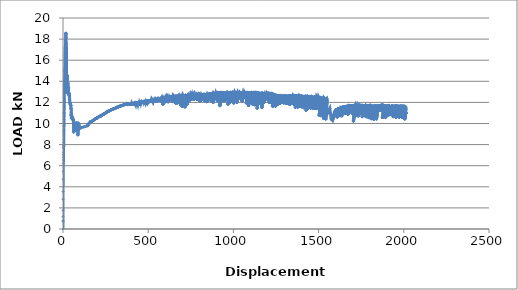
| Category | Series 0 |
|---|---|
| 0.0 | 0 |
| 0.1 | 0.731 |
| 0.1 | 0.772 |
| 0.2 | 1.182 |
| 0.4 | 1.762 |
| 0.2 | 2.816 |
| 0.4 | 3.547 |
| 1.2 | 4.716 |
| 1.7 | 5.472 |
| 2.1 | 6.233 |
| 2.5 | 6.541 |
| 2.5 | 6.817 |
| 2.7 | 7.037 |
| 3.1 | 7.277 |
| 3.4 | 7.614 |
| 3.6 | 7.684 |
| 3.7 | 7.78 |
| 3.8 | 7.901 |
| 3.7 | 8.169 |
| 3.9 | 8.473 |
| 4.6 | 8.924 |
| 4.6 | 9.165 |
| 4.9 | 9.346 |
| 4.9 | 9.458 |
| 5.2 | 9.715 |
| 5.2 | 9.853 |
| 5.5 | 10.133 |
| 5.6 | 10.359 |
| 6.2 | 10.676 |
| 6.3 | 10.802 |
| 6.5 | 10.89 |
| 6.5 | 10.94 |
| 6.5 | 11.046 |
| 6.6 | 11.286 |
| 6.9 | 11.54 |
| 7.2 | 11.979 |
| 7.5 | 12.206 |
| 7.7 | 12.394 |
| 7.7 | 12.532 |
| 7.8 | 12.82 |
| 8.1 | 13.071 |
| 8.5 | 13.345 |
| 8.9 | 13.573 |
| 8.9 | 13.619 |
| 8.9 | 13.671 |
| 9.0 | 13.78 |
| 9.4 | 14.047 |
| 9.6 | 14.248 |
| 9.7 | 14.481 |
| 10.0 | 14.672 |
| 10.3 | 14.908 |
| 10.6 | 15.036 |
| 10.8 | 15.135 |
| 10.7 | 15.183 |
| 11.0 | 15.326 |
| 11.2 | 15.461 |
| 11.4 | 15.629 |
| 11.5 | 15.807 |
| 11.5 | 15.944 |
| 11.8 | 16.232 |
| 12.0 | 16.475 |
| 12.5 | 16.856 |
| 12.8 | 17.008 |
| 13.1 | 17.062 |
| 13.1 | 17.056 |
| 13.2 | 17.079 |
| 13.4 | 17.124 |
| 13.5 | 17.217 |
| 14.0 | 17.317 |
| 14.4 | 17.356 |
| 14.5 | 17.342 |
| 14.2 | 17.288 |
| 14.5 | 17.336 |
| 14.6 | 17.454 |
| 15.0 | 17.661 |
| 15.1 | 17.725 |
| 15.2 | 17.783 |
| 15.3 | 17.84 |
| 15.5 | 18.006 |
| 15.8 | 18.157 |
| 16.0 | 18.31 |
| 16.3 | 18.41 |
| 16.5 | 18.492 |
| 16.7 | 18.592 |
| 17.0 | 18.587 |
| 17.6 | 18.541 |
| 17.8 | 18.467 |
| 17.9 | 18.152 |
| 17.8 | 17.904 |
| 17.9 | 17.732 |
| 18.2 | 17.679 |
| 18.4 | 17.642 |
| 18.4 | 17.598 |
| 18.8 | 17.542 |
| 19.0 | 17.501 |
| 19.3 | 17.44 |
| 20.2 | 17.125 |
| 21.0 | 16.65 |
| 21.1 | 15.382 |
| 20.3 | 14.227 |
| 19.0 | 12.898 |
| 18.8 | 12.885 |
| 19.6 | 13.461 |
| 19.9 | 13.871 |
| 20.3 | 14.078 |
| 20.2 | 14.096 |
| 20.3 | 14.102 |
| 20.4 | 14.192 |
| 20.8 | 14.307 |
| 21.0 | 14.466 |
| 21.2 | 14.553 |
| 21.7 | 14.587 |
| 21.7 | 14.578 |
| 22.0 | 14.49 |
| 22.0 | 14.438 |
| 22.2 | 14.433 |
| 22.3 | 14.44 |
| 22.4 | 14.446 |
| 22.4 | 14.444 |
| 22.7 | 14.49 |
| 23.1 | 14.575 |
| 23.4 | 14.611 |
| 23.7 | 14.53 |
| 23.9 | 14.426 |
| 24.2 | 14.408 |
| 24.3 | 14.463 |
| 24.8 | 14.505 |
| 25.3 | 14.48 |
| 25.8 | 14.393 |
| 25.9 | 14.266 |
| 25.6 | 13.951 |
| 25.4 | 13.834 |
| 25.4 | 13.817 |
| 25.9 | 13.904 |
| 26.1 | 13.967 |
| 26.1 | 13.994 |
| 26.4 | 13.991 |
| 26.8 | 13.997 |
| 27.1 | 13.996 |
| 27.2 | 13.931 |
| 27.1 | 13.888 |
| 27.3 | 13.86 |
| 27.5 | 13.854 |
| 27.8 | 13.847 |
| 27.9 | 13.831 |
| 28.1 | 13.816 |
| 28.4 | 13.791 |
| 28.6 | 13.776 |
| 29.0 | 13.753 |
| 29.2 | 13.696 |
| 29.1 | 13.582 |
| 29.2 | 13.506 |
| 29.3 | 13.467 |
| 29.3 | 13.465 |
| 29.6 | 13.466 |
| 29.9 | 13.47 |
| 30.0 | 13.47 |
| 30.1 | 13.456 |
| 30.3 | 13.447 |
| 30.6 | 13.446 |
| 31.0 | 13.448 |
| 31.2 | 13.433 |
| 31.3 | 13.415 |
| 31.6 | 13.389 |
| 31.7 | 13.372 |
| 32.0 | 13.34 |
| 32.3 | 13.305 |
| 32.5 | 13.248 |
| 32.8 | 13.084 |
| 32.8 | 12.944 |
| 32.6 | 12.783 |
| 32.6 | 12.743 |
| 32.8 | 12.744 |
| 33.0 | 12.812 |
| 33.4 | 12.908 |
| 33.5 | 12.914 |
| 33.7 | 12.897 |
| 33.9 | 12.887 |
| 34.2 | 12.877 |
| 34.3 | 12.858 |
| 34.5 | 12.845 |
| 34.9 | 12.825 |
| 35.0 | 12.802 |
| 34.9 | 12.732 |
| 34.9 | 12.693 |
| 35.1 | 12.704 |
| 35.4 | 12.735 |
| 35.7 | 12.784 |
| 36.1 | 12.783 |
| 36.3 | 12.757 |
| 36.4 | 12.722 |
| 36.6 | 12.691 |
| 36.8 | 12.657 |
| 36.9 | 12.643 |
| 37.0 | 12.622 |
| 37.3 | 12.612 |
| 37.6 | 12.594 |
| 37.7 | 12.567 |
| 38.0 | 12.492 |
| 38.0 | 12.426 |
| 38.1 | 12.36 |
| 38.2 | 12.339 |
| 38.6 | 12.327 |
| 38.8 | 12.317 |
| 39.2 | 12.3 |
| 39.4 | 12.219 |
| 39.4 | 12.136 |
| 39.4 | 12.019 |
| 39.4 | 11.982 |
| 39.6 | 11.968 |
| 39.8 | 11.968 |
| 39.9 | 11.965 |
| 40.1 | 11.965 |
| 40.2 | 11.977 |
| 40.5 | 11.996 |
| 40.8 | 12.006 |
| 41.0 | 12 |
| 41.1 | 11.985 |
| 41.4 | 11.966 |
| 41.5 | 11.954 |
| 41.8 | 11.937 |
| 41.9 | 11.925 |
| 42.3 | 11.907 |
| 42.4 | 11.893 |
| 42.5 | 11.872 |
| 42.7 | 11.855 |
| 42.8 | 11.836 |
| 43.0 | 11.83 |
| 43.1 | 11.817 |
| 43.4 | 11.81 |
| 43.6 | 11.801 |
| 43.7 | 11.789 |
| 43.8 | 11.781 |
| 44.0 | 11.771 |
| 44.2 | 11.765 |
| 44.4 | 11.756 |
| 44.5 | 11.75 |
| 44.5 | 11.742 |
| 45.0 | 11.741 |
| 45.2 | 11.737 |
| 45.5 | 11.73 |
| 45.6 | 11.714 |
| 46.1 | 11.693 |
| 46.2 | 11.667 |
| 46.4 | 11.563 |
| 46.4 | 11.485 |
| 46.4 | 11.418 |
| 46.5 | 11.395 |
| 46.5 | 11.383 |
| 46.9 | 11.399 |
| 47.5 | 11.411 |
| 47.7 | 11.405 |
| 48.1 | 11.315 |
| 48.3 | 11.203 |
| 48.3 | 11.035 |
| 48.3 | 10.821 |
| 48.2 | 10.728 |
| 48.3 | 10.7 |
| 48.3 | 10.7 |
| 48.4 | 10.736 |
| 48.5 | 10.802 |
| 49.0 | 10.906 |
| 49.5 | 10.932 |
| 50.2 | 10.923 |
| 50.2 | 10.813 |
| 50.0 | 10.552 |
| 49.6 | 10.451 |
| 49.7 | 10.49 |
| 50.1 | 10.6 |
| 50.7 | 10.705 |
| 51.2 | 10.745 |
| 51.2 | 10.685 |
| 51.2 | 10.591 |
| 51.2 | 10.544 |
| 51.3 | 10.544 |
| 51.4 | 10.55 |
| 51.6 | 10.557 |
| 51.8 | 10.57 |
| 52.0 | 10.603 |
| 52.2 | 10.634 |
| 52.5 | 10.655 |
| 52.7 | 10.653 |
| 52.9 | 10.64 |
| 53.2 | 10.621 |
| 53.4 | 10.61 |
| 53.7 | 10.58 |
| 53.7 | 10.567 |
| 53.8 | 10.547 |
| 54.0 | 10.542 |
| 54.1 | 10.535 |
| 54.2 | 10.531 |
| 54.4 | 10.523 |
| 54.5 | 10.512 |
| 54.6 | 10.514 |
| 55.1 | 10.534 |
| 55.3 | 10.544 |
| 55.7 | 10.531 |
| 55.7 | 10.518 |
| 56.0 | 10.499 |
| 56.1 | 10.483 |
| 56.4 | 10.47 |
| 56.5 | 10.462 |
| 56.7 | 10.45 |
| 56.9 | 10.439 |
| 57.0 | 10.431 |
| 57.1 | 10.419 |
| 57.3 | 10.411 |
| 57.6 | 10.399 |
| 57.7 | 10.391 |
| 57.7 | 10.38 |
| 58.0 | 10.374 |
| 58.2 | 10.369 |
| 58.3 | 10.365 |
| 58.5 | 10.356 |
| 58.8 | 10.35 |
| 58.9 | 10.344 |
| 58.9 | 10.331 |
| 59.0 | 10.325 |
| 59.2 | 10.324 |
| 59.5 | 10.33 |
| 59.7 | 10.338 |
| 59.9 | 10.347 |
| 60.4 | 10.348 |
| 60.7 | 10.339 |
| 60.7 | 10.298 |
| 60.8 | 10.27 |
| 61.0 | 10.247 |
| 61.1 | 10.242 |
| 61.2 | 10.233 |
| 61.4 | 10.227 |
| 61.4 | 10.227 |
| 61.6 | 10.232 |
| 61.5 | 10.232 |
| 62.2 | 10.276 |
| 63.1 | 10.333 |
| 64.2 | 10.181 |
| 63.5 | 9.764 |
| 62.2 | 9.191 |
| 62.0 | 9.121 |
| 62.7 | 9.378 |
| 63.6 | 9.831 |
| 64.1 | 9.915 |
| 63.9 | 9.801 |
| 63.7 | 9.707 |
| 63.6 | 9.683 |
| 64.0 | 9.804 |
| 64.7 | 9.967 |
| 65.2 | 10.015 |
| 65.0 | 9.904 |
| 65.0 | 9.81 |
| 64.7 | 9.745 |
| 65.2 | 9.837 |
| 65.8 | 10.016 |
| 66.2 | 10.061 |
| 66.2 | 10.014 |
| 66.1 | 9.898 |
| 66.0 | 9.833 |
| 66.1 | 9.87 |
| 66.4 | 9.952 |
| 66.9 | 10.053 |
| 67.3 | 10.073 |
| 67.8 | 10.036 |
| 67.8 | 9.953 |
| 67.4 | 9.796 |
| 67.3 | 9.72 |
| 67.5 | 9.838 |
| 68.0 | 9.964 |
| 68.5 | 10.05 |
| 69.0 | 10.053 |
| 68.8 | 9.979 |
| 68.7 | 9.831 |
| 68.7 | 9.798 |
| 68.8 | 9.832 |
| 69.1 | 9.907 |
| 69.6 | 10.015 |
| 69.8 | 10.037 |
| 70.1 | 10.029 |
| 70.3 | 10.015 |
| 70.3 | 10.004 |
| 70.6 | 9.995 |
| 70.9 | 9.986 |
| 71.0 | 9.969 |
| 71.0 | 9.953 |
| 71.2 | 9.944 |
| 71.6 | 9.945 |
| 71.8 | 9.932 |
| 71.7 | 9.918 |
| 71.8 | 9.903 |
| 71.9 | 9.903 |
| 72.2 | 9.904 |
| 72.3 | 9.907 |
| 72.4 | 9.916 |
| 72.5 | 9.944 |
| 72.9 | 9.976 |
| 73.4 | 10.012 |
| 73.6 | 10.019 |
| 73.9 | 9.984 |
| 73.9 | 9.944 |
| 73.8 | 9.892 |
| 73.7 | 9.873 |
| 74.1 | 9.927 |
| 74.4 | 9.981 |
| 75.0 | 10.025 |
| 75.3 | 9.976 |
| 75.3 | 9.88 |
| 75.0 | 9.738 |
| 75.0 | 9.734 |
| 75.4 | 9.794 |
| 75.7 | 9.848 |
| 75.8 | 9.892 |
| 76.0 | 9.887 |
| 76.1 | 9.882 |
| 76.2 | 9.89 |
| 76.3 | 9.945 |
| 76.7 | 10.021 |
| 77.7 | 10.092 |
| 78.0 | 10.043 |
| 77.6 | 9.864 |
| 77.0 | 9.585 |
| 76.9 | 9.611 |
| 77.9 | 9.886 |
| 78.8 | 10.09 |
| 79.5 | 10.008 |
| 79.2 | 9.691 |
| 78.0 | 9.276 |
| 77.9 | 9.254 |
| 78.7 | 9.67 |
| 79.5 | 9.939 |
| 80.1 | 9.999 |
| 80.0 | 9.781 |
| 79.8 | 9.575 |
| 79.3 | 9.441 |
| 79.5 | 9.549 |
| 80.1 | 9.797 |
| 80.6 | 9.929 |
| 81.1 | 9.962 |
| 81.2 | 9.917 |
| 80.8 | 9.827 |
| 81.0 | 9.784 |
| 81.1 | 9.813 |
| 81.5 | 9.906 |
| 81.7 | 9.936 |
| 82.1 | 9.946 |
| 82.3 | 9.938 |
| 82.4 | 9.92 |
| 82.4 | 9.915 |
| 82.4 | 9.913 |
| 82.6 | 9.922 |
| 83.2 | 9.992 |
| 83.8 | 10.023 |
| 83.6 | 9.889 |
| 83.3 | 9.761 |
| 83.1 | 9.715 |
| 83.8 | 9.854 |
| 84.5 | 10.01 |
| 85.3 | 9.998 |
| 84.9 | 9.738 |
| 84.0 | 9.36 |
| 84.0 | 9.402 |
| 85.0 | 9.718 |
| 85.6 | 9.913 |
| 85.7 | 9.926 |
| 85.7 | 9.865 |
| 85.5 | 9.807 |
| 85.6 | 9.819 |
| 85.8 | 9.867 |
| 86.4 | 9.973 |
| 86.8 | 9.995 |
| 87.0 | 9.961 |
| 87.0 | 9.904 |
| 86.6 | 9.833 |
| 86.6 | 9.871 |
| 87.5 | 10.003 |
| 88.3 | 10.107 |
| 89.0 | 9.983 |
| 88.2 | 9.681 |
| 87.1 | 9.355 |
| 87.5 | 9.483 |
| 89.0 | 9.813 |
| 90.6 | 9.966 |
| 89.7 | 9.525 |
| 87.0 | 8.871 |
| 87.8 | 9.045 |
| 93.5 | 9.94 |
| 94.6 | 9.482 |
| 106.0 | 9.606 |
| 144.1 | 9.781 |
| 144.6 | 9.803 |
| 144.7 | 9.817 |
| 144.9 | 9.824 |
| 145.2 | 9.825 |
| 145.4 | 9.829 |
| 145.4 | 9.832 |
| 145.6 | 9.836 |
| 145.9 | 9.846 |
| 146.2 | 9.85 |
| 146.4 | 9.857 |
| 146.5 | 9.855 |
| 146.5 | 9.852 |
| 146.6 | 9.852 |
| 146.7 | 9.853 |
| 146.8 | 9.858 |
| 146.9 | 9.878 |
| 147.2 | 9.896 |
| 147.7 | 9.922 |
| 148.0 | 9.938 |
| 148.3 | 9.945 |
| 148.6 | 9.949 |
| 148.7 | 9.941 |
| 148.7 | 9.935 |
| 148.8 | 9.93 |
| 149.1 | 9.927 |
| 149.1 | 9.928 |
| 149.1 | 9.926 |
| 149.3 | 9.932 |
| 149.6 | 9.944 |
| 149.8 | 9.953 |
| 149.9 | 9.96 |
| 150.3 | 9.966 |
| 150.5 | 9.97 |
| 150.7 | 9.974 |
| 150.9 | 9.973 |
| 151.2 | 9.97 |
| 151.1 | 9.966 |
| 151.3 | 9.96 |
| 151.3 | 9.956 |
| 151.6 | 9.964 |
| 151.7 | 9.976 |
| 152.1 | 9.992 |
| 152.2 | 10.001 |
| 152.4 | 10.007 |
| 152.4 | 10.008 |
| 152.6 | 10.007 |
| 153.1 | 10.012 |
| 153.2 | 10.015 |
| 153.4 | 10.012 |
| 153.5 | 10.012 |
| 153.5 | 10.012 |
| 153.6 | 10.012 |
| 153.8 | 10.018 |
| 154.1 | 10.03 |
| 154.5 | 10.044 |
| 154.8 | 10.047 |
| 155.0 | 10.044 |
| 155.3 | 10.043 |
| 155.3 | 10.039 |
| 155.3 | 10.033 |
| 155.4 | 10.032 |
| 155.5 | 10.03 |
| 155.6 | 10.031 |
| 155.8 | 10.039 |
| 156.0 | 10.048 |
| 156.4 | 10.059 |
| 156.6 | 10.066 |
| 156.7 | 10.066 |
| 156.9 | 10.06 |
| 156.9 | 10.061 |
| 157.2 | 10.066 |
| 157.5 | 10.069 |
| 157.6 | 10.076 |
| 157.9 | 10.077 |
| 158.1 | 10.07 |
| 158.1 | 10.065 |
| 158.1 | 10.06 |
| 158.2 | 10.058 |
| 158.3 | 10.064 |
| 158.5 | 10.079 |
| 158.7 | 10.11 |
| 158.9 | 10.133 |
| 159.5 | 10.15 |
| 160.2 | 10.168 |
| 160.6 | 10.165 |
| 161.0 | 10.157 |
| 161.1 | 10.155 |
| 161.2 | 10.149 |
| 161.3 | 10.14 |
| 161.4 | 10.134 |
| 161.7 | 10.134 |
| 161.8 | 10.132 |
| 161.8 | 10.124 |
| 161.8 | 10.119 |
| 162.1 | 10.116 |
| 162.0 | 10.113 |
| 162.0 | 10.11 |
| 162.3 | 10.107 |
| 162.4 | 10.105 |
| 162.5 | 10.102 |
| 162.6 | 10.101 |
| 162.6 | 10.101 |
| 162.7 | 10.113 |
| 162.9 | 10.121 |
| 163.1 | 10.141 |
| 163.4 | 10.159 |
| 163.8 | 10.175 |
| 164.2 | 10.182 |
| 164.4 | 10.181 |
| 164.6 | 10.178 |
| 164.9 | 10.174 |
| 165.2 | 10.17 |
| 165.2 | 10.168 |
| 165.1 | 10.162 |
| 165.2 | 10.157 |
| 165.6 | 10.151 |
| 165.6 | 10.153 |
| 165.6 | 10.149 |
| 165.6 | 10.149 |
| 165.6 | 10.157 |
| 166.1 | 10.192 |
| 166.5 | 10.214 |
| 167.4 | 10.23 |
| 167.8 | 10.227 |
| 168.0 | 10.22 |
| 168.1 | 10.218 |
| 168.2 | 10.214 |
| 168.3 | 10.209 |
| 168.2 | 10.205 |
| 168.2 | 10.202 |
| 168.4 | 10.196 |
| 168.5 | 10.195 |
| 168.8 | 10.189 |
| 168.9 | 10.186 |
| 168.9 | 10.185 |
| 169.0 | 10.185 |
| 169.3 | 10.186 |
| 169.5 | 10.185 |
| 169.5 | 10.18 |
| 169.5 | 10.178 |
| 169.6 | 10.175 |
| 169.9 | 10.198 |
| 170.2 | 10.22 |
| 170.7 | 10.237 |
| 170.9 | 10.242 |
| 171.0 | 10.241 |
| 171.3 | 10.236 |
| 171.4 | 10.233 |
| 171.5 | 10.23 |
| 171.5 | 10.225 |
| 171.6 | 10.226 |
| 171.9 | 10.231 |
| 172.2 | 10.239 |
| 172.3 | 10.245 |
| 172.5 | 10.245 |
| 172.7 | 10.242 |
| 172.7 | 10.238 |
| 172.9 | 10.238 |
| 173.3 | 10.247 |
| 173.7 | 10.26 |
| 173.7 | 10.262 |
| 174.0 | 10.258 |
| 174.1 | 10.255 |
| 174.1 | 10.25 |
| 174.2 | 10.249 |
| 174.6 | 10.256 |
| 174.7 | 10.262 |
| 174.7 | 10.268 |
| 174.8 | 10.27 |
| 175.0 | 10.277 |
| 175.4 | 10.29 |
| 175.7 | 10.296 |
| 176.0 | 10.3 |
| 176.1 | 10.301 |
| 176.4 | 10.296 |
| 176.6 | 10.295 |
| 176.9 | 10.29 |
| 177.0 | 10.288 |
| 177.1 | 10.283 |
| 177.1 | 10.279 |
| 177.2 | 10.278 |
| 177.3 | 10.277 |
| 177.5 | 10.277 |
| 177.5 | 10.277 |
| 177.7 | 10.284 |
| 177.9 | 10.304 |
| 178.2 | 10.317 |
| 178.8 | 10.328 |
| 179.0 | 10.333 |
| 179.2 | 10.33 |
| 179.3 | 10.327 |
| 179.6 | 10.325 |
| 179.6 | 10.321 |
| 179.7 | 10.317 |
| 179.8 | 10.311 |
| 179.8 | 10.313 |
| 179.9 | 10.311 |
| 180.1 | 10.315 |
| 180.3 | 10.331 |
| 180.3 | 10.341 |
| 180.8 | 10.358 |
| 181.2 | 10.365 |
| 181.5 | 10.373 |
| 181.6 | 10.37 |
| 182.0 | 10.367 |
| 182.2 | 10.364 |
| 182.3 | 10.361 |
| 182.4 | 10.353 |
| 182.6 | 10.348 |
| 182.6 | 10.344 |
| 182.6 | 10.345 |
| 182.7 | 10.346 |
| 182.7 | 10.348 |
| 183.1 | 10.359 |
| 183.5 | 10.371 |
| 183.7 | 10.38 |
| 184.1 | 10.376 |
| 184.3 | 10.374 |
| 184.5 | 10.37 |
| 184.6 | 10.367 |
| 184.6 | 10.361 |
| 184.6 | 10.358 |
| 184.7 | 10.358 |
| 184.9 | 10.358 |
| 185.0 | 10.365 |
| 185.3 | 10.375 |
| 185.5 | 10.387 |
| 185.5 | 10.399 |
| 186.1 | 10.414 |
| 186.5 | 10.42 |
| 186.6 | 10.42 |
| 187.1 | 10.413 |
| 187.3 | 10.407 |
| 187.3 | 10.401 |
| 187.3 | 10.399 |
| 187.3 | 10.397 |
| 187.5 | 10.394 |
| 187.8 | 10.393 |
| 187.9 | 10.392 |
| 187.9 | 10.391 |
| 188.0 | 10.387 |
| 188.0 | 10.384 |
| 188.1 | 10.39 |
| 188.5 | 10.408 |
| 188.7 | 10.422 |
| 189.0 | 10.43 |
| 189.2 | 10.437 |
| 189.3 | 10.439 |
| 189.4 | 10.438 |
| 189.6 | 10.442 |
| 189.9 | 10.449 |
| 190.3 | 10.455 |
| 191.0 | 10.456 |
| 191.1 | 10.454 |
| 191.2 | 10.449 |
| 191.5 | 10.442 |
| 191.6 | 10.438 |
| 191.8 | 10.434 |
| 191.7 | 10.432 |
| 191.8 | 10.432 |
| 191.8 | 10.43 |
| 191.9 | 10.428 |
| 192.2 | 10.426 |
| 192.2 | 10.425 |
| 192.3 | 10.422 |
| 192.5 | 10.422 |
| 192.6 | 10.426 |
| 192.9 | 10.436 |
| 193.0 | 10.439 |
| 193.4 | 10.447 |
| 193.5 | 10.451 |
| 193.6 | 10.451 |
| 193.7 | 10.449 |
| 194.0 | 10.459 |
| 194.3 | 10.474 |
| 194.5 | 10.481 |
| 194.8 | 10.482 |
| 194.9 | 10.483 |
| 195.0 | 10.477 |
| 195.0 | 10.473 |
| 195.3 | 10.471 |
| 195.5 | 10.477 |
| 195.7 | 10.482 |
| 196.0 | 10.489 |
| 196.0 | 10.49 |
| 196.2 | 10.49 |
| 196.3 | 10.489 |
| 196.4 | 10.495 |
| 196.6 | 10.501 |
| 197.2 | 10.521 |
| 197.6 | 10.529 |
| 198.2 | 10.525 |
| 198.3 | 10.521 |
| 198.3 | 10.518 |
| 198.5 | 10.516 |
| 198.7 | 10.513 |
| 198.7 | 10.51 |
| 198.7 | 10.505 |
| 198.7 | 10.502 |
| 198.9 | 10.501 |
| 199.1 | 10.5 |
| 199.1 | 10.5 |
| 199.1 | 10.5 |
| 199.3 | 10.512 |
| 199.6 | 10.535 |
| 200.0 | 10.55 |
| 200.4 | 10.557 |
| 200.7 | 10.556 |
| 201.0 | 10.552 |
| 201.2 | 10.547 |
| 201.4 | 10.544 |
| 201.4 | 10.539 |
| 201.5 | 10.535 |
| 201.7 | 10.529 |
| 201.8 | 10.529 |
| 201.9 | 10.528 |
| 202.0 | 10.527 |
| 202.1 | 10.524 |
| 202.1 | 10.523 |
| 202.3 | 10.523 |
| 202.4 | 10.523 |
| 202.5 | 10.528 |
| 202.9 | 10.537 |
| 203.1 | 10.545 |
| 203.2 | 10.55 |
| 203.3 | 10.551 |
| 203.6 | 10.556 |
| 203.7 | 10.564 |
| 204.2 | 10.58 |
| 204.5 | 10.588 |
| 205.0 | 10.594 |
| 205.1 | 10.592 |
| 205.3 | 10.587 |
| 205.6 | 10.577 |
| 205.6 | 10.571 |
| 205.6 | 10.568 |
| 205.7 | 10.568 |
| 205.7 | 10.569 |
| 205.8 | 10.567 |
| 205.9 | 10.562 |
| 206.1 | 10.557 |
| 206.2 | 10.556 |
| 206.3 | 10.559 |
| 206.4 | 10.565 |
| 206.4 | 10.577 |
| 206.8 | 10.592 |
| 207.2 | 10.621 |
| 207.7 | 10.626 |
| 208.2 | 10.628 |
| 208.4 | 10.624 |
| 208.5 | 10.617 |
| 208.7 | 10.615 |
| 208.9 | 10.609 |
| 209.0 | 10.609 |
| 209.0 | 10.608 |
| 209.1 | 10.61 |
| 209.1 | 10.608 |
| 209.3 | 10.607 |
| 209.3 | 10.603 |
| 209.3 | 10.608 |
| 209.4 | 10.617 |
| 210.1 | 10.639 |
| 210.6 | 10.65 |
| 210.8 | 10.654 |
| 211.0 | 10.648 |
| 211.5 | 10.64 |
| 211.5 | 10.637 |
| 211.6 | 10.633 |
| 211.8 | 10.631 |
| 211.8 | 10.63 |
| 211.9 | 10.627 |
| 211.9 | 10.627 |
| 212.1 | 10.627 |
| 212.2 | 10.626 |
| 212.2 | 10.619 |
| 212.3 | 10.617 |
| 212.5 | 10.626 |
| 212.6 | 10.636 |
| 212.8 | 10.65 |
| 213.1 | 10.661 |
| 213.4 | 10.672 |
| 213.9 | 10.684 |
| 214.1 | 10.688 |
| 214.5 | 10.684 |
| 214.6 | 10.68 |
| 214.7 | 10.677 |
| 214.7 | 10.674 |
| 215.0 | 10.673 |
| 215.2 | 10.671 |
| 215.2 | 10.666 |
| 215.1 | 10.663 |
| 215.2 | 10.663 |
| 215.3 | 10.668 |
| 215.6 | 10.683 |
| 215.9 | 10.699 |
| 216.3 | 10.711 |
| 216.9 | 10.717 |
| 217.0 | 10.716 |
| 217.2 | 10.706 |
| 217.3 | 10.702 |
| 217.5 | 10.699 |
| 217.6 | 10.696 |
| 217.8 | 10.695 |
| 217.8 | 10.694 |
| 217.9 | 10.691 |
| 218.0 | 10.689 |
| 218.2 | 10.687 |
| 218.2 | 10.683 |
| 218.3 | 10.682 |
| 218.3 | 10.684 |
| 218.4 | 10.694 |
| 218.8 | 10.724 |
| 219.4 | 10.741 |
| 220.2 | 10.752 |
| 220.5 | 10.753 |
| 221.0 | 10.745 |
| 221.2 | 10.739 |
| 221.5 | 10.733 |
| 221.5 | 10.73 |
| 221.6 | 10.726 |
| 221.6 | 10.722 |
| 221.6 | 10.72 |
| 221.8 | 10.719 |
| 222.0 | 10.718 |
| 222.3 | 10.712 |
| 222.4 | 10.708 |
| 222.4 | 10.706 |
| 222.4 | 10.705 |
| 222.4 | 10.702 |
| 222.4 | 10.701 |
| 222.6 | 10.7 |
| 222.8 | 10.7 |
| 222.8 | 10.699 |
| 222.9 | 10.697 |
| 223.0 | 10.697 |
| 223.1 | 10.699 |
| 223.1 | 10.702 |
| 223.4 | 10.716 |
| 223.9 | 10.733 |
| 224.6 | 10.746 |
| 224.7 | 10.746 |
| 224.8 | 10.735 |
| 225.0 | 10.736 |
| 225.2 | 10.736 |
| 225.2 | 10.735 |
| 225.2 | 10.733 |
| 225.3 | 10.735 |
| 225.3 | 10.739 |
| 225.6 | 10.745 |
| 225.8 | 10.753 |
| 226.1 | 10.766 |
| 226.5 | 10.773 |
| 226.8 | 10.771 |
| 227.1 | 10.768 |
| 227.1 | 10.765 |
| 227.1 | 10.765 |
| 227.2 | 10.764 |
| 227.3 | 10.759 |
| 227.4 | 10.76 |
| 227.5 | 10.763 |
| 227.8 | 10.768 |
| 228.0 | 10.775 |
| 228.1 | 10.777 |
| 228.3 | 10.785 |
| 228.6 | 10.793 |
| 228.8 | 10.799 |
| 229.1 | 10.8 |
| 229.3 | 10.803 |
| 229.7 | 10.808 |
| 229.8 | 10.808 |
| 229.9 | 10.803 |
| 230.0 | 10.798 |
| 230.3 | 10.793 |
| 230.2 | 10.791 |
| 230.4 | 10.792 |
| 230.5 | 10.793 |
| 230.6 | 10.799 |
| 230.6 | 10.803 |
| 231.0 | 10.813 |
| 231.3 | 10.825 |
| 231.7 | 10.832 |
| 232.2 | 10.833 |
| 232.2 | 10.829 |
| 232.3 | 10.822 |
| 232.4 | 10.82 |
| 232.5 | 10.816 |
| 232.5 | 10.815 |
| 232.8 | 10.814 |
| 232.9 | 10.815 |
| 232.9 | 10.817 |
| 232.8 | 10.819 |
| 232.9 | 10.834 |
| 233.6 | 10.861 |
| 234.2 | 10.888 |
| 234.8 | 10.897 |
| 235.0 | 10.888 |
| 235.1 | 10.878 |
| 235.3 | 10.871 |
| 235.5 | 10.862 |
| 235.6 | 10.86 |
| 235.7 | 10.86 |
| 235.7 | 10.861 |
| 235.7 | 10.861 |
| 236.0 | 10.859 |
| 236.2 | 10.857 |
| 236.3 | 10.851 |
| 236.4 | 10.849 |
| 236.4 | 10.849 |
| 236.6 | 10.849 |
| 236.7 | 10.845 |
| 236.7 | 10.843 |
| 236.7 | 10.843 |
| 236.7 | 10.855 |
| 237.4 | 10.889 |
| 237.9 | 10.911 |
| 238.6 | 10.924 |
| 238.9 | 10.918 |
| 239.2 | 10.912 |
| 239.4 | 10.905 |
| 239.4 | 10.903 |
| 239.5 | 10.901 |
| 239.6 | 10.897 |
| 239.9 | 10.892 |
| 240.0 | 10.889 |
| 240.4 | 10.883 |
| 240.5 | 10.877 |
| 240.6 | 10.872 |
| 240.6 | 10.871 |
| 240.7 | 10.874 |
| 240.8 | 10.873 |
| 241.0 | 10.871 |
| 240.8 | 10.869 |
| 240.8 | 10.871 |
| 240.8 | 10.871 |
| 241.0 | 10.886 |
| 241.3 | 10.909 |
| 241.5 | 10.924 |
| 242.3 | 10.935 |
| 242.6 | 10.94 |
| 242.9 | 10.937 |
| 243.0 | 10.93 |
| 243.0 | 10.928 |
| 243.1 | 10.926 |
| 243.2 | 10.929 |
| 243.3 | 10.926 |
| 243.4 | 10.923 |
| 243.4 | 10.923 |
| 243.6 | 10.922 |
| 243.6 | 10.926 |
| 243.8 | 10.937 |
| 244.3 | 10.964 |
| 244.6 | 10.971 |
| 245.0 | 10.969 |
| 245.2 | 10.965 |
| 245.2 | 10.954 |
| 245.5 | 10.951 |
| 245.6 | 10.951 |
| 245.9 | 10.948 |
| 246.1 | 10.945 |
| 245.9 | 10.94 |
| 246.1 | 10.937 |
| 246.1 | 10.941 |
| 246.2 | 10.94 |
| 246.3 | 10.94 |
| 246.4 | 10.951 |
| 246.8 | 10.968 |
| 247.0 | 10.98 |
| 247.2 | 10.989 |
| 247.7 | 10.995 |
| 248.0 | 10.993 |
| 248.3 | 10.983 |
| 248.5 | 10.98 |
| 248.5 | 10.979 |
| 248.5 | 10.976 |
| 248.7 | 10.974 |
| 248.7 | 10.972 |
| 248.8 | 10.972 |
| 248.9 | 10.974 |
| 248.9 | 10.976 |
| 249.1 | 10.985 |
| 249.5 | 10.998 |
| 250.1 | 11.012 |
| 250.3 | 11.016 |
| 250.4 | 11.014 |
| 250.7 | 11.011 |
| 250.8 | 11.009 |
| 250.7 | 11.009 |
| 250.9 | 11.01 |
| 251.0 | 11.008 |
| 251.3 | 11.006 |
| 251.4 | 11.008 |
| 251.6 | 11.01 |
| 251.6 | 11.008 |
| 251.6 | 11.008 |
| 252.0 | 11.019 |
| 252.2 | 11.029 |
| 252.5 | 11.037 |
| 252.7 | 11.037 |
| 252.9 | 11.035 |
| 252.9 | 11.034 |
| 253.2 | 11.032 |
| 253.4 | 11.033 |
| 253.7 | 11.037 |
| 253.8 | 11.037 |
| 253.8 | 11.034 |
| 254.0 | 11.033 |
| 254.1 | 11.033 |
| 254.1 | 11.04 |
| 254.1 | 11.054 |
| 254.6 | 11.078 |
| 255.3 | 11.097 |
| 256.1 | 11.112 |
| 256.5 | 11.112 |
| 256.9 | 11.098 |
| 256.9 | 11.09 |
| 257.1 | 11.086 |
| 257.0 | 11.085 |
| 257.1 | 11.085 |
| 257.2 | 11.088 |
| 257.2 | 11.085 |
| 257.3 | 11.082 |
| 257.5 | 11.08 |
| 257.8 | 11.077 |
| 257.9 | 11.074 |
| 257.9 | 11.074 |
| 258.0 | 11.073 |
| 258.0 | 11.072 |
| 258.0 | 11.068 |
| 258.3 | 11.067 |
| 258.2 | 11.066 |
| 258.2 | 11.068 |
| 258.3 | 11.082 |
| 258.5 | 11.102 |
| 259.2 | 11.141 |
| 259.7 | 11.155 |
| 260.7 | 11.159 |
| 260.9 | 11.153 |
| 261.0 | 11.143 |
| 261.0 | 11.136 |
| 261.0 | 11.134 |
| 261.1 | 11.134 |
| 261.3 | 11.135 |
| 261.4 | 11.134 |
| 261.5 | 11.13 |
| 261.7 | 11.123 |
| 262.0 | 11.117 |
| 262.1 | 11.112 |
| 262.0 | 11.112 |
| 262.1 | 11.108 |
| 262.1 | 11.108 |
| 262.3 | 11.111 |
| 262.4 | 11.111 |
| 262.4 | 11.106 |
| 262.4 | 11.105 |
| 262.6 | 11.113 |
| 262.9 | 11.145 |
| 263.4 | 11.166 |
| 264.2 | 11.182 |
| 264.7 | 11.182 |
| 265.0 | 11.171 |
| 265.2 | 11.165 |
| 265.2 | 11.161 |
| 265.3 | 11.16 |
| 265.5 | 11.158 |
| 265.5 | 11.157 |
| 265.5 | 11.155 |
| 265.6 | 11.154 |
| 265.6 | 11.155 |
| 265.8 | 11.158 |
| 265.8 | 11.157 |
| 266.1 | 11.152 |
| 266.2 | 11.151 |
| 266.2 | 11.147 |
| 266.4 | 11.146 |
| 266.6 | 11.143 |
| 266.7 | 11.142 |
| 266.5 | 11.138 |
| 266.6 | 11.147 |
| 266.9 | 11.172 |
| 267.5 | 11.198 |
| 268.1 | 11.212 |
| 268.8 | 11.218 |
| 269.1 | 11.21 |
| 269.4 | 11.201 |
| 269.4 | 11.197 |
| 269.7 | 11.195 |
| 269.7 | 11.194 |
| 269.8 | 11.186 |
| 269.8 | 11.181 |
| 269.9 | 11.181 |
| 269.9 | 11.182 |
| 270.2 | 11.182 |
| 270.2 | 11.181 |
| 270.3 | 11.176 |
| 270.6 | 11.175 |
| 270.9 | 11.171 |
| 270.9 | 11.168 |
| 270.9 | 11.165 |
| 271.0 | 11.166 |
| 270.9 | 11.168 |
| 271.0 | 11.174 |
| 271.2 | 11.189 |
| 271.6 | 11.223 |
| 272.1 | 11.235 |
| 272.8 | 11.237 |
| 273.1 | 11.233 |
| 273.2 | 11.233 |
| 273.5 | 11.228 |
| 273.6 | 11.224 |
| 273.6 | 11.221 |
| 273.7 | 11.22 |
| 273.8 | 11.216 |
| 274.0 | 11.217 |
| 274.0 | 11.215 |
| 273.8 | 11.214 |
| 274.1 | 11.21 |
| 274.1 | 11.21 |
| 274.3 | 11.215 |
| 274.3 | 11.227 |
| 274.7 | 11.243 |
| 275.0 | 11.254 |
| 275.4 | 11.26 |
| 276.0 | 11.263 |
| 276.1 | 11.258 |
| 276.2 | 11.254 |
| 276.3 | 11.249 |
| 276.4 | 11.245 |
| 276.4 | 11.245 |
| 276.6 | 11.243 |
| 276.7 | 11.243 |
| 276.8 | 11.241 |
| 276.8 | 11.245 |
| 276.8 | 11.249 |
| 277.3 | 11.262 |
| 277.7 | 11.273 |
| 278.3 | 11.277 |
| 278.3 | 11.278 |
| 278.5 | 11.274 |
| 278.6 | 11.271 |
| 278.7 | 11.264 |
| 278.8 | 11.262 |
| 278.9 | 11.262 |
| 278.9 | 11.262 |
| 279.1 | 11.258 |
| 279.1 | 11.258 |
| 279.3 | 11.26 |
| 279.5 | 11.268 |
| 279.4 | 11.277 |
| 279.9 | 11.289 |
| 280.2 | 11.3 |
| 280.8 | 11.311 |
| 281.1 | 11.306 |
| 281.5 | 11.298 |
| 281.7 | 11.294 |
| 281.8 | 11.284 |
| 281.8 | 11.28 |
| 282.0 | 11.275 |
| 282.0 | 11.277 |
| 282.1 | 11.275 |
| 282.4 | 11.275 |
| 282.3 | 11.274 |
| 282.3 | 11.272 |
| 282.3 | 11.274 |
| 282.4 | 11.285 |
| 282.5 | 11.3 |
| 283.1 | 11.326 |
| 283.6 | 11.338 |
| 284.3 | 11.342 |
| 284.8 | 11.335 |
| 285.0 | 11.327 |
| 285.2 | 11.324 |
| 285.2 | 11.321 |
| 285.1 | 11.315 |
| 285.3 | 11.311 |
| 285.2 | 11.309 |
| 285.5 | 11.308 |
| 285.7 | 11.304 |
| 285.8 | 11.3 |
| 285.9 | 11.295 |
| 286.1 | 11.295 |
| 286.1 | 11.295 |
| 286.1 | 11.294 |
| 286.1 | 11.296 |
| 286.2 | 11.297 |
| 286.3 | 11.302 |
| 286.4 | 11.325 |
| 286.5 | 11.338 |
| 287.1 | 11.358 |
| 287.7 | 11.364 |
| 288.3 | 11.364 |
| 288.8 | 11.358 |
| 289.0 | 11.349 |
| 289.0 | 11.344 |
| 289.1 | 11.341 |
| 289.3 | 11.336 |
| 289.3 | 11.337 |
| 289.4 | 11.338 |
| 289.3 | 11.341 |
| 289.4 | 11.338 |
| 289.4 | 11.336 |
| 289.5 | 11.332 |
| 289.5 | 11.335 |
| 289.7 | 11.335 |
| 290.0 | 11.335 |
| 290.2 | 11.34 |
| 290.4 | 11.343 |
| 290.7 | 11.349 |
| 290.8 | 11.354 |
| 291.2 | 11.354 |
| 291.3 | 11.352 |
| 291.4 | 11.347 |
| 291.5 | 11.343 |
| 291.6 | 11.342 |
| 291.6 | 11.341 |
| 291.8 | 11.342 |
| 292.0 | 11.352 |
| 292.1 | 11.364 |
| 292.5 | 11.38 |
| 292.8 | 11.388 |
| 293.5 | 11.394 |
| 294.0 | 11.387 |
| 294.2 | 11.38 |
| 294.5 | 11.369 |
| 294.6 | 11.365 |
| 294.7 | 11.359 |
| 294.6 | 11.359 |
| 294.8 | 11.358 |
| 295.0 | 11.355 |
| 295.0 | 11.352 |
| 295.0 | 11.351 |
| 295.2 | 11.349 |
| 295.3 | 11.351 |
| 295.6 | 11.352 |
| 295.4 | 11.349 |
| 295.4 | 11.349 |
| 295.7 | 11.354 |
| 295.8 | 11.369 |
| 295.9 | 11.39 |
| 296.3 | 11.406 |
| 297.0 | 11.418 |
| 297.5 | 11.42 |
| 297.9 | 11.411 |
| 298.3 | 11.406 |
| 298.4 | 11.398 |
| 298.3 | 11.393 |
| 298.3 | 11.389 |
| 298.3 | 11.39 |
| 298.5 | 11.39 |
| 298.6 | 11.388 |
| 298.6 | 11.386 |
| 298.6 | 11.384 |
| 298.8 | 11.388 |
| 299.0 | 11.388 |
| 299.1 | 11.388 |
| 299.1 | 11.386 |
| 299.0 | 11.384 |
| 298.9 | 11.387 |
| 299.5 | 11.411 |
| 300.1 | 11.437 |
| 301.3 | 11.455 |
| 301.6 | 11.45 |
| 302.0 | 11.435 |
| 302.2 | 11.429 |
| 302.3 | 11.422 |
| 302.3 | 11.42 |
| 302.4 | 11.421 |
| 302.6 | 11.418 |
| 302.6 | 11.415 |
| 302.6 | 11.415 |
| 302.4 | 11.416 |
| 302.6 | 11.416 |
| 302.7 | 11.417 |
| 302.8 | 11.417 |
| 302.9 | 11.417 |
| 303.0 | 11.414 |
| 303.0 | 11.41 |
| 303.2 | 11.407 |
| 303.3 | 11.407 |
| 303.5 | 11.411 |
| 303.5 | 11.416 |
| 303.6 | 11.43 |
| 304.1 | 11.441 |
| 304.6 | 11.46 |
| 305.3 | 11.467 |
| 305.4 | 11.462 |
| 305.5 | 11.455 |
| 305.9 | 11.451 |
| 306.0 | 11.446 |
| 306.1 | 11.441 |
| 306.1 | 11.438 |
| 306.1 | 11.438 |
| 306.2 | 11.44 |
| 306.2 | 11.44 |
| 306.4 | 11.437 |
| 306.4 | 11.435 |
| 306.6 | 11.437 |
| 306.7 | 11.443 |
| 306.8 | 11.45 |
| 307.2 | 11.464 |
| 307.5 | 11.472 |
| 308.0 | 11.475 |
| 308.4 | 11.473 |
| 308.6 | 11.467 |
| 308.7 | 11.466 |
| 309.0 | 11.46 |
| 309.0 | 11.456 |
| 309.0 | 11.452 |
| 309.0 | 11.452 |
| 309.1 | 11.451 |
| 309.0 | 11.451 |
| 309.0 | 11.452 |
| 309.2 | 11.467 |
| 309.4 | 11.489 |
| 310.4 | 11.513 |
| 311.0 | 11.519 |
| 311.6 | 11.51 |
| 311.9 | 11.502 |
| 312.1 | 11.496 |
| 312.1 | 11.493 |
| 312.1 | 11.49 |
| 312.1 | 11.487 |
| 312.3 | 11.486 |
| 312.4 | 11.484 |
| 312.5 | 11.483 |
| 312.6 | 11.479 |
| 312.9 | 11.475 |
| 312.9 | 11.472 |
| 312.8 | 11.472 |
| 312.9 | 11.472 |
| 313.0 | 11.47 |
| 313.0 | 11.473 |
| 313.1 | 11.473 |
| 313.1 | 11.474 |
| 313.2 | 11.485 |
| 313.4 | 11.497 |
| 313.7 | 11.523 |
| 314.3 | 11.541 |
| 315.3 | 11.556 |
| 315.7 | 11.552 |
| 316.2 | 11.537 |
| 316.3 | 11.531 |
| 316.6 | 11.525 |
| 316.6 | 11.521 |
| 316.7 | 11.519 |
| 316.7 | 11.518 |
| 316.7 | 11.517 |
| 316.9 | 11.52 |
| 316.9 | 11.519 |
| 316.9 | 11.519 |
| 316.9 | 11.519 |
| 317.3 | 11.518 |
| 317.5 | 11.518 |
| 317.5 | 11.515 |
| 317.4 | 11.515 |
| 317.5 | 11.517 |
| 317.6 | 11.515 |
| 317.8 | 11.514 |
| 317.8 | 11.514 |
| 317.8 | 11.515 |
| 318.0 | 11.523 |
| 318.0 | 11.533 |
| 318.8 | 11.558 |
| 319.4 | 11.567 |
| 320.0 | 11.576 |
| 320.4 | 11.567 |
| 320.5 | 11.555 |
| 320.7 | 11.55 |
| 321.0 | 11.544 |
| 321.1 | 11.542 |
| 321.1 | 11.537 |
| 321.1 | 11.537 |
| 321.2 | 11.533 |
| 321.3 | 11.535 |
| 321.3 | 11.535 |
| 321.4 | 11.533 |
| 321.5 | 11.532 |
| 321.5 | 11.533 |
| 321.4 | 11.533 |
| 321.5 | 11.535 |
| 321.5 | 11.543 |
| 321.8 | 11.569 |
| 322.1 | 11.589 |
| 322.6 | 11.605 |
| 323.4 | 11.612 |
| 323.9 | 11.607 |
| 324.4 | 11.595 |
| 324.5 | 11.588 |
| 324.6 | 11.581 |
| 324.5 | 11.578 |
| 324.5 | 11.58 |
| 324.6 | 11.575 |
| 324.8 | 11.571 |
| 325.0 | 11.575 |
| 325.0 | 11.575 |
| 324.9 | 11.576 |
| 324.9 | 11.576 |
| 324.9 | 11.576 |
| 325.0 | 11.575 |
| 325.1 | 11.581 |
| 325.3 | 11.594 |
| 326.1 | 11.61 |
| 326.4 | 11.62 |
| 327.0 | 11.617 |
| 327.1 | 11.613 |
| 327.4 | 11.604 |
| 327.5 | 11.603 |
| 327.5 | 11.6 |
| 327.6 | 11.598 |
| 327.7 | 11.594 |
| 327.7 | 11.593 |
| 327.8 | 11.593 |
| 327.8 | 11.593 |
| 327.8 | 11.593 |
| 328.1 | 11.587 |
| 328.1 | 11.588 |
| 328.2 | 11.593 |
| 328.2 | 11.604 |
| 328.3 | 11.618 |
| 329.1 | 11.64 |
| 329.7 | 11.649 |
| 330.1 | 11.643 |
| 330.3 | 11.638 |
| 330.8 | 11.633 |
| 330.9 | 11.627 |
| 330.9 | 11.622 |
| 331.2 | 11.622 |
| 331.2 | 11.62 |
| 331.3 | 11.62 |
| 331.4 | 11.617 |
| 331.3 | 11.615 |
| 331.4 | 11.611 |
| 331.4 | 11.613 |
| 331.5 | 11.615 |
| 331.5 | 11.615 |
| 331.5 | 11.612 |
| 331.8 | 11.615 |
| 331.9 | 11.624 |
| 332.5 | 11.652 |
| 333.2 | 11.666 |
| 334.0 | 11.669 |
| 334.2 | 11.662 |
| 334.5 | 11.649 |
| 334.6 | 11.645 |
| 334.7 | 11.643 |
| 334.7 | 11.643 |
| 335.0 | 11.643 |
| 335.0 | 11.641 |
| 335.1 | 11.639 |
| 335.0 | 11.636 |
| 335.0 | 11.635 |
| 335.4 | 11.632 |
| 335.7 | 11.63 |
| 335.8 | 11.626 |
| 335.8 | 11.623 |
| 335.9 | 11.62 |
| 335.9 | 11.618 |
| 336.0 | 11.617 |
| 336.1 | 11.616 |
| 336.1 | 11.617 |
| 336.1 | 11.618 |
| 336.3 | 11.626 |
| 336.6 | 11.646 |
| 336.7 | 11.662 |
| 337.1 | 11.678 |
| 337.5 | 11.684 |
| 337.9 | 11.684 |
| 338.3 | 11.675 |
| 338.5 | 11.666 |
| 338.6 | 11.659 |
| 338.9 | 11.655 |
| 338.9 | 11.653 |
| 338.9 | 11.651 |
| 339.0 | 11.647 |
| 339.0 | 11.647 |
| 339.1 | 11.647 |
| 339.2 | 11.645 |
| 339.2 | 11.655 |
| 339.4 | 11.664 |
| 339.8 | 11.683 |
| 340.3 | 11.696 |
| 341.1 | 11.701 |
| 341.6 | 11.692 |
| 341.8 | 11.686 |
| 342.1 | 11.679 |
| 342.1 | 11.676 |
| 342.2 | 11.67 |
| 342.2 | 11.669 |
| 342.3 | 11.67 |
| 342.4 | 11.669 |
| 342.6 | 11.667 |
| 342.6 | 11.666 |
| 342.4 | 11.664 |
| 342.4 | 11.664 |
| 342.6 | 11.666 |
| 342.7 | 11.666 |
| 342.8 | 11.668 |
| 342.9 | 11.674 |
| 343.2 | 11.684 |
| 343.6 | 11.704 |
| 344.3 | 11.708 |
| 345.0 | 11.702 |
| 345.3 | 11.696 |
| 345.3 | 11.686 |
| 345.4 | 11.684 |
| 345.4 | 11.684 |
| 345.4 | 11.684 |
| 345.4 | 11.683 |
| 345.4 | 11.683 |
| 345.4 | 11.684 |
| 345.6 | 11.684 |
| 345.8 | 11.68 |
| 345.6 | 11.68 |
| 345.8 | 11.683 |
| 346.0 | 11.691 |
| 346.2 | 11.704 |
| 346.9 | 11.724 |
| 347.4 | 11.727 |
| 347.9 | 11.72 |
| 348.1 | 11.713 |
| 348.3 | 11.707 |
| 348.4 | 11.701 |
| 348.4 | 11.699 |
| 348.5 | 11.698 |
| 348.5 | 11.696 |
| 348.6 | 11.693 |
| 348.7 | 11.695 |
| 348.7 | 11.695 |
| 348.7 | 11.696 |
| 348.8 | 11.701 |
| 348.8 | 11.703 |
| 349.1 | 11.713 |
| 349.3 | 11.727 |
| 350.0 | 11.749 |
| 350.5 | 11.755 |
| 351.1 | 11.755 |
| 351.5 | 11.748 |
| 351.6 | 11.741 |
| 351.7 | 11.736 |
| 351.8 | 11.735 |
| 351.8 | 11.732 |
| 351.9 | 11.73 |
| 352.2 | 11.727 |
| 352.3 | 11.725 |
| 352.4 | 11.719 |
| 352.5 | 11.714 |
| 352.5 | 11.712 |
| 352.5 | 11.71 |
| 352.6 | 11.708 |
| 352.8 | 11.707 |
| 352.9 | 11.706 |
| 352.9 | 11.707 |
| 353.0 | 11.707 |
| 353.2 | 11.707 |
| 353.2 | 11.707 |
| 353.2 | 11.707 |
| 353.4 | 11.721 |
| 353.8 | 11.75 |
| 354.2 | 11.77 |
| 354.8 | 11.778 |
| 355.7 | 11.779 |
| 356.1 | 11.772 |
| 356.6 | 11.764 |
| 356.6 | 11.76 |
| 356.6 | 11.758 |
| 356.6 | 11.755 |
| 356.7 | 11.756 |
| 356.7 | 11.754 |
| 356.9 | 11.75 |
| 356.8 | 11.746 |
| 356.9 | 11.747 |
| 356.9 | 11.748 |
| 357.0 | 11.746 |
| 357.0 | 11.748 |
| 357.0 | 11.75 |
| 357.0 | 11.752 |
| 357.3 | 11.756 |
| 357.5 | 11.778 |
| 358.0 | 11.788 |
| 358.7 | 11.789 |
| 359.1 | 11.784 |
| 359.4 | 11.775 |
| 359.5 | 11.769 |
| 359.6 | 11.766 |
| 359.6 | 11.765 |
| 359.8 | 11.766 |
| 359.8 | 11.762 |
| 359.8 | 11.766 |
| 360.0 | 11.764 |
| 360.0 | 11.76 |
| 360.0 | 11.759 |
| 360.0 | 11.756 |
| 360.0 | 11.756 |
| 360.1 | 11.762 |
| 360.5 | 11.792 |
| 360.8 | 11.813 |
| 361.5 | 11.824 |
| 362.7 | 11.823 |
| 363.2 | 11.81 |
| 363.4 | 11.794 |
| 363.6 | 11.789 |
| 363.6 | 11.784 |
| 363.6 | 11.784 |
| 363.7 | 11.786 |
| 363.6 | 11.787 |
| 363.6 | 11.784 |
| 363.6 | 11.783 |
| 363.8 | 11.784 |
| 363.9 | 11.784 |
| 363.8 | 11.784 |
| 364.0 | 11.782 |
| 363.9 | 11.779 |
| 363.9 | 11.778 |
| 364.2 | 11.782 |
| 364.2 | 11.784 |
| 364.2 | 11.784 |
| 364.3 | 11.801 |
| 364.8 | 11.823 |
| 365.6 | 11.844 |
| 366.3 | 11.845 |
| 367.0 | 11.834 |
| 367.4 | 11.825 |
| 367.6 | 11.819 |
| 367.7 | 11.807 |
| 367.6 | 11.804 |
| 367.5 | 11.804 |
| 367.5 | 11.804 |
| 367.7 | 11.804 |
| 367.7 | 11.804 |
| 368.0 | 11.8 |
| 368.0 | 11.799 |
| 368.0 | 11.799 |
| 368.0 | 11.799 |
| 368.1 | 11.799 |
| 368.1 | 11.798 |
| 368.1 | 11.798 |
| 368.1 | 11.8 |
| 368.2 | 11.805 |
| 368.6 | 11.829 |
| 369.0 | 11.84 |
| 369.7 | 11.845 |
| 369.9 | 11.842 |
| 370.1 | 11.836 |
| 370.2 | 11.833 |
| 370.5 | 11.829 |
| 370.5 | 11.828 |
| 370.5 | 11.825 |
| 370.6 | 11.821 |
| 370.6 | 11.817 |
| 370.7 | 11.813 |
| 370.7 | 11.815 |
| 370.8 | 11.818 |
| 370.8 | 11.825 |
| 371.3 | 11.847 |
| 371.8 | 11.868 |
| 372.5 | 11.882 |
| 372.9 | 11.876 |
| 373.7 | 11.864 |
| 373.9 | 11.853 |
| 374.1 | 11.839 |
| 374.2 | 11.838 |
| 374.2 | 11.834 |
| 374.2 | 11.829 |
| 374.2 | 11.828 |
| 374.1 | 11.828 |
| 374.1 | 11.827 |
| 374.4 | 11.823 |
| 374.4 | 11.824 |
| 374.4 | 11.828 |
| 374.5 | 11.827 |
| 374.4 | 11.827 |
| 374.5 | 11.827 |
| 374.6 | 11.824 |
| 374.5 | 11.83 |
| 374.6 | 11.85 |
| 375.4 | 11.885 |
| 376.1 | 11.905 |
| 377.0 | 11.905 |
| 377.5 | 11.892 |
| 378.0 | 11.881 |
| 378.3 | 11.874 |
| 378.0 | 11.864 |
| 378.0 | 11.862 |
| 378.4 | 11.856 |
| 378.2 | 11.853 |
| 378.2 | 11.851 |
| 378.2 | 11.851 |
| 378.2 | 11.85 |
| 378.2 | 11.849 |
| 378.2 | 11.847 |
| 378.4 | 11.846 |
| 378.4 | 11.846 |
| 378.4 | 11.845 |
| 378.4 | 11.84 |
| 378.5 | 11.842 |
| 378.5 | 11.857 |
| 379.0 | 11.879 |
| 380.3 | 11.903 |
| 381.1 | 11.908 |
| 382.0 | 11.891 |
| 382.2 | 11.874 |
| 382.3 | 11.856 |
| 382.3 | 11.845 |
| 382.4 | 11.832 |
| 382.3 | 11.824 |
| 382.4 | 11.816 |
| 382.3 | 11.809 |
| 382.2 | 11.801 |
| 382.3 | 11.795 |
| 382.3 | 11.792 |
| 382.3 | 11.789 |
| 382.4 | 11.788 |
| 382.4 | 11.783 |
| 382.3 | 11.781 |
| 382.4 | 11.777 |
| 382.4 | 11.777 |
| 382.6 | 11.792 |
| 382.8 | 11.806 |
| 383.9 | 11.827 |
| 384.5 | 11.834 |
| 385.2 | 11.824 |
| 385.4 | 11.811 |
| 385.4 | 11.8 |
| 385.5 | 11.792 |
| 385.6 | 11.787 |
| 385.6 | 11.782 |
| 385.6 | 11.782 |
| 385.6 | 11.779 |
| 385.6 | 11.777 |
| 385.6 | 11.771 |
| 385.6 | 11.771 |
| 385.8 | 11.77 |
| 385.9 | 11.771 |
| 386.0 | 11.771 |
| 386.1 | 11.779 |
| 386.1 | 11.787 |
| 386.6 | 11.804 |
| 387.1 | 11.815 |
| 388.0 | 11.816 |
| 388.5 | 11.807 |
| 388.6 | 11.792 |
| 388.6 | 11.787 |
| 388.8 | 11.779 |
| 388.8 | 11.776 |
| 389.0 | 11.775 |
| 389.0 | 11.772 |
| 389.0 | 11.771 |
| 389.2 | 11.77 |
| 389.3 | 11.771 |
| 389.2 | 11.769 |
| 389.1 | 11.767 |
| 389.2 | 11.772 |
| 389.3 | 11.781 |
| 389.7 | 11.799 |
| 390.3 | 11.812 |
| 391.0 | 11.823 |
| 391.1 | 11.818 |
| 391.3 | 11.806 |
| 391.5 | 11.801 |
| 391.5 | 11.801 |
| 391.6 | 11.799 |
| 391.7 | 11.795 |
| 391.7 | 11.792 |
| 391.8 | 11.792 |
| 391.7 | 11.793 |
| 391.7 | 11.793 |
| 391.9 | 11.805 |
| 392.2 | 11.818 |
| 392.8 | 11.84 |
| 393.2 | 11.841 |
| 393.8 | 11.836 |
| 394.0 | 11.829 |
| 394.1 | 11.821 |
| 394.3 | 11.809 |
| 394.2 | 11.804 |
| 394.4 | 11.799 |
| 394.5 | 11.799 |
| 394.7 | 11.799 |
| 394.7 | 11.799 |
| 394.7 | 11.799 |
| 394.7 | 11.798 |
| 394.9 | 11.799 |
| 395.1 | 11.802 |
| 395.1 | 11.805 |
| 395.1 | 11.81 |
| 395.6 | 11.821 |
| 396.3 | 11.841 |
| 397.0 | 11.844 |
| 397.6 | 11.829 |
| 397.8 | 11.817 |
| 398.0 | 11.801 |
| 398.1 | 11.796 |
| 398.2 | 11.793 |
| 398.2 | 11.792 |
| 398.2 | 11.789 |
| 398.2 | 11.789 |
| 398.1 | 11.79 |
| 398.1 | 11.792 |
| 398.2 | 11.79 |
| 398.5 | 11.79 |
| 398.5 | 11.794 |
| 398.5 | 11.794 |
| 398.6 | 11.794 |
| 398.6 | 11.794 |
| 398.6 | 11.804 |
| 398.9 | 11.832 |
| 399.5 | 11.856 |
| 401.0 | 11.875 |
| 401.8 | 11.865 |
| 402.3 | 11.85 |
| 402.1 | 11.815 |
| 402.0 | 11.79 |
| 401.9 | 11.77 |
| 402.1 | 11.766 |
| 402.3 | 11.765 |
| 402.1 | 11.765 |
| 402.1 | 11.761 |
| 402.0 | 11.76 |
| 402.3 | 11.76 |
| 402.3 | 11.764 |
| 402.1 | 11.764 |
| 402.1 | 11.762 |
| 402.3 | 11.772 |
| 402.4 | 11.789 |
| 402.4 | 11.806 |
| 402.6 | 11.828 |
| 402.6 | 11.847 |
| 403.3 | 11.876 |
| 404.2 | 11.897 |
| 405.5 | 11.902 |
| 405.9 | 11.886 |
| 406.2 | 11.851 |
| 406.3 | 11.822 |
| 406.2 | 11.782 |
| 406.1 | 11.766 |
| 406.2 | 11.759 |
| 406.2 | 11.758 |
| 406.2 | 11.758 |
| 406.1 | 11.755 |
| 405.9 | 11.758 |
| 405.8 | 11.765 |
| 405.9 | 11.767 |
| 406.1 | 11.775 |
| 406.3 | 11.787 |
| 406.4 | 11.802 |
| 406.4 | 11.811 |
| 406.5 | 11.832 |
| 406.8 | 11.849 |
| 406.8 | 11.862 |
| 407.1 | 11.88 |
| 407.7 | 11.896 |
| 408.7 | 11.91 |
| 408.9 | 11.907 |
| 409.1 | 11.897 |
| 409.3 | 11.892 |
| 409.4 | 11.886 |
| 409.4 | 11.886 |
| 409.5 | 11.884 |
| 409.5 | 11.882 |
| 409.6 | 11.882 |
| 409.9 | 11.884 |
| 409.9 | 11.881 |
| 409.9 | 11.881 |
| 409.7 | 11.879 |
| 409.7 | 11.882 |
| 409.9 | 11.886 |
| 410.3 | 11.909 |
| 411.0 | 11.93 |
| 412.5 | 11.933 |
| 413.4 | 11.918 |
| 413.7 | 11.88 |
| 413.4 | 11.836 |
| 413.3 | 11.8 |
| 413.2 | 11.764 |
| 413.2 | 11.756 |
| 413.1 | 11.756 |
| 413.2 | 11.755 |
| 413.1 | 11.756 |
| 413.1 | 11.758 |
| 413.2 | 11.756 |
| 413.3 | 11.755 |
| 413.3 | 11.762 |
| 413.3 | 11.767 |
| 413.4 | 11.782 |
| 413.5 | 11.8 |
| 413.7 | 11.829 |
| 413.8 | 11.85 |
| 414.0 | 11.87 |
| 414.4 | 11.895 |
| 414.6 | 11.902 |
| 415.0 | 11.907 |
| 415.1 | 11.908 |
| 415.0 | 11.903 |
| 415.1 | 11.902 |
| 415.4 | 11.92 |
| 415.6 | 11.933 |
| 416.0 | 11.942 |
| 416.6 | 11.944 |
| 417.5 | 11.942 |
| 418.2 | 11.925 |
| 418.4 | 11.913 |
| 418.5 | 11.895 |
| 418.5 | 11.882 |
| 418.6 | 11.863 |
| 418.6 | 11.853 |
| 418.6 | 11.85 |
| 418.5 | 11.849 |
| 418.5 | 11.847 |
| 418.5 | 11.846 |
| 418.5 | 11.849 |
| 418.5 | 11.852 |
| 418.6 | 11.856 |
| 418.6 | 11.867 |
| 418.6 | 11.876 |
| 418.8 | 11.895 |
| 419.1 | 11.915 |
| 419.6 | 11.942 |
| 419.9 | 11.949 |
| 420.7 | 11.947 |
| 421.0 | 11.941 |
| 421.1 | 11.931 |
| 421.3 | 11.93 |
| 421.4 | 11.922 |
| 421.5 | 11.92 |
| 421.6 | 11.916 |
| 421.5 | 11.914 |
| 421.5 | 11.914 |
| 421.6 | 11.912 |
| 421.7 | 11.913 |
| 421.8 | 11.915 |
| 422.0 | 11.914 |
| 422.0 | 11.912 |
| 422.0 | 11.916 |
| 422.1 | 11.941 |
| 422.3 | 11.961 |
| 423.2 | 11.977 |
| 425.1 | 11.981 |
| 426.0 | 11.97 |
| 426.2 | 11.91 |
| 425.8 | 11.853 |
| 425.3 | 11.789 |
| 425.3 | 11.77 |
| 425.3 | 11.762 |
| 425.3 | 11.766 |
| 425.2 | 11.766 |
| 425.4 | 11.769 |
| 425.5 | 11.773 |
| 425.4 | 11.776 |
| 425.5 | 11.775 |
| 425.5 | 11.781 |
| 425.6 | 11.789 |
| 425.6 | 11.805 |
| 425.6 | 11.822 |
| 425.9 | 11.861 |
| 426.1 | 11.892 |
| 426.1 | 11.927 |
| 426.5 | 11.949 |
| 427.4 | 11.977 |
| 428.0 | 11.989 |
| 428.7 | 11.981 |
| 428.8 | 11.97 |
| 428.7 | 11.959 |
| 428.8 | 11.945 |
| 428.8 | 11.943 |
| 429.0 | 11.947 |
| 429.1 | 11.944 |
| 429.2 | 11.939 |
| 429.1 | 11.939 |
| 429.1 | 11.942 |
| 429.1 | 11.941 |
| 429.0 | 11.947 |
| 429.1 | 11.954 |
| 429.6 | 11.979 |
| 430.0 | 11.994 |
| 430.4 | 12.002 |
| 430.9 | 11.999 |
| 431.3 | 11.994 |
| 432.1 | 11.973 |
| 432.3 | 11.961 |
| 432.5 | 11.942 |
| 432.6 | 11.931 |
| 432.6 | 11.922 |
| 432.6 | 11.921 |
| 432.8 | 11.92 |
| 432.9 | 11.919 |
| 432.9 | 11.914 |
| 432.8 | 11.913 |
| 432.8 | 11.912 |
| 432.8 | 11.919 |
| 432.8 | 11.919 |
| 432.9 | 11.924 |
| 433.0 | 11.931 |
| 433.2 | 11.943 |
| 433.5 | 11.949 |
| 433.7 | 11.953 |
| 433.8 | 11.952 |
| 433.8 | 11.948 |
| 434.0 | 11.95 |
| 434.1 | 11.968 |
| 434.5 | 11.981 |
| 435.9 | 11.988 |
| 437.9 | 11.978 |
| 438.3 | 11.955 |
| 438.1 | 11.863 |
| 437.8 | 11.804 |
| 437.3 | 11.752 |
| 437.3 | 11.735 |
| 437.3 | 11.722 |
| 437.2 | 11.721 |
| 437.2 | 11.72 |
| 437.2 | 11.722 |
| 437.3 | 11.727 |
| 437.4 | 11.731 |
| 437.4 | 11.732 |
| 437.4 | 11.739 |
| 437.4 | 11.746 |
| 437.5 | 11.767 |
| 437.6 | 11.79 |
| 437.9 | 11.821 |
| 438.0 | 11.846 |
| 438.2 | 11.88 |
| 438.3 | 11.896 |
| 438.7 | 11.916 |
| 438.8 | 11.93 |
| 438.8 | 11.936 |
| 439.3 | 11.944 |
| 439.7 | 11.954 |
| 440.2 | 11.964 |
| 440.5 | 11.958 |
| 440.7 | 11.949 |
| 440.8 | 11.947 |
| 441.0 | 11.942 |
| 441.1 | 11.941 |
| 441.2 | 11.942 |
| 441.2 | 11.939 |
| 441.4 | 11.938 |
| 441.4 | 11.937 |
| 441.4 | 11.935 |
| 441.4 | 11.933 |
| 441.3 | 11.933 |
| 441.7 | 11.956 |
| 442.0 | 11.979 |
| 443.8 | 12.005 |
| 445.1 | 11.996 |
| 445.8 | 11.948 |
| 445.5 | 11.882 |
| 445.0 | 11.795 |
| 444.9 | 11.769 |
| 444.9 | 11.76 |
| 444.9 | 11.754 |
| 444.9 | 11.753 |
| 444.9 | 11.754 |
| 444.9 | 11.755 |
| 445.1 | 11.756 |
| 445.2 | 11.759 |
| 445.2 | 11.758 |
| 445.1 | 11.758 |
| 445.2 | 11.766 |
| 445.5 | 11.775 |
| 445.5 | 11.784 |
| 445.5 | 11.796 |
| 445.6 | 11.825 |
| 445.7 | 11.857 |
| 445.8 | 11.885 |
| 446.2 | 11.924 |
| 446.5 | 11.941 |
| 446.9 | 11.956 |
| 447.0 | 11.959 |
| 447.1 | 11.958 |
| 447.2 | 11.96 |
| 447.2 | 11.965 |
| 447.4 | 11.972 |
| 447.5 | 11.985 |
| 448.0 | 12.012 |
| 448.9 | 12.021 |
| 450.9 | 12.015 |
| 451.6 | 11.99 |
| 451.3 | 11.901 |
| 450.9 | 11.834 |
| 450.7 | 11.781 |
| 450.7 | 11.77 |
| 450.7 | 11.762 |
| 450.7 | 11.762 |
| 450.7 | 11.766 |
| 450.6 | 11.766 |
| 450.6 | 11.769 |
| 450.7 | 11.772 |
| 450.7 | 11.777 |
| 450.6 | 11.786 |
| 450.7 | 11.796 |
| 451.0 | 11.835 |
| 451.3 | 11.864 |
| 451.3 | 11.888 |
| 451.5 | 11.903 |
| 451.6 | 11.939 |
| 451.9 | 11.958 |
| 452.4 | 11.979 |
| 452.6 | 11.987 |
| 452.7 | 11.991 |
| 452.7 | 11.989 |
| 452.9 | 11.989 |
| 453.1 | 11.99 |
| 453.3 | 11.995 |
| 453.8 | 11.995 |
| 453.9 | 11.995 |
| 454.1 | 11.99 |
| 454.2 | 11.985 |
| 454.5 | 11.978 |
| 454.7 | 11.975 |
| 454.7 | 11.973 |
| 454.8 | 11.972 |
| 454.8 | 11.967 |
| 455.1 | 11.968 |
| 455.1 | 11.968 |
| 455.2 | 11.97 |
| 455.2 | 11.978 |
| 455.4 | 12.007 |
| 455.9 | 12.025 |
| 457.3 | 12.044 |
| 458.2 | 12.04 |
| 458.8 | 12.002 |
| 458.9 | 11.975 |
| 458.6 | 11.927 |
| 458.6 | 11.904 |
| 458.6 | 11.887 |
| 458.6 | 11.884 |
| 458.6 | 11.884 |
| 458.8 | 11.882 |
| 458.9 | 11.882 |
| 458.8 | 11.882 |
| 458.8 | 11.882 |
| 458.9 | 11.887 |
| 458.9 | 11.89 |
| 458.9 | 11.895 |
| 459.1 | 11.901 |
| 459.2 | 11.921 |
| 459.2 | 11.935 |
| 459.5 | 11.958 |
| 459.6 | 11.973 |
| 459.7 | 11.987 |
| 459.8 | 12.001 |
| 460.3 | 12.015 |
| 461.1 | 12.031 |
| 461.7 | 12.03 |
| 462.3 | 12.012 |
| 462.6 | 12.001 |
| 462.8 | 11.987 |
| 462.7 | 11.978 |
| 462.7 | 11.972 |
| 462.8 | 11.97 |
| 462.8 | 11.975 |
| 462.9 | 11.975 |
| 463.0 | 11.973 |
| 463.2 | 11.972 |
| 463.2 | 11.972 |
| 463.2 | 11.971 |
| 463.2 | 11.968 |
| 463.3 | 11.971 |
| 463.3 | 11.977 |
| 463.3 | 11.988 |
| 463.4 | 11.998 |
| 463.7 | 12.025 |
| 464.2 | 12.042 |
| 465.1 | 12.05 |
| 465.6 | 12.045 |
| 466.0 | 12.031 |
| 466.4 | 12.016 |
| 466.5 | 12.005 |
| 466.6 | 11.991 |
| 466.6 | 11.984 |
| 466.7 | 11.983 |
| 466.7 | 11.985 |
| 466.6 | 11.985 |
| 466.7 | 11.989 |
| 466.6 | 11.988 |
| 466.7 | 11.989 |
| 466.8 | 11.988 |
| 467.0 | 11.994 |
| 467.0 | 11.994 |
| 467.1 | 12.001 |
| 467.2 | 12.016 |
| 467.7 | 12.042 |
| 468.0 | 12.05 |
| 468.6 | 12.047 |
| 469.1 | 12.042 |
| 469.3 | 12.031 |
| 469.4 | 12.025 |
| 469.4 | 12.021 |
| 469.4 | 12.021 |
| 469.6 | 12.021 |
| 469.6 | 12.018 |
| 469.4 | 12.018 |
| 469.6 | 12.022 |
| 469.6 | 12.022 |
| 469.8 | 12.029 |
| 470.0 | 12.041 |
| 470.5 | 12.051 |
| 470.7 | 12.051 |
| 470.7 | 12.045 |
| 470.9 | 12.04 |
| 471.2 | 12.039 |
| 471.3 | 12.038 |
| 471.5 | 12.038 |
| 471.3 | 12.036 |
| 471.5 | 12.035 |
| 471.6 | 12.048 |
| 471.9 | 12.064 |
| 473.1 | 12.08 |
| 474.1 | 12.079 |
| 475.0 | 12.064 |
| 475.0 | 12.033 |
| 475.0 | 11.976 |
| 474.9 | 11.95 |
| 474.7 | 11.935 |
| 474.5 | 11.93 |
| 474.5 | 11.93 |
| 474.7 | 11.933 |
| 474.8 | 11.935 |
| 474.7 | 11.937 |
| 474.5 | 11.935 |
| 474.7 | 11.943 |
| 474.9 | 11.958 |
| 475.1 | 11.981 |
| 475.3 | 11.995 |
| 475.4 | 12.012 |
| 475.3 | 12.022 |
| 475.5 | 12.031 |
| 476.0 | 12.05 |
| 476.4 | 12.057 |
| 476.9 | 12.058 |
| 477.3 | 12.054 |
| 477.4 | 12.046 |
| 477.4 | 12.041 |
| 477.6 | 12.041 |
| 477.6 | 12.041 |
| 477.4 | 12.041 |
| 477.4 | 12.04 |
| 477.5 | 12.047 |
| 477.8 | 12.065 |
| 478.1 | 12.079 |
| 478.6 | 12.092 |
| 478.7 | 12.092 |
| 478.9 | 12.09 |
| 479.1 | 12.087 |
| 479.3 | 12.084 |
| 479.3 | 12.081 |
| 479.3 | 12.08 |
| 479.4 | 12.079 |
| 479.9 | 12.085 |
| 480.4 | 12.084 |
| 481.0 | 12.08 |
| 481.6 | 12.068 |
| 481.9 | 12.061 |
| 481.9 | 12.047 |
| 481.9 | 12.039 |
| 481.9 | 12.031 |
| 481.8 | 12.031 |
| 481.9 | 12.03 |
| 482.0 | 12.028 |
| 482.1 | 12.028 |
| 482.1 | 12.031 |
| 482.1 | 12.034 |
| 482.3 | 12.035 |
| 482.4 | 12.045 |
| 482.4 | 12.05 |
| 482.5 | 12.059 |
| 482.7 | 12.085 |
| 483.2 | 12.104 |
| 484.2 | 12.111 |
| 485.1 | 12.104 |
| 485.8 | 12.085 |
| 485.8 | 12.065 |
| 485.7 | 12.031 |
| 485.7 | 12.012 |
| 485.7 | 12.002 |
| 485.7 | 12.001 |
| 485.6 | 12.001 |
| 485.7 | 12.004 |
| 485.8 | 12.005 |
| 485.8 | 12.005 |
| 485.8 | 12.005 |
| 485.8 | 12.01 |
| 485.8 | 12.018 |
| 485.8 | 12.035 |
| 486.1 | 12.056 |
| 486.3 | 12.082 |
| 486.5 | 12.094 |
| 487.1 | 12.105 |
| 487.5 | 12.111 |
| 488.0 | 12.113 |
| 488.3 | 12.103 |
| 488.3 | 12.096 |
| 488.6 | 12.09 |
| 488.7 | 12.087 |
| 488.8 | 12.087 |
| 488.8 | 12.084 |
| 488.8 | 12.081 |
| 488.8 | 12.08 |
| 488.9 | 12.079 |
| 489.0 | 12.075 |
| 489.1 | 12.075 |
| 489.0 | 12.075 |
| 489.1 | 12.086 |
| 489.4 | 12.111 |
| 489.7 | 12.13 |
| 490.6 | 12.148 |
| 491.5 | 12.143 |
| 492.6 | 12.124 |
| 492.9 | 12.103 |
| 492.9 | 12.057 |
| 492.7 | 12.021 |
| 492.5 | 11.985 |
| 492.4 | 11.978 |
| 492.5 | 11.976 |
| 492.5 | 11.977 |
| 492.6 | 11.977 |
| 492.6 | 11.977 |
| 492.5 | 11.976 |
| 492.5 | 11.979 |
| 492.5 | 11.989 |
| 492.6 | 12.023 |
| 492.8 | 12.045 |
| 493.2 | 12.075 |
| 493.4 | 12.091 |
| 493.5 | 12.103 |
| 493.4 | 12.111 |
| 493.4 | 12.12 |
| 493.9 | 12.144 |
| 494.7 | 12.161 |
| 496.6 | 12.164 |
| 497.6 | 12.142 |
| 497.6 | 12.068 |
| 497.1 | 12.002 |
| 496.7 | 11.922 |
| 496.7 | 11.908 |
| 496.7 | 11.905 |
| 496.6 | 11.904 |
| 496.6 | 11.904 |
| 496.6 | 11.908 |
| 496.7 | 11.912 |
| 496.6 | 11.92 |
| 496.7 | 11.925 |
| 496.9 | 11.943 |
| 496.9 | 11.96 |
| 497.2 | 11.985 |
| 497.3 | 11.999 |
| 497.5 | 12.025 |
| 497.6 | 12.041 |
| 497.6 | 12.061 |
| 497.7 | 12.087 |
| 497.9 | 12.111 |
| 498.3 | 12.145 |
| 498.9 | 12.164 |
| 499.7 | 12.174 |
| 500.1 | 12.172 |
| 500.2 | 12.155 |
| 500.3 | 12.15 |
| 500.4 | 12.141 |
| 500.4 | 12.137 |
| 500.5 | 12.137 |
| 500.7 | 12.138 |
| 500.5 | 12.134 |
| 500.8 | 12.134 |
| 500.9 | 12.133 |
| 500.9 | 12.134 |
| 500.9 | 12.133 |
| 501.1 | 12.136 |
| 501.1 | 12.144 |
| 501.5 | 12.161 |
| 501.8 | 12.17 |
| 502.4 | 12.183 |
| 502.7 | 12.184 |
| 502.8 | 12.179 |
| 502.8 | 12.174 |
| 502.8 | 12.173 |
| 503.0 | 12.173 |
| 503.3 | 12.171 |
| 503.3 | 12.167 |
| 503.5 | 12.164 |
| 504.0 | 12.156 |
| 504.1 | 12.154 |
| 504.1 | 12.148 |
| 504.2 | 12.142 |
| 504.3 | 12.139 |
| 504.3 | 12.137 |
| 504.3 | 12.133 |
| 504.3 | 12.132 |
| 504.6 | 12.143 |
| 505.1 | 12.171 |
| 505.6 | 12.194 |
| 506.8 | 12.191 |
| 507.5 | 12.179 |
| 508.0 | 12.155 |
| 508.0 | 12.131 |
| 508.0 | 12.09 |
| 507.9 | 12.071 |
| 507.8 | 12.058 |
| 507.9 | 12.054 |
| 508.0 | 12.054 |
| 507.9 | 12.056 |
| 508.0 | 12.056 |
| 508.0 | 12.053 |
| 508.1 | 12.054 |
| 508.3 | 12.059 |
| 508.1 | 12.063 |
| 508.3 | 12.073 |
| 508.4 | 12.088 |
| 508.6 | 12.119 |
| 508.6 | 12.134 |
| 508.7 | 12.154 |
| 509.0 | 12.168 |
| 509.7 | 12.19 |
| 510.2 | 12.195 |
| 510.8 | 12.189 |
| 511.1 | 12.179 |
| 511.3 | 12.174 |
| 511.5 | 12.166 |
| 511.6 | 12.16 |
| 511.7 | 12.153 |
| 511.7 | 12.15 |
| 511.8 | 12.147 |
| 511.8 | 12.147 |
| 511.7 | 12.147 |
| 511.8 | 12.148 |
| 511.9 | 12.15 |
| 511.9 | 12.151 |
| 511.9 | 12.153 |
| 512.2 | 12.16 |
| 512.4 | 12.17 |
| 512.5 | 12.185 |
| 512.8 | 12.194 |
| 513.1 | 12.205 |
| 513.4 | 12.208 |
| 513.7 | 12.205 |
| 514.1 | 12.199 |
| 514.4 | 12.189 |
| 514.7 | 12.185 |
| 515.0 | 12.182 |
| 515.0 | 12.179 |
| 515.0 | 12.174 |
| 515.1 | 12.171 |
| 515.3 | 12.17 |
| 515.4 | 12.17 |
| 515.4 | 12.17 |
| 515.3 | 12.166 |
| 515.4 | 12.168 |
| 515.6 | 12.181 |
| 515.6 | 12.189 |
| 515.9 | 12.208 |
| 516.1 | 12.228 |
| 516.6 | 12.246 |
| 518.0 | 12.254 |
| 519.1 | 12.25 |
| 519.7 | 12.213 |
| 519.5 | 12.166 |
| 519.2 | 12.094 |
| 519.2 | 12.067 |
| 518.8 | 12.051 |
| 518.7 | 12.048 |
| 518.8 | 12.05 |
| 519.1 | 12.051 |
| 519.1 | 12.054 |
| 519.1 | 12.053 |
| 518.9 | 12.057 |
| 519.1 | 12.068 |
| 519.2 | 12.086 |
| 519.4 | 12.114 |
| 519.5 | 12.136 |
| 519.5 | 12.167 |
| 519.8 | 12.183 |
| 520.2 | 12.207 |
| 520.2 | 12.219 |
| 520.6 | 12.227 |
| 520.7 | 12.227 |
| 520.8 | 12.231 |
| 521.0 | 12.235 |
| 521.4 | 12.242 |
| 522.1 | 12.252 |
| 522.6 | 12.244 |
| 523.3 | 12.222 |
| 523.8 | 12.205 |
| 523.9 | 12.178 |
| 523.9 | 12.156 |
| 523.7 | 12.126 |
| 523.7 | 12.115 |
| 523.7 | 12.111 |
| 523.9 | 12.113 |
| 523.9 | 12.113 |
| 523.9 | 12.111 |
| 523.8 | 12.114 |
| 523.8 | 12.115 |
| 523.9 | 12.118 |
| 523.9 | 12.132 |
| 524.2 | 12.149 |
| 524.4 | 12.176 |
| 524.4 | 12.191 |
| 524.4 | 12.212 |
| 524.9 | 12.234 |
| 525.8 | 12.263 |
| 526.8 | 12.262 |
| 528.0 | 12.237 |
| 528.1 | 12.211 |
| 528.0 | 12.171 |
| 527.7 | 12.111 |
| 527.6 | 12.094 |
| 527.5 | 12.085 |
| 527.5 | 12.081 |
| 527.6 | 12.082 |
| 527.6 | 12.084 |
| 527.6 | 12.085 |
| 527.6 | 12.091 |
| 527.7 | 12.108 |
| 527.7 | 12.12 |
| 528.0 | 12.133 |
| 528.0 | 12.154 |
| 528.1 | 12.168 |
| 528.3 | 12.191 |
| 528.4 | 12.208 |
| 528.7 | 12.23 |
| 528.8 | 12.248 |
| 529.3 | 12.273 |
| 529.9 | 12.28 |
| 530.8 | 12.274 |
| 531.3 | 12.265 |
| 531.5 | 12.242 |
| 531.6 | 12.225 |
| 531.6 | 12.21 |
| 531.8 | 12.191 |
| 531.6 | 12.182 |
| 531.6 | 12.179 |
| 531.6 | 12.178 |
| 531.9 | 12.178 |
| 531.8 | 12.178 |
| 531.8 | 12.183 |
| 531.9 | 12.193 |
| 532.2 | 12.208 |
| 532.4 | 12.22 |
| 532.4 | 12.227 |
| 532.4 | 12.231 |
| 532.5 | 12.24 |
| 532.7 | 12.264 |
| 533.1 | 12.276 |
| 534.0 | 12.287 |
| 534.8 | 12.28 |
| 535.8 | 12.259 |
| 535.8 | 12.23 |
| 535.7 | 12.181 |
| 535.7 | 12.157 |
| 535.7 | 12.139 |
| 535.6 | 12.131 |
| 535.4 | 12.128 |
| 535.4 | 12.13 |
| 535.6 | 12.134 |
| 535.7 | 12.137 |
| 535.7 | 12.138 |
| 535.7 | 12.144 |
| 535.7 | 12.156 |
| 535.8 | 12.174 |
| 535.9 | 12.191 |
| 536.0 | 12.22 |
| 536.0 | 12.237 |
| 536.6 | 12.269 |
| 537.1 | 12.291 |
| 537.7 | 12.3 |
| 537.9 | 12.296 |
| 538.3 | 12.286 |
| 538.5 | 12.279 |
| 538.8 | 12.274 |
| 538.8 | 12.269 |
| 538.8 | 12.264 |
| 538.9 | 12.262 |
| 538.8 | 12.262 |
| 538.9 | 12.26 |
| 538.9 | 12.26 |
| 539.1 | 12.262 |
| 539.2 | 12.262 |
| 539.4 | 12.264 |
| 539.4 | 12.265 |
| 539.4 | 12.274 |
| 539.7 | 12.296 |
| 540.2 | 12.317 |
| 540.8 | 12.343 |
| 540.9 | 12.342 |
| 542.0 | 12.321 |
| 542.8 | 12.3 |
| 543.6 | 12.269 |
| 543.5 | 12.228 |
| 543.2 | 12.172 |
| 543.0 | 12.142 |
| 543.0 | 12.137 |
| 542.8 | 12.134 |
| 542.8 | 12.134 |
| 542.8 | 12.139 |
| 542.9 | 12.143 |
| 542.9 | 12.147 |
| 542.9 | 12.16 |
| 543.3 | 12.178 |
| 543.4 | 12.193 |
| 543.4 | 12.214 |
| 543.5 | 12.229 |
| 543.7 | 12.251 |
| 544.0 | 12.265 |
| 544.1 | 12.273 |
| 544.2 | 12.281 |
| 544.2 | 12.286 |
| 544.6 | 12.307 |
| 544.8 | 12.323 |
| 545.6 | 12.343 |
| 546.6 | 12.333 |
| 548.0 | 12.297 |
| 548.5 | 12.259 |
| 548.6 | 12.173 |
| 548.1 | 12.11 |
| 547.8 | 12.064 |
| 547.4 | 12.038 |
| 547.3 | 12.034 |
| 547.3 | 12.034 |
| 547.5 | 12.038 |
| 547.5 | 12.042 |
| 547.5 | 12.046 |
| 547.3 | 12.057 |
| 547.4 | 12.075 |
| 547.8 | 12.113 |
| 547.9 | 12.139 |
| 548.0 | 12.172 |
| 548.3 | 12.19 |
| 548.4 | 12.212 |
| 548.5 | 12.236 |
| 548.7 | 12.246 |
| 549.0 | 12.269 |
| 549.1 | 12.282 |
| 549.3 | 12.297 |
| 549.8 | 12.308 |
| 550.4 | 12.32 |
| 550.6 | 12.319 |
| 550.6 | 12.316 |
| 550.9 | 12.314 |
| 550.9 | 12.309 |
| 550.9 | 12.303 |
| 551.0 | 12.3 |
| 551.0 | 12.304 |
| 551.1 | 12.305 |
| 551.6 | 12.321 |
| 551.9 | 12.331 |
| 552.5 | 12.33 |
| 552.9 | 12.322 |
| 553.5 | 12.3 |
| 553.6 | 12.29 |
| 553.6 | 12.277 |
| 553.5 | 12.269 |
| 553.6 | 12.263 |
| 553.6 | 12.262 |
| 553.8 | 12.262 |
| 553.8 | 12.262 |
| 554.0 | 12.264 |
| 554.0 | 12.267 |
| 554.0 | 12.27 |
| 554.0 | 12.28 |
| 554.1 | 12.287 |
| 554.3 | 12.313 |
| 554.5 | 12.332 |
| 554.8 | 12.348 |
| 555.3 | 12.362 |
| 555.6 | 12.367 |
| 556.4 | 12.354 |
| 557.3 | 12.34 |
| 558.1 | 12.31 |
| 558.1 | 12.285 |
| 557.9 | 12.227 |
| 557.9 | 12.2 |
| 557.8 | 12.179 |
| 557.9 | 12.172 |
| 557.8 | 12.17 |
| 557.8 | 12.17 |
| 557.8 | 12.172 |
| 557.9 | 12.173 |
| 557.9 | 12.176 |
| 557.8 | 12.184 |
| 558.0 | 12.197 |
| 558.2 | 12.234 |
| 558.2 | 12.252 |
| 558.3 | 12.273 |
| 558.6 | 12.293 |
| 558.9 | 12.32 |
| 559.2 | 12.331 |
| 559.9 | 12.338 |
| 560.1 | 12.34 |
| 560.1 | 12.338 |
| 560.0 | 12.333 |
| 560.0 | 12.331 |
| 560.2 | 12.336 |
| 560.5 | 12.339 |
| 561.1 | 12.342 |
| 561.6 | 12.339 |
| 562.0 | 12.327 |
| 562.4 | 12.32 |
| 562.5 | 12.311 |
| 562.4 | 12.304 |
| 562.4 | 12.294 |
| 562.3 | 12.288 |
| 562.4 | 12.288 |
| 562.4 | 12.292 |
| 562.4 | 12.296 |
| 562.5 | 12.302 |
| 562.6 | 12.309 |
| 562.7 | 12.32 |
| 562.9 | 12.328 |
| 563.2 | 12.349 |
| 563.5 | 12.363 |
| 563.9 | 12.371 |
| 564.6 | 12.367 |
| 565.0 | 12.357 |
| 565.5 | 12.34 |
| 565.7 | 12.327 |
| 565.9 | 12.309 |
| 565.8 | 12.297 |
| 565.8 | 12.286 |
| 565.8 | 12.282 |
| 565.9 | 12.284 |
| 565.9 | 12.285 |
| 565.9 | 12.287 |
| 566.1 | 12.288 |
| 566.2 | 12.294 |
| 566.3 | 12.297 |
| 566.3 | 12.303 |
| 566.3 | 12.321 |
| 566.4 | 12.338 |
| 567.0 | 12.36 |
| 567.5 | 12.371 |
| 568.2 | 12.368 |
| 568.7 | 12.361 |
| 569.3 | 12.347 |
| 569.5 | 12.333 |
| 569.6 | 12.304 |
| 569.6 | 12.282 |
| 569.7 | 12.262 |
| 569.6 | 12.257 |
| 569.7 | 12.254 |
| 569.6 | 12.256 |
| 569.6 | 12.258 |
| 569.5 | 12.259 |
| 569.5 | 12.262 |
| 569.6 | 12.276 |
| 569.7 | 12.288 |
| 570.0 | 12.304 |
| 570.2 | 12.314 |
| 570.2 | 12.327 |
| 570.3 | 12.334 |
| 570.3 | 12.347 |
| 570.6 | 12.371 |
| 570.9 | 12.389 |
| 572.0 | 12.408 |
| 573.2 | 12.403 |
| 574.8 | 12.374 |
| 574.7 | 12.325 |
| 574.3 | 12.211 |
| 573.8 | 12.16 |
| 573.7 | 12.124 |
| 573.7 | 12.116 |
| 573.7 | 12.118 |
| 573.7 | 12.12 |
| 573.8 | 12.121 |
| 573.8 | 12.122 |
| 573.8 | 12.122 |
| 573.8 | 12.138 |
| 573.9 | 12.156 |
| 574.0 | 12.187 |
| 574.0 | 12.216 |
| 574.4 | 12.26 |
| 574.6 | 12.277 |
| 574.7 | 12.297 |
| 574.8 | 12.314 |
| 575.0 | 12.328 |
| 575.1 | 12.35 |
| 575.2 | 12.362 |
| 575.6 | 12.382 |
| 575.6 | 12.393 |
| 575.8 | 12.41 |
| 576.0 | 12.422 |
| 577.3 | 12.437 |
| 578.4 | 12.43 |
| 579.6 | 12.389 |
| 579.8 | 12.338 |
| 579.4 | 12.247 |
| 579.0 | 12.188 |
| 578.9 | 12.15 |
| 578.8 | 12.126 |
| 578.8 | 12.125 |
| 578.8 | 12.124 |
| 579.0 | 12.127 |
| 579.0 | 12.131 |
| 579.0 | 12.134 |
| 579.0 | 12.141 |
| 578.9 | 12.153 |
| 579.2 | 12.182 |
| 579.4 | 12.204 |
| 579.5 | 12.236 |
| 579.5 | 12.258 |
| 579.7 | 12.285 |
| 580.1 | 12.322 |
| 580.1 | 12.34 |
| 580.2 | 12.359 |
| 580.3 | 12.37 |
| 580.7 | 12.397 |
| 580.9 | 12.414 |
| 581.3 | 12.43 |
| 581.5 | 12.433 |
| 581.6 | 12.43 |
| 581.7 | 12.428 |
| 581.7 | 12.425 |
| 581.7 | 12.429 |
| 581.8 | 12.437 |
| 582.1 | 12.466 |
| 582.3 | 12.487 |
| 585.3 | 12.493 |
| 587.7 | 12.474 |
| 588.9 | 12.31 |
| 587.8 | 12.125 |
| 586.2 | 11.915 |
| 585.9 | 11.839 |
| 585.5 | 11.795 |
| 585.6 | 11.792 |
| 585.6 | 11.793 |
| 585.6 | 11.794 |
| 585.4 | 11.793 |
| 585.5 | 11.801 |
| 585.5 | 11.813 |
| 585.6 | 11.834 |
| 585.8 | 11.851 |
| 586.0 | 11.881 |
| 586.0 | 11.897 |
| 586.0 | 11.919 |
| 586.2 | 11.936 |
| 586.4 | 11.977 |
| 586.6 | 12 |
| 586.6 | 12.022 |
| 587.1 | 12.053 |
| 587.2 | 12.075 |
| 587.4 | 12.101 |
| 587.4 | 12.113 |
| 587.4 | 12.138 |
| 587.5 | 12.161 |
| 587.9 | 12.2 |
| 588.1 | 12.224 |
| 588.3 | 12.247 |
| 588.3 | 12.258 |
| 588.5 | 12.288 |
| 588.9 | 12.311 |
| 589.1 | 12.33 |
| 589.1 | 12.348 |
| 589.3 | 12.359 |
| 589.4 | 12.376 |
| 589.6 | 12.389 |
| 589.8 | 12.408 |
| 590.0 | 12.426 |
| 590.4 | 12.446 |
| 590.6 | 12.451 |
| 590.9 | 12.452 |
| 591.0 | 12.448 |
| 591.1 | 12.446 |
| 591.1 | 12.442 |
| 591.2 | 12.441 |
| 591.3 | 12.448 |
| 591.8 | 12.462 |
| 592.7 | 12.471 |
| 593.7 | 12.456 |
| 595.0 | 12.416 |
| 595.0 | 12.374 |
| 594.7 | 12.282 |
| 594.3 | 12.234 |
| 594.1 | 12.202 |
| 594.2 | 12.19 |
| 594.2 | 12.187 |
| 594.1 | 12.188 |
| 594.0 | 12.188 |
| 594.1 | 12.197 |
| 594.3 | 12.216 |
| 594.4 | 12.246 |
| 594.5 | 12.259 |
| 594.8 | 12.275 |
| 594.9 | 12.291 |
| 594.9 | 12.315 |
| 595.0 | 12.331 |
| 595.3 | 12.361 |
| 595.5 | 12.385 |
| 595.6 | 12.41 |
| 595.7 | 12.419 |
| 595.9 | 12.433 |
| 596.0 | 12.448 |
| 596.2 | 12.466 |
| 597.4 | 12.483 |
| 598.9 | 12.473 |
| 601.1 | 12.417 |
| 601.1 | 12.333 |
| 600.1 | 12.16 |
| 599.5 | 12.081 |
| 599.3 | 12.038 |
| 599.3 | 12.028 |
| 599.3 | 12.024 |
| 599.3 | 12.025 |
| 599.3 | 12.028 |
| 599.2 | 12.03 |
| 599.2 | 12.03 |
| 599.3 | 12.047 |
| 599.5 | 12.064 |
| 599.8 | 12.084 |
| 599.8 | 12.096 |
| 599.9 | 12.113 |
| 600.0 | 12.13 |
| 600.1 | 12.157 |
| 600.0 | 12.178 |
| 600.1 | 12.205 |
| 600.6 | 12.259 |
| 600.8 | 12.292 |
| 601.0 | 12.315 |
| 601.1 | 12.332 |
| 601.2 | 12.354 |
| 601.4 | 12.371 |
| 601.9 | 12.393 |
| 601.9 | 12.403 |
| 601.8 | 12.407 |
| 602.0 | 12.422 |
| 602.3 | 12.443 |
| 602.6 | 12.47 |
| 603.3 | 12.485 |
| 605.0 | 12.48 |
| 606.1 | 12.453 |
| 606.5 | 12.367 |
| 606.1 | 12.285 |
| 605.6 | 12.181 |
| 605.4 | 12.147 |
| 605.2 | 12.13 |
| 605.1 | 12.128 |
| 605.1 | 12.132 |
| 605.1 | 12.136 |
| 605.1 | 12.149 |
| 605.4 | 12.167 |
| 605.6 | 12.187 |
| 605.7 | 12.212 |
| 605.7 | 12.225 |
| 605.7 | 12.244 |
| 605.8 | 12.26 |
| 606.1 | 12.296 |
| 606.2 | 12.314 |
| 606.4 | 12.342 |
| 606.5 | 12.36 |
| 606.7 | 12.39 |
| 606.9 | 12.406 |
| 607.1 | 12.422 |
| 607.4 | 12.441 |
| 607.4 | 12.448 |
| 607.5 | 12.462 |
| 607.7 | 12.477 |
| 608.2 | 12.504 |
| 608.7 | 12.515 |
| 609.7 | 12.505 |
| 610.9 | 12.486 |
| 612.0 | 12.431 |
| 611.9 | 12.367 |
| 611.4 | 12.288 |
| 610.9 | 12.206 |
| 610.8 | 12.187 |
| 610.6 | 12.178 |
| 610.7 | 12.178 |
| 610.8 | 12.179 |
| 610.7 | 12.182 |
| 610.9 | 12.188 |
| 610.9 | 12.197 |
| 611.0 | 12.22 |
| 611.2 | 12.234 |
| 611.2 | 12.258 |
| 611.3 | 12.276 |
| 611.6 | 12.311 |
| 611.8 | 12.328 |
| 611.9 | 12.344 |
| 612.0 | 12.362 |
| 612.0 | 12.38 |
| 612.1 | 12.413 |
| 612.4 | 12.436 |
| 612.9 | 12.468 |
| 613.1 | 12.483 |
| 613.4 | 12.493 |
| 613.5 | 12.491 |
| 613.8 | 12.491 |
| 613.8 | 12.491 |
| 613.8 | 12.496 |
| 613.9 | 12.505 |
| 614.0 | 12.514 |
| 615.4 | 12.522 |
| 617.5 | 12.523 |
| 619.5 | 12.451 |
| 619.1 | 12.339 |
| 617.9 | 12.156 |
| 617.2 | 12.071 |
| 617.0 | 12.03 |
| 617.1 | 12.024 |
| 617.0 | 12.024 |
| 617.0 | 12.027 |
| 617.0 | 12.03 |
| 617.0 | 12.045 |
| 617.2 | 12.052 |
| 617.3 | 12.063 |
| 617.2 | 12.069 |
| 617.5 | 12.094 |
| 617.7 | 12.118 |
| 617.7 | 12.143 |
| 617.7 | 12.159 |
| 617.9 | 12.195 |
| 618.2 | 12.219 |
| 618.4 | 12.25 |
| 618.5 | 12.263 |
| 618.6 | 12.284 |
| 619.0 | 12.322 |
| 619.2 | 12.338 |
| 619.2 | 12.349 |
| 619.2 | 12.355 |
| 619.4 | 12.374 |
| 619.5 | 12.394 |
| 619.6 | 12.428 |
| 619.8 | 12.45 |
| 620.1 | 12.485 |
| 620.2 | 12.5 |
| 620.5 | 12.515 |
| 622.0 | 12.526 |
| 623.2 | 12.519 |
| 624.5 | 12.465 |
| 624.6 | 12.391 |
| 623.9 | 12.276 |
| 623.5 | 12.206 |
| 623.2 | 12.157 |
| 623.0 | 12.15 |
| 623.0 | 12.153 |
| 623.0 | 12.156 |
| 623.0 | 12.167 |
| 623.0 | 12.178 |
| 623.3 | 12.204 |
| 623.4 | 12.223 |
| 623.6 | 12.241 |
| 623.9 | 12.264 |
| 624.0 | 12.274 |
| 624.0 | 12.287 |
| 624.1 | 12.302 |
| 624.2 | 12.331 |
| 624.3 | 12.35 |
| 624.6 | 12.379 |
| 624.8 | 12.396 |
| 624.9 | 12.412 |
| 625.2 | 12.431 |
| 625.2 | 12.445 |
| 625.4 | 12.465 |
| 625.5 | 12.486 |
| 625.8 | 12.513 |
| 626.0 | 12.525 |
| 626.4 | 12.54 |
| 626.6 | 12.55 |
| 627.0 | 12.555 |
| 627.2 | 12.551 |
| 628.4 | 12.528 |
| 629.2 | 12.506 |
| 629.7 | 12.462 |
| 629.6 | 12.422 |
| 629.3 | 12.376 |
| 629.2 | 12.337 |
| 629.1 | 12.327 |
| 629.1 | 12.326 |
| 629.1 | 12.323 |
| 629.0 | 12.33 |
| 629.0 | 12.337 |
| 629.2 | 12.36 |
| 629.3 | 12.378 |
| 629.3 | 12.399 |
| 629.6 | 12.412 |
| 629.7 | 12.447 |
| 629.9 | 12.46 |
| 630.2 | 12.473 |
| 630.3 | 12.485 |
| 630.3 | 12.494 |
| 630.5 | 12.514 |
| 630.8 | 12.531 |
| 631.1 | 12.55 |
| 631.3 | 12.56 |
| 631.9 | 12.561 |
| 632.9 | 12.553 |
| 634.2 | 12.532 |
| 635.0 | 12.475 |
| 634.8 | 12.407 |
| 634.1 | 12.29 |
| 634.1 | 12.257 |
| 634.1 | 12.237 |
| 634.1 | 12.231 |
| 634.0 | 12.228 |
| 634.1 | 12.228 |
| 634.0 | 12.23 |
| 634.1 | 12.235 |
| 634.1 | 12.247 |
| 634.2 | 12.26 |
| 634.5 | 12.288 |
| 634.7 | 12.305 |
| 634.7 | 12.313 |
| 634.7 | 12.33 |
| 634.7 | 12.347 |
| 634.9 | 12.374 |
| 635.0 | 12.399 |
| 635.5 | 12.436 |
| 635.7 | 12.453 |
| 635.7 | 12.466 |
| 635.9 | 12.475 |
| 636.0 | 12.489 |
| 636.0 | 12.505 |
| 636.1 | 12.525 |
| 637.2 | 12.556 |
| 638.5 | 12.557 |
| 640.2 | 12.511 |
| 640.8 | 12.446 |
| 640.2 | 12.315 |
| 639.8 | 12.233 |
| 639.4 | 12.154 |
| 639.4 | 12.138 |
| 639.4 | 12.13 |
| 639.4 | 12.13 |
| 639.3 | 12.127 |
| 639.3 | 12.13 |
| 639.3 | 12.136 |
| 639.4 | 12.156 |
| 639.5 | 12.17 |
| 639.7 | 12.196 |
| 639.5 | 12.208 |
| 639.8 | 12.237 |
| 640.0 | 12.268 |
| 640.2 | 12.31 |
| 640.4 | 12.327 |
| 640.6 | 12.35 |
| 640.7 | 12.371 |
| 641.1 | 12.4 |
| 641.1 | 12.413 |
| 641.1 | 12.423 |
| 641.1 | 12.442 |
| 641.3 | 12.466 |
| 641.7 | 12.51 |
| 642.0 | 12.533 |
| 642.4 | 12.549 |
| 642.6 | 12.546 |
| 642.7 | 12.545 |
| 643.0 | 12.545 |
| 643.1 | 12.54 |
| 643.1 | 12.54 |
| 643.2 | 12.539 |
| 643.3 | 12.548 |
| 643.5 | 12.559 |
| 643.8 | 12.582 |
| 644.2 | 12.597 |
| 645.6 | 12.599 |
| 647.5 | 12.584 |
| 649.3 | 12.5 |
| 648.8 | 12.377 |
| 647.7 | 12.157 |
| 647.1 | 12.079 |
| 646.7 | 12.034 |
| 646.7 | 12.029 |
| 646.8 | 12.031 |
| 646.9 | 12.035 |
| 647.0 | 12.038 |
| 646.8 | 12.038 |
| 646.8 | 12.04 |
| 646.8 | 12.065 |
| 646.9 | 12.093 |
| 647.3 | 12.134 |
| 647.5 | 12.156 |
| 647.6 | 12.177 |
| 647.7 | 12.185 |
| 647.7 | 12.196 |
| 648.0 | 12.213 |
| 648.0 | 12.225 |
| 648.3 | 12.26 |
| 648.6 | 12.285 |
| 648.6 | 12.31 |
| 648.6 | 12.325 |
| 648.7 | 12.355 |
| 648.8 | 12.378 |
| 649.1 | 12.414 |
| 649.4 | 12.439 |
| 649.4 | 12.47 |
| 649.5 | 12.486 |
| 649.9 | 12.517 |
| 650.1 | 12.537 |
| 650.3 | 12.551 |
| 650.6 | 12.566 |
| 650.8 | 12.572 |
| 650.9 | 12.579 |
| 650.9 | 12.584 |
| 651.2 | 12.596 |
| 651.8 | 12.605 |
| 654.0 | 12.596 |
| 655.6 | 12.569 |
| 656.0 | 12.436 |
| 655.3 | 12.317 |
| 654.3 | 12.181 |
| 654.0 | 12.134 |
| 654.0 | 12.12 |
| 654.0 | 12.118 |
| 653.9 | 12.119 |
| 653.9 | 12.124 |
| 654.0 | 12.133 |
| 654.3 | 12.15 |
| 654.4 | 12.16 |
| 654.5 | 12.168 |
| 654.3 | 12.177 |
| 654.5 | 12.211 |
| 654.7 | 12.237 |
| 655.0 | 12.274 |
| 655.1 | 12.29 |
| 655.1 | 12.317 |
| 655.3 | 12.336 |
| 655.4 | 12.354 |
| 655.7 | 12.376 |
| 655.9 | 12.39 |
| 655.9 | 12.414 |
| 656.3 | 12.435 |
| 656.5 | 12.458 |
| 656.5 | 12.474 |
| 656.5 | 12.492 |
| 656.6 | 12.514 |
| 657.2 | 12.548 |
| 657.7 | 12.562 |
| 658.1 | 12.567 |
| 658.2 | 12.559 |
| 658.3 | 12.555 |
| 658.5 | 12.549 |
| 658.6 | 12.546 |
| 658.6 | 12.546 |
| 658.5 | 12.548 |
| 658.6 | 12.554 |
| 658.6 | 12.562 |
| 658.9 | 12.585 |
| 659.0 | 12.609 |
| 659.5 | 12.628 |
| 662.8 | 12.635 |
| 665.1 | 12.605 |
| 665.4 | 12.4 |
| 664.6 | 12.212 |
| 663.0 | 12.006 |
| 662.6 | 11.935 |
| 662.4 | 11.895 |
| 662.4 | 11.893 |
| 662.3 | 11.896 |
| 662.4 | 11.897 |
| 662.3 | 11.898 |
| 662.6 | 11.904 |
| 662.4 | 11.916 |
| 662.6 | 11.936 |
| 662.6 | 11.953 |
| 662.8 | 11.989 |
| 662.9 | 12.016 |
| 663.2 | 12.044 |
| 663.3 | 12.059 |
| 663.6 | 12.082 |
| 663.7 | 12.093 |
| 663.6 | 12.107 |
| 663.6 | 12.12 |
| 664.0 | 12.166 |
| 664.2 | 12.195 |
| 664.5 | 12.22 |
| 664.3 | 12.246 |
| 664.5 | 12.268 |
| 664.8 | 12.311 |
| 665.1 | 12.34 |
| 665.3 | 12.367 |
| 665.3 | 12.382 |
| 665.6 | 12.407 |
| 665.8 | 12.419 |
| 665.5 | 12.43 |
| 665.6 | 12.446 |
| 665.8 | 12.473 |
| 666.2 | 12.526 |
| 666.5 | 12.548 |
| 667.3 | 12.565 |
| 667.9 | 12.569 |
| 668.4 | 12.563 |
| 668.5 | 12.556 |
| 668.5 | 12.537 |
| 668.5 | 12.526 |
| 668.5 | 12.514 |
| 668.5 | 12.509 |
| 668.5 | 12.506 |
| 668.5 | 12.509 |
| 668.6 | 12.515 |
| 668.7 | 12.536 |
| 668.7 | 12.544 |
| 668.9 | 12.562 |
| 669.0 | 12.584 |
| 669.6 | 12.626 |
| 670.5 | 12.635 |
| 673.8 | 12.625 |
| 675.4 | 12.554 |
| 674.9 | 12.359 |
| 674.0 | 12.159 |
| 673.1 | 12.01 |
| 672.8 | 11.961 |
| 672.5 | 11.927 |
| 672.4 | 11.922 |
| 672.5 | 11.924 |
| 672.5 | 11.927 |
| 672.5 | 11.93 |
| 672.7 | 11.936 |
| 672.7 | 11.947 |
| 672.9 | 11.97 |
| 673.0 | 11.988 |
| 673.0 | 12.013 |
| 673.1 | 12.033 |
| 673.4 | 12.054 |
| 673.4 | 12.081 |
| 673.4 | 12.099 |
| 673.7 | 12.138 |
| 673.8 | 12.165 |
| 674.0 | 12.194 |
| 674.3 | 12.214 |
| 674.6 | 12.247 |
| 674.6 | 12.258 |
| 674.7 | 12.268 |
| 674.8 | 12.285 |
| 675.0 | 12.323 |
| 675.1 | 12.347 |
| 675.4 | 12.37 |
| 675.5 | 12.39 |
| 675.7 | 12.412 |
| 675.9 | 12.437 |
| 676.0 | 12.452 |
| 676.1 | 12.473 |
| 676.2 | 12.491 |
| 676.3 | 12.525 |
| 676.6 | 12.548 |
| 677.0 | 12.573 |
| 677.4 | 12.589 |
| 677.5 | 12.6 |
| 677.5 | 12.6 |
| 677.5 | 12.6 |
| 677.8 | 12.618 |
| 678.1 | 12.635 |
| 680.4 | 12.645 |
| 682.4 | 12.618 |
| 683.6 | 12.491 |
| 683.0 | 12.332 |
| 681.9 | 12.105 |
| 681.4 | 12.033 |
| 680.8 | 11.977 |
| 680.8 | 11.966 |
| 680.8 | 11.965 |
| 681.1 | 11.966 |
| 681.0 | 11.968 |
| 680.8 | 11.975 |
| 680.8 | 11.984 |
| 680.8 | 12.016 |
| 681.1 | 12.044 |
| 681.3 | 12.082 |
| 681.4 | 12.104 |
| 682.3 | 12.225 |
| 682.9 | 12.344 |
| 683.2 | 12.403 |
| 683.3 | 12.406 |
| 683.3 | 12.407 |
| 683.5 | 12.429 |
| 683.6 | 12.452 |
| 683.9 | 12.493 |
| 684.2 | 12.516 |
| 684.4 | 12.538 |
| 684.4 | 12.545 |
| 684.5 | 12.556 |
| 684.5 | 12.568 |
| 685.0 | 12.623 |
| 686.1 | 12.653 |
| 688.3 | 12.626 |
| 688.6 | 12.496 |
| 687.7 | 12.296 |
| 686.2 | 12.041 |
| 685.9 | 12.011 |
| 686.5 | 12.073 |
| 686.8 | 12.128 |
| 686.8 | 12.164 |
| 686.8 | 12.173 |
| 687.4 | 12.214 |
| 687.6 | 12.246 |
| 687.6 | 12.262 |
| 687.6 | 12.262 |
| 687.6 | 12.274 |
| 687.8 | 12.309 |
| 688.1 | 12.339 |
| 688.3 | 12.379 |
| 688.6 | 12.397 |
| 688.9 | 12.42 |
| 689.0 | 12.433 |
| 688.9 | 12.441 |
| 689.0 | 12.453 |
| 689.4 | 12.498 |
| 689.6 | 12.533 |
| 689.9 | 12.554 |
| 690.1 | 12.56 |
| 690.2 | 12.562 |
| 690.2 | 12.563 |
| 690.2 | 12.563 |
| 690.2 | 12.602 |
| 691.4 | 12.646 |
| 694.6 | 12.641 |
| 695.6 | 12.505 |
| 694.0 | 12.053 |
| 692.4 | 11.8 |
| 691.4 | 11.701 |
| 691.8 | 11.77 |
| 692.6 | 11.915 |
| 692.8 | 11.959 |
| 692.9 | 11.97 |
| 693.1 | 11.972 |
| 692.9 | 11.977 |
| 693.2 | 12.01 |
| 693.3 | 12.041 |
| 693.5 | 12.084 |
| 693.7 | 12.108 |
| 694.1 | 12.144 |
| 694.3 | 12.17 |
| 694.4 | 12.184 |
| 694.5 | 12.191 |
| 694.6 | 12.22 |
| 694.7 | 12.241 |
| 694.8 | 12.262 |
| 695.1 | 12.287 |
| 695.2 | 12.31 |
| 695.3 | 12.351 |
| 695.4 | 12.379 |
| 695.8 | 12.418 |
| 696.0 | 12.452 |
| 696.4 | 12.487 |
| 696.4 | 12.496 |
| 696.4 | 12.503 |
| 696.6 | 12.517 |
| 696.9 | 12.568 |
| 697.3 | 12.594 |
| 697.5 | 12.605 |
| 697.7 | 12.611 |
| 697.8 | 12.608 |
| 697.9 | 12.611 |
| 697.9 | 12.614 |
| 698.1 | 12.625 |
| 698.2 | 12.645 |
| 699.8 | 12.677 |
| 702.3 | 12.657 |
| 703.9 | 12.401 |
| 702.1 | 12.059 |
| 700.0 | 11.729 |
| 698.8 | 11.561 |
| 699.4 | 11.661 |
| 700.4 | 11.822 |
| 700.9 | 11.876 |
| 700.9 | 11.882 |
| 700.9 | 11.874 |
| 700.9 | 11.869 |
| 701.1 | 11.878 |
| 701.3 | 11.903 |
| 701.4 | 11.922 |
| 701.4 | 11.947 |
| 701.6 | 11.977 |
| 701.7 | 12.015 |
| 702.0 | 12.069 |
| 702.3 | 12.088 |
| 702.4 | 12.116 |
| 702.6 | 12.131 |
| 702.6 | 12.142 |
| 702.8 | 12.162 |
| 703.0 | 12.197 |
| 703.2 | 12.225 |
| 703.4 | 12.26 |
| 703.8 | 12.287 |
| 703.9 | 12.311 |
| 703.9 | 12.321 |
| 704.0 | 12.328 |
| 704.3 | 12.366 |
| 704.6 | 12.389 |
| 704.6 | 12.403 |
| 704.7 | 12.414 |
| 704.9 | 12.443 |
| 705.1 | 12.477 |
| 705.2 | 12.508 |
| 705.3 | 12.537 |
| 705.6 | 12.586 |
| 706.0 | 12.614 |
| 706.5 | 12.625 |
| 707.3 | 12.618 |
| 707.5 | 12.59 |
| 707.5 | 12.511 |
| 707.4 | 12.47 |
| 707.2 | 12.441 |
| 707.1 | 12.441 |
| 707.2 | 12.474 |
| 707.5 | 12.515 |
| 708.0 | 12.555 |
| 708.0 | 12.563 |
| 708.1 | 12.565 |
| 708.4 | 12.571 |
| 708.5 | 12.58 |
| 708.5 | 12.591 |
| 708.6 | 12.602 |
| 709.2 | 12.645 |
| 710.5 | 12.649 |
| 712.7 | 12.582 |
| 712.8 | 12.419 |
| 711.1 | 12.076 |
| 710.3 | 11.95 |
| 710.2 | 11.938 |
| 710.5 | 11.984 |
| 710.6 | 12.048 |
| 710.9 | 12.074 |
| 711.0 | 12.097 |
| 711.1 | 12.132 |
| 711.2 | 12.144 |
| 711.5 | 12.19 |
| 711.6 | 12.225 |
| 711.8 | 12.258 |
| 712.1 | 12.284 |
| 712.4 | 12.32 |
| 712.4 | 12.331 |
| 712.5 | 12.338 |
| 712.7 | 12.351 |
| 712.8 | 12.373 |
| 713.0 | 12.413 |
| 713.1 | 12.431 |
| 713.1 | 12.465 |
| 713.4 | 12.497 |
| 713.8 | 12.553 |
| 714.1 | 12.574 |
| 714.4 | 12.58 |
| 714.4 | 12.578 |
| 714.4 | 12.577 |
| 714.3 | 12.59 |
| 714.8 | 12.632 |
| 716.5 | 12.671 |
| 718.9 | 12.67 |
| 720.5 | 12.376 |
| 719.1 | 12.019 |
| 716.2 | 11.6 |
| 715.6 | 11.501 |
| 716.0 | 11.583 |
| 716.5 | 11.698 |
| 716.9 | 11.786 |
| 717.2 | 11.811 |
| 717.3 | 11.822 |
| 717.4 | 11.835 |
| 717.6 | 11.857 |
| 717.8 | 11.878 |
| 717.9 | 11.888 |
| 717.9 | 11.919 |
| 718.1 | 11.948 |
| 718.5 | 11.988 |
| 718.6 | 12.001 |
| 718.6 | 12.021 |
| 718.8 | 12.045 |
| 719.2 | 12.081 |
| 719.2 | 12.097 |
| 719.3 | 12.11 |
| 719.5 | 12.134 |
| 719.9 | 12.171 |
| 719.9 | 12.188 |
| 719.9 | 12.188 |
| 720.1 | 12.223 |
| 720.1 | 12.256 |
| 720.6 | 12.303 |
| 720.8 | 12.327 |
| 721.0 | 12.351 |
| 720.8 | 12.356 |
| 720.8 | 12.385 |
| 721.1 | 12.426 |
| 721.8 | 12.517 |
| 722.0 | 12.55 |
| 722.1 | 12.562 |
| 722.4 | 12.56 |
| 722.5 | 12.563 |
| 722.5 | 12.567 |
| 722.5 | 12.569 |
| 723.0 | 12.596 |
| 723.3 | 12.63 |
| 723.8 | 12.652 |
| 724.2 | 12.641 |
| 724.3 | 12.618 |
| 724.2 | 12.6 |
| 723.9 | 12.585 |
| 724.2 | 12.596 |
| 724.4 | 12.619 |
| 724.5 | 12.635 |
| 724.6 | 12.646 |
| 724.9 | 12.682 |
| 725.6 | 12.698 |
| 728.9 | 12.679 |
| 730.2 | 12.538 |
| 729.3 | 12.213 |
| 728.1 | 12.034 |
| 727.3 | 11.884 |
| 727.0 | 11.833 |
| 726.8 | 11.799 |
| 726.8 | 11.792 |
| 726.8 | 11.792 |
| 726.8 | 11.794 |
| 726.8 | 11.798 |
| 726.8 | 11.8 |
| 726.7 | 11.804 |
| 726.8 | 11.824 |
| 726.9 | 11.851 |
| 727.3 | 11.893 |
| 727.5 | 11.916 |
| 727.5 | 11.937 |
| 727.5 | 11.945 |
| 727.6 | 11.975 |
| 727.8 | 12.005 |
| 728.0 | 12.039 |
| 728.2 | 12.059 |
| 728.3 | 12.076 |
| 728.3 | 12.109 |
| 728.3 | 12.131 |
| 728.6 | 12.171 |
| 728.9 | 12.202 |
| 729.4 | 12.248 |
| 729.4 | 12.263 |
| 729.4 | 12.277 |
| 729.5 | 12.288 |
| 729.6 | 12.311 |
| 729.6 | 12.336 |
| 730.0 | 12.378 |
| 730.2 | 12.407 |
| 730.5 | 12.433 |
| 730.7 | 12.458 |
| 730.8 | 12.474 |
| 730.9 | 12.488 |
| 730.9 | 12.5 |
| 731.0 | 12.531 |
| 731.2 | 12.559 |
| 731.5 | 12.599 |
| 731.9 | 12.624 |
| 732.6 | 12.657 |
| 732.9 | 12.662 |
| 733.2 | 12.655 |
| 733.3 | 12.643 |
| 733.4 | 12.637 |
| 733.3 | 12.629 |
| 733.4 | 12.63 |
| 733.4 | 12.631 |
| 733.4 | 12.636 |
| 733.7 | 12.652 |
| 733.9 | 12.665 |
| 734.0 | 12.688 |
| 734.3 | 12.7 |
| 736.2 | 12.709 |
| 738.4 | 12.698 |
| 740.2 | 12.58 |
| 739.5 | 12.425 |
| 738.4 | 12.256 |
| 737.7 | 12.097 |
| 737.3 | 12.054 |
| 737.1 | 12.036 |
| 737.0 | 12.034 |
| 737.0 | 12.039 |
| 737.0 | 12.042 |
| 737.1 | 12.054 |
| 737.3 | 12.064 |
| 737.3 | 12.086 |
| 737.7 | 12.098 |
| 737.6 | 12.111 |
| 737.7 | 12.126 |
| 737.8 | 12.139 |
| 737.8 | 12.168 |
| 737.9 | 12.194 |
| 738.3 | 12.234 |
| 738.6 | 12.26 |
| 738.8 | 12.287 |
| 738.9 | 12.298 |
| 739.0 | 12.317 |
| 739.1 | 12.333 |
| 739.2 | 12.362 |
| 739.4 | 12.38 |
| 739.5 | 12.402 |
| 739.8 | 12.429 |
| 740.0 | 12.445 |
| 740.1 | 12.466 |
| 740.1 | 12.481 |
| 740.1 | 12.51 |
| 740.5 | 12.539 |
| 740.9 | 12.583 |
| 741.0 | 12.601 |
| 741.0 | 12.623 |
| 741.3 | 12.64 |
| 741.5 | 12.674 |
| 741.9 | 12.688 |
| 742.7 | 12.698 |
| 745.1 | 12.68 |
| 745.9 | 12.634 |
| 746.0 | 12.487 |
| 745.4 | 12.376 |
| 744.7 | 12.271 |
| 744.2 | 12.235 |
| 744.2 | 12.22 |
| 744.2 | 12.223 |
| 744.2 | 12.225 |
| 744.5 | 12.229 |
| 744.7 | 12.246 |
| 744.8 | 12.253 |
| 744.8 | 12.258 |
| 744.7 | 12.26 |
| 744.7 | 12.273 |
| 744.9 | 12.307 |
| 745.2 | 12.332 |
| 745.3 | 12.361 |
| 745.4 | 12.377 |
| 745.4 | 12.402 |
| 745.5 | 12.426 |
| 745.8 | 12.465 |
| 746.0 | 12.492 |
| 746.2 | 12.532 |
| 746.4 | 12.554 |
| 746.5 | 12.572 |
| 746.7 | 12.6 |
| 747.1 | 12.624 |
| 747.2 | 12.655 |
| 747.4 | 12.668 |
| 747.7 | 12.682 |
| 747.8 | 12.695 |
| 748.1 | 12.708 |
| 748.5 | 12.711 |
| 749.6 | 12.702 |
| 750.3 | 12.686 |
| 750.8 | 12.639 |
| 750.8 | 12.6 |
| 750.8 | 12.562 |
| 750.6 | 12.526 |
| 750.6 | 12.515 |
| 750.6 | 12.513 |
| 750.8 | 12.51 |
| 750.8 | 12.508 |
| 750.8 | 12.508 |
| 750.6 | 12.513 |
| 750.6 | 12.515 |
| 750.9 | 12.531 |
| 751.0 | 12.548 |
| 751.0 | 12.56 |
| 751.0 | 12.583 |
| 751.2 | 12.607 |
| 751.5 | 12.643 |
| 751.6 | 12.669 |
| 751.9 | 12.704 |
| 752.4 | 12.721 |
| 754.0 | 12.725 |
| 755.4 | 12.708 |
| 756.7 | 12.622 |
| 756.6 | 12.517 |
| 755.5 | 12.365 |
| 755.1 | 12.294 |
| 754.8 | 12.263 |
| 754.7 | 12.253 |
| 754.6 | 12.252 |
| 754.8 | 12.257 |
| 754.9 | 12.263 |
| 754.8 | 12.271 |
| 754.8 | 12.279 |
| 754.9 | 12.304 |
| 755.0 | 12.326 |
| 755.3 | 12.363 |
| 755.5 | 12.384 |
| 755.6 | 12.408 |
| 755.7 | 12.422 |
| 756.0 | 12.434 |
| 756.2 | 12.46 |
| 756.2 | 12.475 |
| 756.3 | 12.486 |
| 756.6 | 12.502 |
| 756.6 | 12.531 |
| 756.7 | 12.553 |
| 756.8 | 12.589 |
| 757.2 | 12.62 |
| 757.4 | 12.658 |
| 757.5 | 12.675 |
| 757.8 | 12.693 |
| 758.0 | 12.708 |
| 758.4 | 12.72 |
| 759.5 | 12.719 |
| 760.8 | 12.704 |
| 762.0 | 12.647 |
| 761.9 | 12.573 |
| 761.3 | 12.433 |
| 761.1 | 12.389 |
| 760.8 | 12.347 |
| 761.0 | 12.34 |
| 761.0 | 12.34 |
| 761.1 | 12.339 |
| 761.0 | 12.339 |
| 761.0 | 12.339 |
| 761.0 | 12.343 |
| 761.0 | 12.354 |
| 761.0 | 12.362 |
| 761.1 | 12.391 |
| 761.3 | 12.419 |
| 761.4 | 12.458 |
| 761.6 | 12.48 |
| 761.8 | 12.509 |
| 761.9 | 12.533 |
| 762.1 | 12.568 |
| 762.4 | 12.588 |
| 762.6 | 12.605 |
| 762.7 | 12.62 |
| 762.7 | 12.631 |
| 762.9 | 12.645 |
| 763.0 | 12.664 |
| 763.3 | 12.692 |
| 763.5 | 12.708 |
| 763.9 | 12.737 |
| 764.4 | 12.752 |
| 764.9 | 12.756 |
| 765.2 | 12.751 |
| 765.7 | 12.733 |
| 766.1 | 12.722 |
| 766.5 | 12.708 |
| 766.8 | 12.685 |
| 766.8 | 12.658 |
| 766.7 | 12.622 |
| 766.5 | 12.613 |
| 766.5 | 12.614 |
| 766.7 | 12.616 |
| 766.5 | 12.614 |
| 766.5 | 12.617 |
| 766.8 | 12.635 |
| 766.9 | 12.651 |
| 767.1 | 12.672 |
| 767.3 | 12.681 |
| 767.1 | 12.693 |
| 767.3 | 12.709 |
| 767.5 | 12.729 |
| 768.3 | 12.761 |
| 769.6 | 12.757 |
| 772.0 | 12.717 |
| 772.5 | 12.643 |
| 771.6 | 12.465 |
| 771.2 | 12.371 |
| 770.9 | 12.3 |
| 770.9 | 12.279 |
| 770.6 | 12.262 |
| 770.5 | 12.263 |
| 770.5 | 12.264 |
| 770.6 | 12.27 |
| 770.6 | 12.276 |
| 770.6 | 12.288 |
| 770.7 | 12.299 |
| 770.9 | 12.328 |
| 771.0 | 12.345 |
| 771.0 | 12.371 |
| 771.2 | 12.388 |
| 771.3 | 12.42 |
| 771.5 | 12.447 |
| 771.9 | 12.488 |
| 772.0 | 12.508 |
| 772.1 | 12.529 |
| 772.4 | 12.546 |
| 772.4 | 12.565 |
| 772.4 | 12.592 |
| 772.5 | 12.612 |
| 772.9 | 12.649 |
| 773.1 | 12.669 |
| 773.1 | 12.682 |
| 773.3 | 12.698 |
| 773.8 | 12.728 |
| 773.9 | 12.748 |
| 774.3 | 12.763 |
| 774.7 | 12.773 |
| 775.4 | 12.769 |
| 776.9 | 12.749 |
| 777.6 | 12.715 |
| 777.6 | 12.624 |
| 777.1 | 12.553 |
| 776.7 | 12.486 |
| 776.6 | 12.469 |
| 776.4 | 12.464 |
| 776.4 | 12.469 |
| 776.6 | 12.471 |
| 776.6 | 12.475 |
| 776.6 | 12.483 |
| 776.7 | 12.503 |
| 776.7 | 12.517 |
| 777.1 | 12.548 |
| 777.3 | 12.568 |
| 777.5 | 12.6 |
| 777.7 | 12.622 |
| 777.7 | 12.651 |
| 777.8 | 12.666 |
| 778.1 | 12.685 |
| 778.2 | 12.703 |
| 778.4 | 12.727 |
| 778.5 | 12.746 |
| 778.9 | 12.771 |
| 779.8 | 12.778 |
| 781.5 | 12.773 |
| 783.4 | 12.716 |
| 783.2 | 12.629 |
| 782.3 | 12.451 |
| 781.9 | 12.379 |
| 781.5 | 12.339 |
| 781.5 | 12.332 |
| 781.5 | 12.331 |
| 781.4 | 12.332 |
| 781.5 | 12.334 |
| 781.5 | 12.339 |
| 781.5 | 12.349 |
| 781.7 | 12.373 |
| 781.9 | 12.388 |
| 781.9 | 12.414 |
| 781.9 | 12.434 |
| 782.2 | 12.473 |
| 782.4 | 12.496 |
| 782.7 | 12.517 |
| 782.6 | 12.525 |
| 782.8 | 12.551 |
| 783.0 | 12.573 |
| 783.3 | 12.596 |
| 783.2 | 12.608 |
| 783.2 | 12.619 |
| 783.5 | 12.668 |
| 783.8 | 12.699 |
| 784.1 | 12.726 |
| 784.2 | 12.731 |
| 784.3 | 12.751 |
| 784.5 | 12.766 |
| 785.3 | 12.789 |
| 786.8 | 12.795 |
| 789.2 | 12.761 |
| 789.9 | 12.669 |
| 789.0 | 12.487 |
| 788.3 | 12.361 |
| 787.9 | 12.284 |
| 787.8 | 12.245 |
| 787.9 | 12.237 |
| 788.0 | 12.237 |
| 787.9 | 12.237 |
| 787.9 | 12.239 |
| 787.8 | 12.239 |
| 787.8 | 12.245 |
| 787.8 | 12.252 |
| 787.9 | 12.267 |
| 788.1 | 12.299 |
| 788.1 | 12.325 |
| 788.1 | 12.34 |
| 788.3 | 12.361 |
| 788.4 | 12.405 |
| 788.6 | 12.43 |
| 789.0 | 12.464 |
| 789.1 | 12.486 |
| 789.3 | 12.515 |
| 789.4 | 12.527 |
| 789.6 | 12.551 |
| 789.7 | 12.571 |
| 789.8 | 12.606 |
| 790.0 | 12.634 |
| 790.2 | 12.658 |
| 790.5 | 12.687 |
| 790.8 | 12.7 |
| 791.1 | 12.715 |
| 791.3 | 12.721 |
| 791.2 | 12.726 |
| 791.3 | 12.729 |
| 791.5 | 12.744 |
| 791.8 | 12.761 |
| 793.1 | 12.777 |
| 794.3 | 12.771 |
| 795.5 | 12.722 |
| 795.6 | 12.651 |
| 795.3 | 12.59 |
| 794.9 | 12.474 |
| 794.7 | 12.439 |
| 794.4 | 12.405 |
| 794.3 | 12.395 |
| 794.3 | 12.394 |
| 794.4 | 12.396 |
| 794.3 | 12.406 |
| 794.4 | 12.417 |
| 794.4 | 12.442 |
| 794.8 | 12.46 |
| 794.9 | 12.493 |
| 795.0 | 12.514 |
| 795.1 | 12.527 |
| 795.3 | 12.55 |
| 795.4 | 12.567 |
| 795.5 | 12.597 |
| 795.6 | 12.623 |
| 795.7 | 12.658 |
| 796.0 | 12.685 |
| 796.3 | 12.719 |
| 796.5 | 12.738 |
| 796.9 | 12.756 |
| 797.3 | 12.768 |
| 797.6 | 12.777 |
| 797.9 | 12.775 |
| 798.0 | 12.774 |
| 797.9 | 12.772 |
| 798.0 | 12.772 |
| 798.4 | 12.774 |
| 798.2 | 12.773 |
| 798.1 | 12.773 |
| 798.4 | 12.785 |
| 798.8 | 12.819 |
| 799.7 | 12.828 |
| 803.3 | 12.806 |
| 805.0 | 12.735 |
| 804.6 | 12.6 |
| 803.2 | 12.311 |
| 802.5 | 12.201 |
| 802.0 | 12.138 |
| 802.0 | 12.12 |
| 801.8 | 12.113 |
| 801.9 | 12.114 |
| 801.9 | 12.114 |
| 801.9 | 12.116 |
| 802.0 | 12.119 |
| 802.0 | 12.122 |
| 802.1 | 12.136 |
| 802.0 | 12.149 |
| 802.1 | 12.187 |
| 802.3 | 12.211 |
| 802.5 | 12.241 |
| 802.9 | 12.27 |
| 803.0 | 12.291 |
| 803.2 | 12.313 |
| 803.2 | 12.326 |
| 803.2 | 12.343 |
| 803.3 | 12.359 |
| 803.6 | 12.395 |
| 803.7 | 12.417 |
| 803.8 | 12.431 |
| 803.8 | 12.458 |
| 803.9 | 12.48 |
| 804.3 | 12.526 |
| 804.5 | 12.554 |
| 804.8 | 12.589 |
| 804.9 | 12.607 |
| 805.1 | 12.637 |
| 805.5 | 12.663 |
| 805.6 | 12.689 |
| 805.6 | 12.702 |
| 806.1 | 12.728 |
| 806.2 | 12.739 |
| 806.3 | 12.749 |
| 806.5 | 12.752 |
| 806.5 | 12.761 |
| 806.5 | 12.777 |
| 806.9 | 12.795 |
| 808.6 | 12.809 |
| 810.3 | 12.797 |
| 812.1 | 12.695 |
| 812.2 | 12.574 |
| 811.2 | 12.376 |
| 810.6 | 12.273 |
| 810.5 | 12.212 |
| 810.1 | 12.157 |
| 810.0 | 12.142 |
| 810.0 | 12.139 |
| 809.9 | 12.138 |
| 810.0 | 12.144 |
| 810.1 | 12.148 |
| 810.1 | 12.162 |
| 810.2 | 12.17 |
| 810.2 | 12.199 |
| 810.3 | 12.224 |
| 810.5 | 12.254 |
| 810.7 | 12.281 |
| 810.8 | 12.304 |
| 810.9 | 12.336 |
| 811.1 | 12.355 |
| 811.3 | 12.383 |
| 811.4 | 12.401 |
| 811.5 | 12.428 |
| 811.6 | 12.446 |
| 811.8 | 12.475 |
| 811.9 | 12.499 |
| 812.4 | 12.543 |
| 812.5 | 12.566 |
| 812.6 | 12.583 |
| 812.7 | 12.599 |
| 813.0 | 12.618 |
| 813.3 | 12.653 |
| 813.4 | 12.669 |
| 813.4 | 12.676 |
| 813.5 | 12.685 |
| 813.8 | 12.703 |
| 814.4 | 12.715 |
| 815.9 | 12.726 |
| 816.7 | 12.711 |
| 817.3 | 12.637 |
| 817.2 | 12.577 |
| 817.0 | 12.527 |
| 816.5 | 12.457 |
| 816.4 | 12.433 |
| 816.4 | 12.429 |
| 816.5 | 12.433 |
| 816.6 | 12.437 |
| 816.6 | 12.44 |
| 816.6 | 12.44 |
| 816.7 | 12.442 |
| 816.7 | 12.458 |
| 816.9 | 12.473 |
| 817.0 | 12.5 |
| 817.0 | 12.521 |
| 817.1 | 12.544 |
| 817.6 | 12.583 |
| 817.7 | 12.614 |
| 817.8 | 12.631 |
| 817.9 | 12.649 |
| 818.3 | 12.679 |
| 818.4 | 12.694 |
| 818.6 | 12.712 |
| 818.8 | 12.716 |
| 819.1 | 12.725 |
| 819.2 | 12.735 |
| 819.7 | 12.754 |
| 820.3 | 12.752 |
| 821.6 | 12.737 |
| 823.5 | 12.682 |
| 823.6 | 12.612 |
| 822.9 | 12.454 |
| 822.6 | 12.377 |
| 822.3 | 12.327 |
| 822.2 | 12.309 |
| 822.2 | 12.294 |
| 822.2 | 12.294 |
| 822.1 | 12.297 |
| 822.1 | 12.302 |
| 822.2 | 12.317 |
| 822.3 | 12.333 |
| 822.4 | 12.348 |
| 822.3 | 12.37 |
| 822.4 | 12.385 |
| 822.7 | 12.429 |
| 822.8 | 12.457 |
| 822.9 | 12.489 |
| 823.2 | 12.519 |
| 823.5 | 12.561 |
| 823.6 | 12.574 |
| 823.6 | 12.589 |
| 823.9 | 12.606 |
| 824.2 | 12.626 |
| 824.2 | 12.652 |
| 824.2 | 12.66 |
| 824.5 | 12.681 |
| 824.7 | 12.704 |
| 824.9 | 12.742 |
| 825.3 | 12.76 |
| 826.1 | 12.771 |
| 827.0 | 12.757 |
| 828.3 | 12.714 |
| 828.9 | 12.669 |
| 828.9 | 12.576 |
| 828.7 | 12.497 |
| 828.4 | 12.434 |
| 828.3 | 12.382 |
| 828.0 | 12.367 |
| 827.9 | 12.361 |
| 828.0 | 12.359 |
| 828.0 | 12.367 |
| 828.0 | 12.372 |
| 828.1 | 12.385 |
| 828.3 | 12.4 |
| 828.4 | 12.428 |
| 828.5 | 12.441 |
| 828.5 | 12.458 |
| 828.6 | 12.474 |
| 828.7 | 12.496 |
| 829.0 | 12.531 |
| 829.0 | 12.548 |
| 829.2 | 12.578 |
| 829.4 | 12.6 |
| 829.8 | 12.642 |
| 830.0 | 12.666 |
| 830.0 | 12.682 |
| 830.3 | 12.693 |
| 830.5 | 12.72 |
| 830.9 | 12.735 |
| 831.1 | 12.751 |
| 831.2 | 12.757 |
| 831.3 | 12.758 |
| 831.3 | 12.763 |
| 831.5 | 12.768 |
| 831.6 | 12.78 |
| 831.7 | 12.798 |
| 833.8 | 12.807 |
| 836.3 | 12.796 |
| 838.4 | 12.668 |
| 837.4 | 12.491 |
| 835.9 | 12.219 |
| 835.3 | 12.133 |
| 834.9 | 12.087 |
| 834.9 | 12.078 |
| 834.9 | 12.079 |
| 834.9 | 12.08 |
| 834.8 | 12.084 |
| 835.0 | 12.09 |
| 835.0 | 12.098 |
| 835.0 | 12.113 |
| 835.0 | 12.132 |
| 835.1 | 12.167 |
| 835.4 | 12.195 |
| 835.7 | 12.231 |
| 835.9 | 12.248 |
| 836.0 | 12.265 |
| 836.0 | 12.275 |
| 836.2 | 12.291 |
| 836.5 | 12.316 |
| 836.6 | 12.333 |
| 836.6 | 12.351 |
| 836.7 | 12.37 |
| 836.8 | 12.4 |
| 836.9 | 12.425 |
| 837.2 | 12.462 |
| 837.3 | 12.491 |
| 837.8 | 12.533 |
| 838.0 | 12.554 |
| 838.1 | 12.574 |
| 838.1 | 12.584 |
| 838.1 | 12.599 |
| 838.4 | 12.637 |
| 838.4 | 12.665 |
| 838.6 | 12.703 |
| 838.9 | 12.727 |
| 839.4 | 12.758 |
| 839.7 | 12.769 |
| 840.0 | 12.775 |
| 840.1 | 12.775 |
| 840.1 | 12.774 |
| 840.1 | 12.774 |
| 840.1 | 12.791 |
| 840.7 | 12.809 |
| 843.2 | 12.819 |
| 846.4 | 12.758 |
| 847.0 | 12.612 |
| 845.1 | 12.326 |
| 844.2 | 12.165 |
| 843.6 | 12.053 |
| 843.5 | 12.033 |
| 843.3 | 12.027 |
| 843.3 | 12.03 |
| 843.3 | 12.036 |
| 843.3 | 12.047 |
| 843.3 | 12.054 |
| 843.5 | 12.074 |
| 843.6 | 12.092 |
| 843.7 | 12.121 |
| 843.8 | 12.142 |
| 844.2 | 12.167 |
| 844.4 | 12.184 |
| 844.5 | 12.195 |
| 844.5 | 12.199 |
| 844.5 | 12.205 |
| 844.8 | 12.22 |
| 844.6 | 12.26 |
| 844.9 | 12.287 |
| 844.9 | 12.316 |
| 845.2 | 12.356 |
| 845.5 | 12.384 |
| 845.7 | 12.418 |
| 845.7 | 12.44 |
| 845.9 | 12.47 |
| 845.9 | 12.489 |
| 846.3 | 12.529 |
| 846.5 | 12.557 |
| 846.9 | 12.588 |
| 846.9 | 12.596 |
| 847.0 | 12.609 |
| 847.3 | 12.624 |
| 847.3 | 12.646 |
| 847.7 | 12.676 |
| 848.0 | 12.694 |
| 848.1 | 12.712 |
| 848.3 | 12.723 |
| 848.3 | 12.739 |
| 848.4 | 12.754 |
| 849.4 | 12.774 |
| 850.2 | 12.779 |
| 851.1 | 12.752 |
| 851.1 | 12.719 |
| 850.9 | 12.653 |
| 850.8 | 12.623 |
| 850.8 | 12.607 |
| 850.7 | 12.6 |
| 850.8 | 12.599 |
| 850.7 | 12.605 |
| 850.7 | 12.614 |
| 850.9 | 12.634 |
| 850.9 | 12.655 |
| 851.1 | 12.687 |
| 851.3 | 12.7 |
| 851.5 | 12.721 |
| 851.5 | 12.732 |
| 851.6 | 12.752 |
| 851.8 | 12.772 |
| 852.0 | 12.794 |
| 852.6 | 12.825 |
| 853.3 | 12.836 |
| 855.7 | 12.806 |
| 857.2 | 12.745 |
| 857.3 | 12.583 |
| 856.5 | 12.436 |
| 855.6 | 12.269 |
| 855.3 | 12.223 |
| 855.1 | 12.195 |
| 855.2 | 12.188 |
| 855.2 | 12.189 |
| 855.2 | 12.194 |
| 855.1 | 12.197 |
| 855.2 | 12.213 |
| 855.3 | 12.233 |
| 855.4 | 12.268 |
| 855.6 | 12.286 |
| 855.8 | 12.316 |
| 856.2 | 12.338 |
| 856.3 | 12.363 |
| 856.4 | 12.371 |
| 856.3 | 12.379 |
| 856.4 | 12.39 |
| 856.4 | 12.406 |
| 856.7 | 12.446 |
| 857.0 | 12.47 |
| 857.0 | 12.499 |
| 857.0 | 12.522 |
| 857.2 | 12.576 |
| 857.6 | 12.611 |
| 857.8 | 12.652 |
| 857.8 | 12.674 |
| 858.1 | 12.703 |
| 858.2 | 12.727 |
| 858.6 | 12.758 |
| 858.8 | 12.775 |
| 859.0 | 12.786 |
| 859.1 | 12.801 |
| 859.2 | 12.814 |
| 859.5 | 12.832 |
| 859.7 | 12.843 |
| 860.4 | 12.857 |
| 861.3 | 12.843 |
| 863.5 | 12.798 |
| 864.2 | 12.731 |
| 863.6 | 12.566 |
| 863.0 | 12.459 |
| 862.2 | 12.373 |
| 862.2 | 12.349 |
| 862.3 | 12.347 |
| 862.3 | 12.349 |
| 862.4 | 12.349 |
| 862.4 | 12.349 |
| 862.4 | 12.351 |
| 862.6 | 12.372 |
| 862.7 | 12.388 |
| 862.8 | 12.411 |
| 862.9 | 12.426 |
| 863.2 | 12.454 |
| 863.3 | 12.475 |
| 863.4 | 12.498 |
| 863.4 | 12.516 |
| 863.5 | 12.536 |
| 863.8 | 12.576 |
| 863.9 | 12.596 |
| 864.2 | 12.625 |
| 864.5 | 12.645 |
| 864.5 | 12.669 |
| 864.6 | 12.685 |
| 864.8 | 12.712 |
| 864.9 | 12.731 |
| 865.1 | 12.756 |
| 865.2 | 12.775 |
| 865.3 | 12.796 |
| 866.0 | 12.83 |
| 866.7 | 12.847 |
| 867.7 | 12.847 |
| 868.1 | 12.829 |
| 868.3 | 12.782 |
| 868.0 | 12.743 |
| 867.8 | 12.703 |
| 867.7 | 12.697 |
| 867.7 | 12.703 |
| 867.9 | 12.711 |
| 868.1 | 12.728 |
| 868.3 | 12.734 |
| 868.3 | 12.739 |
| 868.3 | 12.748 |
| 868.4 | 12.758 |
| 868.5 | 12.785 |
| 868.6 | 12.801 |
| 868.7 | 12.821 |
| 868.7 | 12.84 |
| 869.3 | 12.874 |
| 871.1 | 12.882 |
| 874.9 | 12.846 |
| 876.0 | 12.733 |
| 874.6 | 12.414 |
| 873.6 | 12.244 |
| 872.8 | 12.142 |
| 872.4 | 12.085 |
| 872.3 | 12.071 |
| 872.4 | 12.069 |
| 872.4 | 12.068 |
| 872.4 | 12.07 |
| 872.4 | 12.071 |
| 872.4 | 12.081 |
| 872.4 | 12.097 |
| 872.7 | 12.122 |
| 872.8 | 12.136 |
| 872.9 | 12.151 |
| 872.8 | 12.173 |
| 872.9 | 12.195 |
| 873.2 | 12.23 |
| 873.4 | 12.258 |
| 873.6 | 12.291 |
| 873.7 | 12.309 |
| 873.8 | 12.331 |
| 874.0 | 12.348 |
| 874.1 | 12.377 |
| 874.2 | 12.396 |
| 874.4 | 12.424 |
| 874.7 | 12.445 |
| 874.8 | 12.473 |
| 874.9 | 12.491 |
| 875.0 | 12.511 |
| 875.3 | 12.544 |
| 875.4 | 12.566 |
| 875.6 | 12.601 |
| 875.6 | 12.622 |
| 875.9 | 12.658 |
| 876.1 | 12.68 |
| 876.3 | 12.72 |
| 876.6 | 12.737 |
| 876.8 | 12.762 |
| 877.0 | 12.772 |
| 877.2 | 12.784 |
| 877.3 | 12.795 |
| 877.4 | 12.806 |
| 877.8 | 12.825 |
| 877.9 | 12.84 |
| 878.4 | 12.853 |
| 878.5 | 12.859 |
| 878.7 | 12.864 |
| 878.9 | 12.863 |
| 879.2 | 12.864 |
| 878.9 | 12.861 |
| 879.1 | 12.863 |
| 879.1 | 12.87 |
| 879.2 | 12.894 |
| 879.5 | 12.914 |
| 881.1 | 12.921 |
| 885.4 | 12.893 |
| 887.0 | 12.78 |
| 885.7 | 12.431 |
| 884.5 | 12.216 |
| 883.2 | 12.044 |
| 882.7 | 11.989 |
| 882.5 | 11.958 |
| 882.5 | 11.962 |
| 882.5 | 11.97 |
| 882.4 | 11.979 |
| 882.6 | 11.996 |
| 882.7 | 12.029 |
| 883.0 | 12.051 |
| 883.1 | 12.069 |
| 883.1 | 12.081 |
| 883.2 | 12.104 |
| 883.3 | 12.125 |
| 883.8 | 12.157 |
| 884.0 | 12.171 |
| 883.9 | 12.188 |
| 883.9 | 12.195 |
| 883.9 | 12.217 |
| 884.2 | 12.245 |
| 884.3 | 12.288 |
| 884.5 | 12.316 |
| 884.8 | 12.343 |
| 884.9 | 12.373 |
| 885.1 | 12.391 |
| 885.4 | 12.425 |
| 885.6 | 12.439 |
| 885.6 | 12.453 |
| 885.6 | 12.464 |
| 885.8 | 12.498 |
| 885.9 | 12.526 |
| 886.2 | 12.561 |
| 886.4 | 12.584 |
| 886.5 | 12.609 |
| 886.5 | 12.625 |
| 886.7 | 12.646 |
| 886.9 | 12.683 |
| 887.1 | 12.711 |
| 887.4 | 12.754 |
| 887.6 | 12.773 |
| 888.1 | 12.798 |
| 888.2 | 12.813 |
| 888.3 | 12.831 |
| 888.7 | 12.84 |
| 889.6 | 12.842 |
| 890.1 | 12.836 |
| 890.2 | 12.819 |
| 890.1 | 12.783 |
| 890.0 | 12.763 |
| 890.0 | 12.758 |
| 890.1 | 12.762 |
| 890.2 | 12.771 |
| 890.3 | 12.779 |
| 890.3 | 12.79 |
| 890.3 | 12.801 |
| 890.5 | 12.823 |
| 890.7 | 12.842 |
| 891.1 | 12.869 |
| 891.2 | 12.882 |
| 891.4 | 12.898 |
| 891.8 | 12.903 |
| 892.4 | 12.9 |
| 895.1 | 12.875 |
| 896.5 | 12.82 |
| 896.2 | 12.626 |
| 895.2 | 12.485 |
| 894.3 | 12.36 |
| 894.0 | 12.332 |
| 893.9 | 12.317 |
| 893.9 | 12.322 |
| 894.1 | 12.333 |
| 894.1 | 12.343 |
| 894.1 | 12.353 |
| 894.3 | 12.372 |
| 894.5 | 12.389 |
| 894.6 | 12.408 |
| 894.6 | 12.419 |
| 894.6 | 12.441 |
| 894.7 | 12.465 |
| 895.2 | 12.506 |
| 895.6 | 12.536 |
| 895.7 | 12.562 |
| 895.7 | 12.571 |
| 895.9 | 12.585 |
| 896.0 | 12.602 |
| 896.0 | 12.617 |
| 896.2 | 12.645 |
| 896.5 | 12.666 |
| 896.8 | 12.693 |
| 896.8 | 12.704 |
| 896.8 | 12.725 |
| 896.9 | 12.748 |
| 897.2 | 12.783 |
| 897.3 | 12.806 |
| 897.7 | 12.838 |
| 897.9 | 12.859 |
| 898.1 | 12.878 |
| 898.4 | 12.889 |
| 899.1 | 12.901 |
| 901.3 | 12.888 |
| 902.7 | 12.84 |
| 903.2 | 12.689 |
| 902.3 | 12.545 |
| 901.4 | 12.373 |
| 901.0 | 12.325 |
| 900.9 | 12.299 |
| 900.9 | 12.296 |
| 900.8 | 12.297 |
| 900.9 | 12.303 |
| 901.0 | 12.321 |
| 901.1 | 12.339 |
| 901.1 | 12.366 |
| 901.4 | 12.385 |
| 901.5 | 12.4 |
| 901.7 | 12.418 |
| 901.6 | 12.425 |
| 901.7 | 12.45 |
| 901.7 | 12.469 |
| 902.0 | 12.511 |
| 902.1 | 12.538 |
| 902.3 | 12.584 |
| 902.4 | 12.616 |
| 902.8 | 12.655 |
| 902.9 | 12.682 |
| 903.2 | 12.704 |
| 903.3 | 12.732 |
| 903.4 | 12.75 |
| 903.6 | 12.775 |
| 903.8 | 12.794 |
| 903.9 | 12.825 |
| 904.0 | 12.84 |
| 904.3 | 12.869 |
| 904.7 | 12.887 |
| 905.2 | 12.901 |
| 905.4 | 12.905 |
| 905.8 | 12.908 |
| 905.9 | 12.908 |
| 905.9 | 12.903 |
| 906.1 | 12.904 |
| 906.2 | 12.904 |
| 905.9 | 12.905 |
| 905.9 | 12.909 |
| 906.2 | 12.94 |
| 906.6 | 12.962 |
| 908.4 | 12.968 |
| 911.0 | 12.958 |
| 913.6 | 12.808 |
| 913.0 | 12.608 |
| 911.0 | 12.316 |
| 910.3 | 12.188 |
| 909.8 | 12.108 |
| 909.8 | 12.093 |
| 909.7 | 12.091 |
| 909.8 | 12.092 |
| 909.8 | 12.093 |
| 909.8 | 12.099 |
| 909.8 | 12.104 |
| 910.0 | 12.12 |
| 909.9 | 12.132 |
| 910.0 | 12.165 |
| 910.2 | 12.19 |
| 910.4 | 12.227 |
| 910.4 | 12.247 |
| 910.6 | 12.267 |
| 911.0 | 12.298 |
| 911.0 | 12.313 |
| 911.2 | 12.327 |
| 911.3 | 12.342 |
| 911.5 | 12.362 |
| 911.6 | 12.372 |
| 911.6 | 12.393 |
| 911.6 | 12.416 |
| 911.8 | 12.464 |
| 912.1 | 12.498 |
| 912.2 | 12.536 |
| 912.4 | 12.563 |
| 912.7 | 12.59 |
| 912.9 | 12.634 |
| 913.1 | 12.655 |
| 913.4 | 12.683 |
| 913.5 | 12.698 |
| 913.7 | 12.723 |
| 913.8 | 12.742 |
| 914.0 | 12.758 |
| 914.0 | 12.769 |
| 914.2 | 12.791 |
| 914.3 | 12.814 |
| 914.4 | 12.838 |
| 914.8 | 12.863 |
| 915.0 | 12.878 |
| 915.4 | 12.9 |
| 915.9 | 12.905 |
| 916.0 | 12.9 |
| 916.1 | 12.898 |
| 916.5 | 12.895 |
| 916.6 | 12.894 |
| 916.3 | 12.891 |
| 916.5 | 12.894 |
| 916.6 | 12.908 |
| 916.7 | 12.921 |
| 916.7 | 12.935 |
| 916.8 | 12.962 |
| 918.4 | 12.971 |
| 923.6 | 12.956 |
| 926.7 | 12.817 |
| 925.1 | 12.407 |
| 923.2 | 12.091 |
| 921.6 | 11.782 |
| 921.2 | 11.712 |
| 921.1 | 11.672 |
| 920.8 | 11.658 |
| 921.0 | 11.65 |
| 921.0 | 11.65 |
| 921.0 | 11.652 |
| 921.0 | 11.656 |
| 920.8 | 11.662 |
| 921.0 | 11.684 |
| 921.1 | 11.703 |
| 921.3 | 11.729 |
| 921.4 | 11.749 |
| 921.7 | 11.776 |
| 921.6 | 11.79 |
| 921.7 | 11.816 |
| 921.9 | 11.842 |
| 922.2 | 11.874 |
| 922.2 | 11.891 |
| 922.3 | 11.905 |
| 922.4 | 11.935 |
| 922.6 | 11.962 |
| 922.9 | 12 |
| 923.0 | 12.018 |
| 923.2 | 12.042 |
| 923.3 | 12.059 |
| 923.5 | 12.084 |
| 923.6 | 12.103 |
| 923.7 | 12.127 |
| 923.8 | 12.145 |
| 923.9 | 12.172 |
| 924.2 | 12.191 |
| 924.3 | 12.211 |
| 924.5 | 12.236 |
| 924.6 | 12.25 |
| 924.8 | 12.279 |
| 924.9 | 12.304 |
| 925.2 | 12.339 |
| 925.5 | 12.36 |
| 925.5 | 12.383 |
| 925.4 | 12.4 |
| 925.6 | 12.434 |
| 925.9 | 12.466 |
| 926.1 | 12.509 |
| 926.3 | 12.528 |
| 926.4 | 12.546 |
| 926.5 | 12.574 |
| 926.7 | 12.591 |
| 926.9 | 12.634 |
| 927.3 | 12.662 |
| 927.5 | 12.694 |
| 927.6 | 12.714 |
| 927.8 | 12.743 |
| 928.0 | 12.76 |
| 928.2 | 12.778 |
| 928.4 | 12.794 |
| 928.7 | 12.818 |
| 928.9 | 12.829 |
| 929.2 | 12.837 |
| 929.3 | 12.845 |
| 929.4 | 12.848 |
| 929.5 | 12.854 |
| 929.4 | 12.861 |
| 929.6 | 12.881 |
| 929.9 | 12.9 |
| 930.3 | 12.926 |
| 930.5 | 12.94 |
| 930.8 | 12.949 |
| 931.1 | 12.951 |
| 933.2 | 12.938 |
| 935.3 | 12.899 |
| 936.8 | 12.797 |
| 935.9 | 12.545 |
| 935.0 | 12.36 |
| 933.9 | 12.181 |
| 933.5 | 12.141 |
| 933.4 | 12.12 |
| 933.3 | 12.118 |
| 933.4 | 12.126 |
| 933.5 | 12.137 |
| 933.7 | 12.154 |
| 933.8 | 12.164 |
| 933.9 | 12.184 |
| 933.9 | 12.196 |
| 933.8 | 12.212 |
| 934.0 | 12.239 |
| 934.3 | 12.264 |
| 934.5 | 12.302 |
| 934.5 | 12.319 |
| 934.6 | 12.344 |
| 934.7 | 12.372 |
| 935.1 | 12.414 |
| 935.3 | 12.44 |
| 935.4 | 12.462 |
| 935.4 | 12.477 |
| 935.7 | 12.508 |
| 935.9 | 12.532 |
| 936.0 | 12.565 |
| 936.0 | 12.582 |
| 936.3 | 12.601 |
| 936.4 | 12.645 |
| 936.5 | 12.67 |
| 937.0 | 12.704 |
| 937.0 | 12.728 |
| 937.3 | 12.761 |
| 937.5 | 12.778 |
| 937.6 | 12.801 |
| 937.8 | 12.818 |
| 938.1 | 12.845 |
| 938.3 | 12.86 |
| 938.4 | 12.877 |
| 938.5 | 12.885 |
| 938.9 | 12.903 |
| 939.0 | 12.911 |
| 939.4 | 12.918 |
| 939.6 | 12.923 |
| 939.6 | 12.923 |
| 939.7 | 12.922 |
| 939.7 | 12.931 |
| 940.1 | 12.944 |
| 940.4 | 12.95 |
| 943.0 | 12.938 |
| 945.3 | 12.892 |
| 946.6 | 12.708 |
| 945.4 | 12.489 |
| 943.8 | 12.211 |
| 943.2 | 12.132 |
| 942.9 | 12.102 |
| 942.8 | 12.091 |
| 942.9 | 12.091 |
| 942.9 | 12.094 |
| 942.9 | 12.101 |
| 942.9 | 12.119 |
| 943.0 | 12.139 |
| 943.3 | 12.174 |
| 943.4 | 12.193 |
| 943.5 | 12.217 |
| 943.6 | 12.236 |
| 943.6 | 12.257 |
| 943.9 | 12.292 |
| 944.1 | 12.317 |
| 944.5 | 12.353 |
| 944.6 | 12.367 |
| 944.7 | 12.382 |
| 944.8 | 12.389 |
| 944.9 | 12.407 |
| 945.1 | 12.422 |
| 945.3 | 12.451 |
| 945.4 | 12.471 |
| 945.7 | 12.498 |
| 945.7 | 12.519 |
| 945.8 | 12.537 |
| 945.8 | 12.568 |
| 945.9 | 12.591 |
| 946.2 | 12.632 |
| 946.6 | 12.665 |
| 947.0 | 12.699 |
| 947.0 | 12.715 |
| 947.2 | 12.735 |
| 947.3 | 12.751 |
| 947.4 | 12.775 |
| 947.6 | 12.794 |
| 947.7 | 12.824 |
| 948.1 | 12.846 |
| 948.5 | 12.871 |
| 948.6 | 12.885 |
| 948.7 | 12.889 |
| 949.0 | 12.895 |
| 949.0 | 12.9 |
| 949.1 | 12.906 |
| 949.2 | 12.912 |
| 949.5 | 12.924 |
| 950.4 | 12.935 |
| 953.4 | 12.91 |
| 955.1 | 12.834 |
| 954.9 | 12.618 |
| 953.8 | 12.428 |
| 953.0 | 12.288 |
| 952.7 | 12.183 |
| 952.4 | 12.159 |
| 952.3 | 12.145 |
| 952.5 | 12.147 |
| 952.4 | 12.149 |
| 952.2 | 12.151 |
| 952.2 | 12.167 |
| 952.4 | 12.194 |
| 952.8 | 12.236 |
| 952.9 | 12.253 |
| 952.9 | 12.273 |
| 952.9 | 12.284 |
| 952.9 | 12.309 |
| 953.1 | 12.357 |
| 953.4 | 12.387 |
| 953.7 | 12.423 |
| 953.8 | 12.443 |
| 954.0 | 12.47 |
| 954.1 | 12.485 |
| 954.4 | 12.506 |
| 954.4 | 12.522 |
| 954.6 | 12.543 |
| 954.8 | 12.562 |
| 954.9 | 12.588 |
| 955.0 | 12.62 |
| 955.1 | 12.646 |
| 955.4 | 12.691 |
| 955.5 | 12.719 |
| 956.0 | 12.749 |
| 956.1 | 12.769 |
| 956.3 | 12.79 |
| 956.3 | 12.8 |
| 956.6 | 12.813 |
| 956.8 | 12.825 |
| 956.8 | 12.845 |
| 956.8 | 12.858 |
| 956.9 | 12.872 |
| 957.8 | 12.908 |
| 958.6 | 12.922 |
| 960.5 | 12.899 |
| 961.4 | 12.845 |
| 961.6 | 12.714 |
| 961.0 | 12.597 |
| 960.3 | 12.469 |
| 960.0 | 12.433 |
| 959.8 | 12.417 |
| 959.9 | 12.418 |
| 960.0 | 12.426 |
| 960.0 | 12.434 |
| 960.1 | 12.447 |
| 960.3 | 12.458 |
| 960.1 | 12.47 |
| 960.3 | 12.497 |
| 960.5 | 12.521 |
| 960.7 | 12.555 |
| 960.7 | 12.574 |
| 960.8 | 12.606 |
| 961.0 | 12.634 |
| 961.4 | 12.674 |
| 961.4 | 12.697 |
| 961.7 | 12.722 |
| 961.8 | 12.738 |
| 962.0 | 12.762 |
| 962.0 | 12.778 |
| 962.2 | 12.796 |
| 962.5 | 12.829 |
| 962.6 | 12.847 |
| 963.0 | 12.871 |
| 963.1 | 12.883 |
| 963.3 | 12.903 |
| 963.6 | 12.911 |
| 963.7 | 12.918 |
| 963.7 | 12.923 |
| 964.2 | 12.934 |
| 964.5 | 12.943 |
| 964.6 | 12.949 |
| 964.6 | 12.951 |
| 964.6 | 12.955 |
| 964.8 | 12.967 |
| 965.1 | 12.978 |
| 969.6 | 12.979 |
| 972.6 | 12.914 |
| 973.1 | 12.583 |
| 971.3 | 12.287 |
| 969.3 | 11.99 |
| 968.8 | 11.89 |
| 968.6 | 11.834 |
| 968.6 | 11.822 |
| 968.4 | 11.818 |
| 968.6 | 11.818 |
| 968.6 | 11.823 |
| 968.6 | 11.829 |
| 968.6 | 11.835 |
| 968.4 | 11.849 |
| 968.7 | 11.867 |
| 968.8 | 11.897 |
| 968.9 | 11.913 |
| 969.0 | 11.936 |
| 969.2 | 11.955 |
| 969.4 | 11.989 |
| 969.4 | 12.008 |
| 969.4 | 12.034 |
| 969.5 | 12.056 |
| 969.7 | 12.085 |
| 970.0 | 12.128 |
| 970.1 | 12.153 |
| 970.3 | 12.183 |
| 970.3 | 12.204 |
| 970.7 | 12.236 |
| 970.9 | 12.263 |
| 970.9 | 12.287 |
| 971.2 | 12.302 |
| 971.2 | 12.333 |
| 971.4 | 12.357 |
| 971.8 | 12.383 |
| 972.0 | 12.396 |
| 972.0 | 12.408 |
| 972.2 | 12.425 |
| 972.2 | 12.441 |
| 972.4 | 12.465 |
| 972.6 | 12.487 |
| 972.8 | 12.519 |
| 973.0 | 12.54 |
| 973.1 | 12.567 |
| 973.2 | 12.589 |
| 973.3 | 12.625 |
| 973.7 | 12.649 |
| 974.0 | 12.682 |
| 974.1 | 12.695 |
| 974.1 | 12.71 |
| 974.3 | 12.733 |
| 974.4 | 12.752 |
| 974.6 | 12.785 |
| 974.9 | 12.809 |
| 975.4 | 12.842 |
| 975.7 | 12.854 |
| 975.7 | 12.858 |
| 975.8 | 12.859 |
| 975.9 | 12.871 |
| 976.0 | 12.881 |
| 976.3 | 12.895 |
| 976.6 | 12.901 |
| 976.9 | 12.91 |
| 977.3 | 12.91 |
| 977.5 | 12.906 |
| 977.7 | 12.901 |
| 977.8 | 12.897 |
| 977.8 | 12.893 |
| 977.9 | 12.897 |
| 977.9 | 12.903 |
| 977.8 | 12.908 |
| 977.9 | 12.927 |
| 978.2 | 12.949 |
| 981.1 | 12.963 |
| 983.9 | 12.941 |
| 985.9 | 12.837 |
| 984.5 | 12.482 |
| 983.2 | 12.262 |
| 981.7 | 12.079 |
| 981.4 | 12.029 |
| 981.1 | 12.002 |
| 981.3 | 12.005 |
| 981.4 | 12.01 |
| 981.3 | 12.015 |
| 981.3 | 12.028 |
| 981.4 | 12.046 |
| 981.6 | 12.074 |
| 981.7 | 12.085 |
| 981.7 | 12.097 |
| 981.7 | 12.121 |
| 982.0 | 12.155 |
| 982.4 | 12.194 |
| 982.6 | 12.208 |
| 982.7 | 12.227 |
| 982.8 | 12.239 |
| 982.8 | 12.259 |
| 982.9 | 12.282 |
| 983.2 | 12.32 |
| 983.4 | 12.343 |
| 983.6 | 12.367 |
| 983.5 | 12.377 |
| 983.4 | 12.383 |
| 983.6 | 12.423 |
| 984.0 | 12.459 |
| 984.3 | 12.505 |
| 984.5 | 12.527 |
| 984.7 | 12.561 |
| 984.7 | 12.582 |
| 985.2 | 12.611 |
| 985.4 | 12.632 |
| 985.7 | 12.654 |
| 985.7 | 12.657 |
| 985.7 | 12.67 |
| 985.7 | 12.687 |
| 986.0 | 12.708 |
| 986.2 | 12.742 |
| 986.5 | 12.76 |
| 986.6 | 12.777 |
| 986.7 | 12.792 |
| 986.8 | 12.819 |
| 987.1 | 12.84 |
| 987.2 | 12.865 |
| 987.3 | 12.883 |
| 988.1 | 12.909 |
| 989.9 | 12.905 |
| 992.2 | 12.875 |
| 994.0 | 12.715 |
| 993.0 | 12.526 |
| 991.4 | 12.236 |
| 990.6 | 12.149 |
| 990.4 | 12.111 |
| 990.3 | 12.104 |
| 990.3 | 12.107 |
| 990.3 | 12.115 |
| 990.4 | 12.134 |
| 990.4 | 12.149 |
| 990.6 | 12.179 |
| 990.9 | 12.2 |
| 991.0 | 12.216 |
| 991.0 | 12.228 |
| 991.0 | 12.236 |
| 991.2 | 12.263 |
| 991.5 | 12.285 |
| 991.6 | 12.31 |
| 991.8 | 12.33 |
| 991.8 | 12.356 |
| 992.1 | 12.376 |
| 992.3 | 12.407 |
| 992.5 | 12.431 |
| 992.7 | 12.456 |
| 992.7 | 12.469 |
| 992.8 | 12.486 |
| 993.1 | 12.517 |
| 993.2 | 12.539 |
| 993.4 | 12.56 |
| 993.2 | 12.574 |
| 993.6 | 12.602 |
| 993.8 | 12.629 |
| 994.1 | 12.669 |
| 994.2 | 12.681 |
| 994.4 | 12.705 |
| 994.4 | 12.722 |
| 994.6 | 12.751 |
| 994.8 | 12.774 |
| 994.9 | 12.797 |
| 995.0 | 12.83 |
| 995.3 | 12.849 |
| 995.5 | 12.88 |
| 995.6 | 12.899 |
| 996.2 | 12.921 |
| 996.7 | 12.932 |
| 997.2 | 12.937 |
| 997.2 | 12.929 |
| 997.3 | 12.917 |
| 997.4 | 12.915 |
| 997.4 | 12.918 |
| 997.6 | 12.926 |
| 997.6 | 12.928 |
| 997.8 | 12.94 |
| 997.9 | 12.949 |
| 998.0 | 12.962 |
| 998.0 | 12.971 |
| 998.5 | 12.986 |
| 1000.4 | 12.985 |
| 1004.6 | 12.934 |
| 1006.8 | 12.786 |
| 1004.8 | 12.426 |
| 1003.2 | 12.177 |
| 1002.0 | 11.971 |
| 1001.4 | 11.922 |
| 1001.3 | 11.904 |
| 1001.4 | 11.903 |
| 1001.4 | 11.907 |
| 1001.4 | 11.912 |
| 1001.6 | 11.922 |
| 1001.7 | 11.938 |
| 1001.7 | 11.954 |
| 1002.0 | 11.984 |
| 1002.2 | 12.002 |
| 1002.3 | 12.019 |
| 1002.5 | 12.033 |
| 1002.6 | 12.054 |
| 1002.9 | 12.067 |
| 1002.9 | 12.078 |
| 1003.1 | 12.093 |
| 1003.1 | 12.104 |
| 1003.2 | 12.12 |
| 1003.1 | 12.138 |
| 1003.3 | 12.176 |
| 1003.6 | 12.205 |
| 1003.7 | 12.246 |
| 1003.9 | 12.267 |
| 1004.1 | 12.292 |
| 1004.2 | 12.32 |
| 1004.5 | 12.348 |
| 1004.5 | 12.366 |
| 1004.8 | 12.382 |
| 1004.9 | 12.401 |
| 1005.0 | 12.425 |
| 1005.2 | 12.464 |
| 1005.6 | 12.486 |
| 1005.5 | 12.502 |
| 1005.6 | 12.52 |
| 1006.0 | 12.553 |
| 1006.1 | 12.579 |
| 1006.3 | 12.606 |
| 1006.3 | 12.623 |
| 1006.5 | 12.658 |
| 1006.8 | 12.681 |
| 1007.0 | 12.706 |
| 1007.0 | 12.733 |
| 1007.0 | 12.752 |
| 1007.3 | 12.791 |
| 1007.6 | 12.82 |
| 1007.8 | 12.854 |
| 1008.1 | 12.869 |
| 1008.2 | 12.891 |
| 1008.3 | 12.904 |
| 1008.6 | 12.92 |
| 1009.0 | 12.932 |
| 1010.0 | 12.937 |
| 1011.3 | 12.912 |
| 1013.4 | 12.842 |
| 1013.5 | 12.742 |
| 1012.7 | 12.613 |
| 1011.9 | 12.445 |
| 1011.6 | 12.401 |
| 1011.5 | 12.372 |
| 1011.3 | 12.362 |
| 1011.3 | 12.363 |
| 1011.3 | 12.371 |
| 1011.4 | 12.389 |
| 1011.4 | 12.403 |
| 1011.5 | 12.434 |
| 1011.6 | 12.452 |
| 1011.9 | 12.486 |
| 1012.1 | 12.509 |
| 1012.4 | 12.543 |
| 1012.6 | 12.561 |
| 1012.7 | 12.576 |
| 1013.1 | 12.595 |
| 1013.0 | 12.606 |
| 1013.1 | 12.626 |
| 1013.2 | 12.647 |
| 1013.5 | 12.675 |
| 1013.7 | 12.688 |
| 1013.7 | 12.711 |
| 1013.8 | 12.728 |
| 1014.3 | 12.755 |
| 1014.4 | 12.771 |
| 1014.5 | 12.791 |
| 1014.6 | 12.802 |
| 1014.7 | 12.815 |
| 1015.0 | 12.838 |
| 1015.1 | 12.859 |
| 1015.1 | 12.881 |
| 1015.3 | 12.898 |
| 1015.8 | 12.923 |
| 1016.0 | 12.935 |
| 1016.5 | 12.941 |
| 1016.8 | 12.94 |
| 1016.9 | 12.932 |
| 1017.0 | 12.931 |
| 1017.0 | 12.933 |
| 1017.0 | 12.939 |
| 1017.1 | 12.948 |
| 1017.3 | 12.957 |
| 1017.3 | 12.971 |
| 1017.9 | 12.985 |
| 1020.7 | 12.98 |
| 1024.7 | 12.894 |
| 1024.9 | 12.731 |
| 1022.9 | 12.339 |
| 1021.9 | 12.159 |
| 1021.0 | 12.041 |
| 1020.7 | 12.005 |
| 1020.7 | 11.991 |
| 1020.7 | 11.996 |
| 1020.8 | 12.001 |
| 1020.8 | 12.002 |
| 1020.8 | 12.008 |
| 1020.8 | 12.029 |
| 1020.9 | 12.048 |
| 1021.1 | 12.075 |
| 1021.3 | 12.093 |
| 1021.5 | 12.119 |
| 1021.7 | 12.132 |
| 1021.9 | 12.153 |
| 1022.0 | 12.162 |
| 1022.1 | 12.184 |
| 1022.2 | 12.199 |
| 1022.2 | 12.22 |
| 1022.3 | 12.241 |
| 1022.4 | 12.265 |
| 1022.6 | 12.309 |
| 1022.8 | 12.338 |
| 1023.0 | 12.37 |
| 1023.3 | 12.391 |
| 1023.4 | 12.419 |
| 1023.5 | 12.436 |
| 1023.6 | 12.463 |
| 1023.8 | 12.486 |
| 1024.1 | 12.525 |
| 1024.3 | 12.545 |
| 1024.2 | 12.567 |
| 1024.3 | 12.585 |
| 1024.6 | 12.611 |
| 1024.8 | 12.654 |
| 1024.9 | 12.679 |
| 1025.2 | 12.706 |
| 1025.3 | 12.726 |
| 1025.5 | 12.755 |
| 1025.7 | 12.772 |
| 1025.9 | 12.801 |
| 1026.0 | 12.819 |
| 1026.1 | 12.854 |
| 1026.4 | 12.871 |
| 1026.6 | 12.888 |
| 1027.0 | 12.908 |
| 1027.1 | 12.918 |
| 1027.2 | 12.934 |
| 1027.4 | 12.94 |
| 1027.8 | 12.952 |
| 1028.1 | 12.96 |
| 1028.5 | 12.957 |
| 1029.0 | 12.946 |
| 1029.7 | 12.926 |
| 1030.2 | 12.903 |
| 1030.8 | 12.855 |
| 1030.8 | 12.819 |
| 1030.6 | 12.782 |
| 1030.3 | 12.743 |
| 1030.4 | 12.731 |
| 1030.4 | 12.726 |
| 1030.3 | 12.727 |
| 1030.3 | 12.738 |
| 1030.3 | 12.749 |
| 1030.6 | 12.772 |
| 1030.8 | 12.785 |
| 1030.8 | 12.803 |
| 1030.9 | 12.815 |
| 1031.1 | 12.835 |
| 1031.4 | 12.868 |
| 1031.6 | 12.882 |
| 1031.7 | 12.894 |
| 1031.8 | 12.904 |
| 1031.9 | 12.922 |
| 1032.2 | 12.939 |
| 1032.5 | 12.951 |
| 1032.8 | 12.958 |
| 1033.1 | 12.956 |
| 1034.9 | 12.94 |
| 1036.9 | 12.91 |
| 1038.0 | 12.775 |
| 1036.7 | 12.516 |
| 1035.9 | 12.396 |
| 1035.3 | 12.343 |
| 1035.1 | 12.319 |
| 1035.1 | 12.32 |
| 1035.1 | 12.332 |
| 1035.1 | 12.34 |
| 1035.3 | 12.356 |
| 1035.4 | 12.371 |
| 1035.5 | 12.396 |
| 1035.6 | 12.411 |
| 1036.0 | 12.433 |
| 1036.0 | 12.448 |
| 1036.2 | 12.465 |
| 1036.2 | 12.479 |
| 1036.3 | 12.496 |
| 1036.6 | 12.527 |
| 1036.8 | 12.548 |
| 1036.8 | 12.573 |
| 1036.9 | 12.586 |
| 1037.0 | 12.616 |
| 1037.2 | 12.645 |
| 1037.5 | 12.691 |
| 1037.8 | 12.712 |
| 1038.0 | 12.739 |
| 1038.0 | 12.749 |
| 1038.0 | 12.761 |
| 1038.1 | 12.792 |
| 1038.4 | 12.818 |
| 1038.7 | 12.852 |
| 1038.9 | 12.869 |
| 1039.1 | 12.888 |
| 1039.3 | 12.898 |
| 1039.5 | 12.91 |
| 1039.5 | 12.918 |
| 1039.8 | 12.929 |
| 1040.0 | 12.941 |
| 1040.0 | 12.956 |
| 1040.3 | 12.961 |
| 1041.1 | 12.978 |
| 1043.1 | 12.969 |
| 1045.1 | 12.931 |
| 1046.2 | 12.775 |
| 1045.2 | 12.601 |
| 1044.2 | 12.371 |
| 1043.7 | 12.304 |
| 1043.2 | 12.264 |
| 1043.1 | 12.253 |
| 1043.2 | 12.259 |
| 1043.3 | 12.263 |
| 1043.5 | 12.271 |
| 1043.5 | 12.276 |
| 1043.6 | 12.284 |
| 1043.7 | 12.292 |
| 1043.7 | 12.305 |
| 1043.9 | 12.332 |
| 1044.2 | 12.35 |
| 1044.2 | 12.376 |
| 1044.3 | 12.389 |
| 1044.3 | 12.417 |
| 1044.4 | 12.446 |
| 1044.8 | 12.493 |
| 1044.9 | 12.52 |
| 1045.0 | 12.551 |
| 1045.1 | 12.572 |
| 1045.5 | 12.611 |
| 1045.7 | 12.628 |
| 1045.8 | 12.653 |
| 1045.8 | 12.668 |
| 1046.0 | 12.687 |
| 1046.1 | 12.717 |
| 1046.3 | 12.743 |
| 1046.5 | 12.773 |
| 1046.7 | 12.79 |
| 1046.9 | 12.825 |
| 1047.1 | 12.848 |
| 1047.4 | 12.871 |
| 1047.4 | 12.882 |
| 1047.6 | 12.899 |
| 1047.8 | 12.916 |
| 1048.1 | 12.929 |
| 1048.4 | 12.939 |
| 1048.6 | 12.941 |
| 1048.7 | 12.948 |
| 1048.8 | 12.954 |
| 1048.8 | 12.966 |
| 1048.9 | 12.975 |
| 1051.5 | 12.981 |
| 1054.4 | 12.954 |
| 1056.4 | 12.771 |
| 1054.9 | 12.542 |
| 1052.8 | 12.218 |
| 1052.2 | 12.132 |
| 1052.1 | 12.102 |
| 1052.2 | 12.093 |
| 1052.2 | 12.092 |
| 1052.1 | 12.094 |
| 1052.0 | 12.098 |
| 1052.1 | 12.114 |
| 1052.2 | 12.132 |
| 1052.5 | 12.166 |
| 1052.6 | 12.181 |
| 1052.6 | 12.195 |
| 1052.7 | 12.202 |
| 1052.7 | 12.217 |
| 1052.8 | 12.245 |
| 1053.2 | 12.279 |
| 1053.4 | 12.303 |
| 1053.5 | 12.321 |
| 1053.5 | 12.339 |
| 1053.7 | 12.357 |
| 1054.0 | 12.388 |
| 1054.1 | 12.408 |
| 1054.1 | 12.434 |
| 1054.1 | 12.451 |
| 1054.5 | 12.491 |
| 1054.7 | 12.521 |
| 1055.0 | 12.555 |
| 1055.1 | 12.569 |
| 1055.3 | 12.589 |
| 1055.4 | 12.605 |
| 1055.6 | 12.616 |
| 1055.9 | 12.637 |
| 1056.0 | 12.655 |
| 1056.0 | 12.677 |
| 1056.2 | 12.697 |
| 1056.5 | 12.738 |
| 1056.6 | 12.756 |
| 1056.9 | 12.778 |
| 1056.9 | 12.791 |
| 1057.2 | 12.812 |
| 1057.3 | 12.829 |
| 1057.6 | 12.851 |
| 1057.8 | 12.868 |
| 1057.8 | 12.88 |
| 1057.9 | 12.9 |
| 1058.1 | 12.914 |
| 1058.4 | 12.941 |
| 1058.8 | 12.957 |
| 1059.6 | 12.971 |
| 1060.8 | 12.951 |
| 1062.9 | 12.897 |
| 1063.4 | 12.814 |
| 1062.7 | 12.622 |
| 1062.0 | 12.513 |
| 1061.3 | 12.429 |
| 1061.1 | 12.405 |
| 1061.1 | 12.399 |
| 1061.1 | 12.406 |
| 1061.0 | 12.412 |
| 1061.1 | 12.429 |
| 1061.3 | 12.447 |
| 1061.4 | 12.486 |
| 1061.6 | 12.513 |
| 1061.9 | 12.545 |
| 1062.2 | 12.563 |
| 1062.3 | 12.584 |
| 1062.4 | 12.596 |
| 1062.6 | 12.609 |
| 1062.7 | 12.624 |
| 1062.9 | 12.636 |
| 1062.9 | 12.665 |
| 1063.0 | 12.677 |
| 1063.2 | 12.7 |
| 1063.2 | 12.723 |
| 1063.5 | 12.763 |
| 1063.6 | 12.786 |
| 1063.8 | 12.82 |
| 1064.0 | 12.841 |
| 1064.1 | 12.876 |
| 1064.5 | 12.897 |
| 1064.6 | 12.916 |
| 1064.7 | 12.926 |
| 1064.9 | 12.938 |
| 1065.2 | 12.957 |
| 1065.5 | 12.963 |
| 1066.4 | 12.962 |
| 1066.7 | 12.954 |
| 1067.6 | 12.923 |
| 1068.5 | 12.897 |
| 1069.6 | 12.826 |
| 1069.3 | 12.746 |
| 1068.9 | 12.619 |
| 1068.4 | 12.565 |
| 1068.1 | 12.534 |
| 1068.1 | 12.527 |
| 1068.1 | 12.531 |
| 1068.1 | 12.542 |
| 1068.1 | 12.549 |
| 1068.3 | 12.563 |
| 1068.5 | 12.578 |
| 1068.6 | 12.6 |
| 1068.7 | 12.612 |
| 1068.9 | 12.641 |
| 1069.1 | 12.662 |
| 1069.3 | 12.692 |
| 1069.5 | 12.709 |
| 1069.6 | 12.732 |
| 1069.6 | 12.751 |
| 1069.7 | 12.765 |
| 1069.9 | 12.797 |
| 1070.0 | 12.817 |
| 1070.3 | 12.841 |
| 1070.4 | 12.853 |
| 1070.6 | 12.88 |
| 1070.9 | 12.897 |
| 1071.5 | 12.91 |
| 1071.7 | 12.915 |
| 1072.3 | 12.917 |
| 1072.5 | 12.91 |
| 1072.8 | 12.897 |
| 1072.8 | 12.885 |
| 1072.7 | 12.872 |
| 1072.7 | 12.872 |
| 1072.7 | 12.878 |
| 1072.7 | 12.891 |
| 1072.8 | 12.9 |
| 1072.9 | 12.926 |
| 1073.0 | 12.943 |
| 1073.5 | 12.966 |
| 1075.9 | 12.963 |
| 1080.3 | 12.898 |
| 1081.9 | 12.735 |
| 1079.4 | 12.366 |
| 1077.9 | 12.132 |
| 1076.9 | 11.959 |
| 1076.6 | 11.926 |
| 1076.3 | 11.912 |
| 1076.3 | 11.912 |
| 1076.5 | 11.919 |
| 1076.6 | 11.938 |
| 1076.7 | 11.95 |
| 1076.6 | 11.966 |
| 1076.8 | 11.982 |
| 1077.2 | 12.011 |
| 1077.3 | 12.022 |
| 1077.0 | 12.034 |
| 1077.0 | 12.05 |
| 1077.3 | 12.097 |
| 1077.5 | 12.131 |
| 1077.6 | 12.155 |
| 1078.0 | 12.183 |
| 1078.0 | 12.199 |
| 1078.4 | 12.227 |
| 1078.5 | 12.244 |
| 1078.6 | 12.264 |
| 1078.8 | 12.281 |
| 1078.8 | 12.305 |
| 1078.9 | 12.326 |
| 1079.2 | 12.356 |
| 1079.4 | 12.379 |
| 1079.8 | 12.406 |
| 1079.9 | 12.414 |
| 1079.9 | 12.424 |
| 1080.0 | 12.426 |
| 1080.1 | 12.44 |
| 1080.1 | 12.468 |
| 1080.3 | 12.491 |
| 1080.6 | 12.528 |
| 1080.7 | 12.554 |
| 1080.8 | 12.59 |
| 1081.0 | 12.617 |
| 1081.4 | 12.654 |
| 1081.7 | 12.676 |
| 1081.8 | 12.7 |
| 1081.9 | 12.714 |
| 1082.2 | 12.731 |
| 1082.3 | 12.742 |
| 1082.4 | 12.754 |
| 1082.6 | 12.774 |
| 1082.7 | 12.792 |
| 1082.9 | 12.808 |
| 1083.0 | 12.83 |
| 1083.1 | 12.86 |
| 1083.2 | 12.882 |
| 1083.6 | 12.91 |
| 1084.1 | 12.928 |
| 1084.5 | 12.946 |
| 1084.6 | 12.948 |
| 1084.6 | 12.941 |
| 1084.8 | 12.943 |
| 1084.9 | 12.948 |
| 1085.1 | 12.955 |
| 1085.1 | 12.96 |
| 1085.1 | 12.971 |
| 1085.4 | 12.983 |
| 1088.8 | 12.986 |
| 1092.5 | 12.939 |
| 1095.1 | 12.676 |
| 1093.1 | 12.344 |
| 1090.6 | 11.893 |
| 1089.6 | 11.754 |
| 1089.3 | 11.681 |
| 1089.2 | 11.663 |
| 1088.9 | 11.655 |
| 1088.8 | 11.658 |
| 1088.8 | 11.669 |
| 1088.8 | 11.684 |
| 1088.9 | 11.706 |
| 1089.3 | 11.744 |
| 1089.4 | 11.765 |
| 1089.4 | 11.781 |
| 1089.5 | 11.79 |
| 1089.6 | 11.816 |
| 1089.8 | 11.833 |
| 1089.9 | 11.857 |
| 1090.0 | 11.873 |
| 1090.1 | 11.899 |
| 1090.3 | 11.919 |
| 1090.6 | 11.938 |
| 1090.6 | 11.959 |
| 1090.9 | 11.981 |
| 1091.1 | 12.011 |
| 1091.2 | 12.024 |
| 1091.4 | 12.041 |
| 1091.4 | 12.057 |
| 1091.6 | 12.082 |
| 1091.8 | 12.098 |
| 1092.0 | 12.121 |
| 1092.0 | 12.136 |
| 1092.1 | 12.16 |
| 1092.2 | 12.173 |
| 1092.4 | 12.194 |
| 1092.5 | 12.222 |
| 1092.6 | 12.251 |
| 1093.0 | 12.296 |
| 1093.2 | 12.319 |
| 1093.2 | 12.347 |
| 1093.2 | 12.367 |
| 1093.4 | 12.416 |
| 1093.7 | 12.451 |
| 1094.1 | 12.489 |
| 1094.4 | 12.51 |
| 1094.5 | 12.539 |
| 1094.6 | 12.555 |
| 1094.7 | 12.571 |
| 1094.9 | 12.594 |
| 1094.9 | 12.612 |
| 1095.2 | 12.643 |
| 1095.3 | 12.669 |
| 1095.8 | 12.699 |
| 1095.8 | 12.714 |
| 1096.0 | 12.737 |
| 1096.2 | 12.746 |
| 1096.3 | 12.762 |
| 1096.4 | 12.775 |
| 1096.5 | 12.79 |
| 1096.6 | 12.818 |
| 1096.9 | 12.838 |
| 1097.3 | 12.865 |
| 1097.8 | 12.876 |
| 1098.2 | 12.882 |
| 1098.3 | 12.876 |
| 1098.4 | 12.871 |
| 1098.3 | 12.869 |
| 1098.4 | 12.878 |
| 1098.5 | 12.891 |
| 1098.7 | 12.91 |
| 1098.8 | 12.924 |
| 1099.2 | 12.943 |
| 1100.1 | 12.935 |
| 1104.5 | 12.906 |
| 1106.6 | 12.797 |
| 1106.0 | 12.611 |
| 1103.9 | 12.224 |
| 1102.7 | 12.069 |
| 1101.9 | 11.988 |
| 1101.7 | 11.976 |
| 1102.0 | 11.987 |
| 1102.0 | 11.993 |
| 1102.1 | 12.005 |
| 1102.2 | 12.013 |
| 1102.3 | 12.033 |
| 1102.6 | 12.047 |
| 1102.7 | 12.061 |
| 1102.7 | 12.068 |
| 1102.8 | 12.086 |
| 1102.9 | 12.103 |
| 1102.9 | 12.122 |
| 1103.0 | 12.147 |
| 1103.0 | 12.168 |
| 1103.2 | 12.216 |
| 1103.4 | 12.241 |
| 1103.9 | 12.277 |
| 1104.1 | 12.304 |
| 1104.3 | 12.325 |
| 1104.3 | 12.333 |
| 1104.3 | 12.347 |
| 1104.5 | 12.362 |
| 1104.8 | 12.393 |
| 1104.8 | 12.41 |
| 1104.8 | 12.424 |
| 1105.2 | 12.451 |
| 1105.4 | 12.479 |
| 1105.7 | 12.517 |
| 1105.9 | 12.532 |
| 1106.1 | 12.548 |
| 1106.1 | 12.554 |
| 1106.4 | 12.568 |
| 1106.4 | 12.58 |
| 1106.5 | 12.602 |
| 1106.6 | 12.62 |
| 1106.7 | 12.657 |
| 1107.0 | 12.687 |
| 1107.2 | 12.708 |
| 1107.4 | 12.734 |
| 1107.4 | 12.749 |
| 1107.6 | 12.777 |
| 1107.8 | 12.8 |
| 1108.0 | 12.832 |
| 1108.1 | 12.852 |
| 1108.4 | 12.887 |
| 1108.7 | 12.908 |
| 1109.1 | 12.926 |
| 1109.3 | 12.933 |
| 1109.7 | 12.939 |
| 1109.8 | 12.943 |
| 1109.8 | 12.945 |
| 1109.8 | 12.955 |
| 1110.0 | 12.964 |
| 1110.4 | 12.979 |
| 1113.4 | 12.968 |
| 1118.4 | 12.866 |
| 1118.9 | 12.666 |
| 1116.5 | 12.189 |
| 1114.8 | 11.955 |
| 1113.5 | 11.807 |
| 1113.1 | 11.771 |
| 1113.0 | 11.766 |
| 1113.1 | 11.776 |
| 1113.3 | 11.789 |
| 1113.4 | 11.8 |
| 1113.5 | 11.813 |
| 1113.6 | 11.84 |
| 1113.7 | 11.859 |
| 1113.6 | 11.881 |
| 1113.7 | 11.897 |
| 1114.0 | 11.93 |
| 1114.1 | 11.952 |
| 1114.3 | 11.985 |
| 1114.4 | 12.008 |
| 1114.7 | 12.038 |
| 1114.9 | 12.051 |
| 1115.0 | 12.065 |
| 1115.0 | 12.074 |
| 1115.0 | 12.084 |
| 1115.3 | 12.111 |
| 1115.5 | 12.142 |
| 1115.9 | 12.174 |
| 1116.0 | 12.194 |
| 1116.2 | 12.212 |
| 1116.2 | 12.224 |
| 1116.6 | 12.247 |
| 1116.6 | 12.263 |
| 1116.6 | 12.28 |
| 1116.7 | 12.294 |
| 1116.9 | 12.323 |
| 1117.0 | 12.343 |
| 1117.3 | 12.376 |
| 1117.5 | 12.393 |
| 1117.6 | 12.411 |
| 1117.8 | 12.433 |
| 1117.8 | 12.451 |
| 1118.0 | 12.487 |
| 1118.1 | 12.515 |
| 1118.6 | 12.554 |
| 1118.7 | 12.579 |
| 1118.9 | 12.606 |
| 1119.1 | 12.619 |
| 1119.2 | 12.642 |
| 1119.3 | 12.658 |
| 1119.5 | 12.688 |
| 1119.7 | 12.706 |
| 1119.7 | 12.735 |
| 1119.8 | 12.756 |
| 1120.0 | 12.784 |
| 1120.5 | 12.824 |
| 1120.6 | 12.843 |
| 1120.7 | 12.861 |
| 1120.8 | 12.875 |
| 1121.2 | 12.9 |
| 1121.6 | 12.915 |
| 1121.8 | 12.921 |
| 1122.0 | 12.922 |
| 1122.2 | 12.928 |
| 1122.3 | 12.931 |
| 1122.3 | 12.934 |
| 1122.4 | 12.944 |
| 1122.5 | 12.964 |
| 1122.7 | 12.983 |
| 1123.6 | 12.985 |
| 1129.3 | 12.956 |
| 1132.2 | 12.829 |
| 1130.8 | 12.379 |
| 1128.6 | 12.065 |
| 1126.4 | 11.811 |
| 1126.1 | 11.75 |
| 1126.0 | 11.735 |
| 1126.0 | 11.738 |
| 1126.1 | 11.744 |
| 1126.1 | 11.753 |
| 1126.2 | 11.77 |
| 1126.2 | 11.783 |
| 1126.2 | 11.807 |
| 1126.3 | 11.824 |
| 1126.4 | 11.847 |
| 1126.5 | 11.884 |
| 1126.7 | 11.903 |
| 1127.1 | 11.942 |
| 1127.1 | 11.96 |
| 1127.3 | 11.989 |
| 1127.5 | 12.007 |
| 1127.9 | 12.025 |
| 1128.0 | 12.034 |
| 1127.7 | 12.044 |
| 1128.0 | 12.059 |
| 1128.1 | 12.087 |
| 1128.3 | 12.113 |
| 1128.4 | 12.133 |
| 1128.7 | 12.167 |
| 1128.8 | 12.183 |
| 1129.0 | 12.208 |
| 1129.2 | 12.223 |
| 1129.4 | 12.247 |
| 1129.5 | 12.26 |
| 1129.5 | 12.277 |
| 1129.8 | 12.298 |
| 1130.0 | 12.334 |
| 1130.1 | 12.357 |
| 1130.3 | 12.385 |
| 1130.6 | 12.405 |
| 1130.9 | 12.429 |
| 1130.9 | 12.441 |
| 1131.1 | 12.457 |
| 1131.2 | 12.477 |
| 1131.3 | 12.497 |
| 1131.5 | 12.521 |
| 1131.5 | 12.538 |
| 1131.8 | 12.562 |
| 1131.9 | 12.585 |
| 1132.1 | 12.623 |
| 1132.2 | 12.646 |
| 1132.4 | 12.679 |
| 1132.7 | 12.699 |
| 1133.2 | 12.737 |
| 1133.4 | 12.754 |
| 1133.3 | 12.765 |
| 1133.3 | 12.772 |
| 1133.4 | 12.792 |
| 1133.7 | 12.826 |
| 1133.8 | 12.853 |
| 1134.1 | 12.874 |
| 1134.6 | 12.892 |
| 1134.9 | 12.903 |
| 1135.2 | 12.903 |
| 1135.3 | 12.903 |
| 1135.3 | 12.905 |
| 1135.3 | 12.915 |
| 1135.4 | 12.922 |
| 1135.8 | 12.939 |
| 1135.9 | 12.949 |
| 1135.9 | 12.955 |
| 1135.9 | 12.968 |
| 1137.2 | 12.974 |
| 1144.2 | 12.935 |
| 1147.6 | 12.766 |
| 1145.3 | 12.2 |
| 1142.7 | 11.825 |
| 1140.6 | 11.524 |
| 1140.1 | 11.454 |
| 1139.7 | 11.422 |
| 1139.7 | 11.421 |
| 1139.7 | 11.43 |
| 1139.7 | 11.443 |
| 1139.7 | 11.46 |
| 1139.8 | 11.473 |
| 1140.1 | 11.497 |
| 1140.1 | 11.514 |
| 1140.1 | 11.537 |
| 1140.3 | 11.558 |
| 1140.6 | 11.592 |
| 1140.6 | 11.61 |
| 1140.7 | 11.626 |
| 1140.9 | 11.661 |
| 1141.1 | 11.685 |
| 1141.3 | 11.704 |
| 1141.3 | 11.714 |
| 1141.4 | 11.739 |
| 1141.5 | 11.762 |
| 1141.7 | 11.793 |
| 1141.9 | 11.815 |
| 1141.9 | 11.845 |
| 1142.0 | 11.87 |
| 1142.5 | 11.905 |
| 1142.7 | 11.93 |
| 1142.9 | 11.954 |
| 1143.0 | 11.965 |
| 1143.0 | 11.978 |
| 1143.3 | 11.993 |
| 1143.3 | 12.012 |
| 1143.4 | 12.042 |
| 1143.6 | 12.064 |
| 1143.9 | 12.091 |
| 1143.9 | 12.109 |
| 1144.1 | 12.136 |
| 1144.2 | 12.157 |
| 1144.4 | 12.188 |
| 1144.6 | 12.21 |
| 1144.7 | 12.253 |
| 1144.8 | 12.277 |
| 1145.2 | 12.313 |
| 1145.5 | 12.336 |
| 1145.9 | 12.366 |
| 1145.9 | 12.373 |
| 1146.0 | 12.38 |
| 1146.0 | 12.389 |
| 1146.1 | 12.402 |
| 1146.2 | 12.431 |
| 1146.6 | 12.456 |
| 1147.0 | 12.476 |
| 1147.1 | 12.488 |
| 1147.1 | 12.499 |
| 1147.3 | 12.511 |
| 1147.6 | 12.536 |
| 1147.6 | 12.555 |
| 1147.6 | 12.585 |
| 1147.6 | 12.607 |
| 1148.0 | 12.651 |
| 1148.1 | 12.676 |
| 1148.4 | 12.71 |
| 1148.4 | 12.726 |
| 1148.5 | 12.745 |
| 1149.1 | 12.778 |
| 1149.6 | 12.8 |
| 1149.8 | 12.811 |
| 1149.8 | 12.807 |
| 1150.0 | 12.805 |
| 1150.2 | 12.813 |
| 1150.3 | 12.824 |
| 1150.3 | 12.831 |
| 1150.5 | 12.847 |
| 1150.6 | 12.861 |
| 1151.0 | 12.876 |
| 1153.0 | 12.87 |
| 1157.5 | 12.803 |
| 1158.7 | 12.653 |
| 1157.0 | 12.41 |
| 1154.8 | 12.041 |
| 1154.1 | 11.931 |
| 1153.7 | 11.891 |
| 1153.6 | 11.886 |
| 1153.6 | 11.895 |
| 1153.7 | 11.905 |
| 1153.7 | 11.92 |
| 1153.8 | 11.931 |
| 1154.0 | 11.955 |
| 1154.1 | 11.976 |
| 1154.2 | 12.004 |
| 1154.4 | 12.024 |
| 1154.4 | 12.056 |
| 1154.7 | 12.073 |
| 1154.9 | 12.098 |
| 1154.9 | 12.115 |
| 1155.0 | 12.134 |
| 1155.3 | 12.173 |
| 1155.4 | 12.2 |
| 1155.7 | 12.225 |
| 1155.9 | 12.245 |
| 1156.1 | 12.265 |
| 1156.3 | 12.274 |
| 1156.3 | 12.286 |
| 1156.3 | 12.293 |
| 1156.6 | 12.315 |
| 1156.7 | 12.334 |
| 1157.0 | 12.365 |
| 1157.2 | 12.383 |
| 1157.3 | 12.407 |
| 1157.5 | 12.424 |
| 1157.6 | 12.442 |
| 1157.8 | 12.462 |
| 1157.9 | 12.476 |
| 1158.0 | 12.502 |
| 1158.2 | 12.511 |
| 1158.2 | 12.513 |
| 1158.2 | 12.51 |
| 1158.4 | 12.517 |
| 1158.5 | 12.526 |
| 1158.5 | 12.537 |
| 1158.6 | 12.545 |
| 1158.6 | 12.563 |
| 1158.8 | 12.585 |
| 1159.1 | 12.623 |
| 1159.3 | 12.647 |
| 1159.4 | 12.67 |
| 1159.5 | 12.699 |
| 1159.8 | 12.715 |
| 1160.0 | 12.738 |
| 1160.1 | 12.752 |
| 1160.3 | 12.771 |
| 1160.3 | 12.785 |
| 1160.6 | 12.813 |
| 1161.0 | 12.831 |
| 1161.3 | 12.853 |
| 1161.6 | 12.864 |
| 1161.8 | 12.869 |
| 1161.9 | 12.872 |
| 1162.0 | 12.883 |
| 1162.0 | 12.893 |
| 1162.2 | 12.903 |
| 1162.2 | 12.917 |
| 1163.3 | 12.921 |
| 1169.2 | 12.9 |
| 1173.0 | 12.765 |
| 1171.8 | 12.361 |
| 1169.5 | 12.012 |
| 1167.4 | 11.664 |
| 1166.8 | 11.582 |
| 1166.5 | 11.535 |
| 1166.4 | 11.527 |
| 1166.4 | 11.527 |
| 1166.4 | 11.525 |
| 1166.5 | 11.521 |
| 1166.4 | 11.514 |
| 1166.2 | 11.501 |
| 1166.2 | 11.484 |
| 1166.2 | 11.481 |
| 1166.2 | 11.481 |
| 1166.2 | 11.484 |
| 1166.2 | 11.486 |
| 1166.2 | 11.489 |
| 1166.2 | 11.5 |
| 1166.2 | 11.51 |
| 1166.3 | 11.535 |
| 1166.4 | 11.55 |
| 1166.5 | 11.571 |
| 1166.5 | 11.583 |
| 1166.7 | 11.61 |
| 1166.8 | 11.63 |
| 1166.9 | 11.65 |
| 1167.0 | 11.675 |
| 1167.4 | 11.701 |
| 1167.6 | 11.713 |
| 1167.7 | 11.729 |
| 1167.6 | 11.744 |
| 1167.9 | 11.759 |
| 1168.1 | 11.787 |
| 1168.1 | 11.799 |
| 1168.3 | 11.815 |
| 1168.3 | 11.827 |
| 1168.3 | 11.85 |
| 1168.4 | 11.868 |
| 1168.6 | 11.901 |
| 1168.9 | 11.922 |
| 1169.2 | 11.953 |
| 1169.3 | 11.973 |
| 1169.4 | 11.996 |
| 1169.5 | 12.015 |
| 1169.5 | 12.033 |
| 1169.6 | 12.068 |
| 1169.9 | 12.091 |
| 1170.3 | 12.124 |
| 1170.5 | 12.142 |
| 1170.5 | 12.164 |
| 1170.6 | 12.176 |
| 1170.9 | 12.199 |
| 1171.1 | 12.214 |
| 1171.1 | 12.237 |
| 1171.2 | 12.253 |
| 1171.4 | 12.279 |
| 1171.5 | 12.297 |
| 1171.7 | 12.327 |
| 1171.9 | 12.348 |
| 1172.0 | 12.366 |
| 1172.4 | 12.393 |
| 1172.5 | 12.407 |
| 1172.5 | 12.431 |
| 1172.6 | 12.45 |
| 1173.0 | 12.471 |
| 1173.2 | 12.487 |
| 1173.2 | 12.51 |
| 1173.3 | 12.528 |
| 1173.5 | 12.554 |
| 1173.8 | 12.572 |
| 1173.9 | 12.6 |
| 1173.9 | 12.619 |
| 1174.3 | 12.646 |
| 1174.4 | 12.669 |
| 1174.7 | 12.699 |
| 1174.7 | 12.714 |
| 1175.0 | 12.728 |
| 1175.2 | 12.749 |
| 1175.3 | 12.763 |
| 1175.4 | 12.78 |
| 1175.7 | 12.794 |
| 1176.0 | 12.813 |
| 1176.3 | 12.828 |
| 1176.5 | 12.842 |
| 1176.6 | 12.848 |
| 1176.9 | 12.858 |
| 1177.2 | 12.864 |
| 1179.4 | 12.859 |
| 1182.2 | 12.83 |
| 1185.4 | 12.695 |
| 1184.5 | 12.526 |
| 1182.7 | 12.234 |
| 1181.7 | 12.121 |
| 1181.3 | 12.039 |
| 1180.9 | 12.008 |
| 1180.9 | 11.988 |
| 1180.8 | 11.981 |
| 1180.9 | 11.981 |
| 1180.8 | 11.985 |
| 1180.9 | 11.993 |
| 1181.1 | 12.007 |
| 1181.1 | 12.01 |
| 1181.1 | 12.015 |
| 1181.3 | 12.023 |
| 1181.5 | 12.039 |
| 1181.5 | 12.045 |
| 1181.4 | 12.053 |
| 1181.3 | 12.065 |
| 1181.4 | 12.096 |
| 1181.6 | 12.119 |
| 1181.9 | 12.143 |
| 1182.1 | 12.173 |
| 1182.3 | 12.2 |
| 1182.3 | 12.214 |
| 1182.5 | 12.231 |
| 1182.6 | 12.257 |
| 1182.8 | 12.274 |
| 1183.0 | 12.299 |
| 1183.2 | 12.316 |
| 1183.3 | 12.337 |
| 1183.4 | 12.353 |
| 1183.5 | 12.376 |
| 1183.6 | 12.395 |
| 1184.0 | 12.42 |
| 1184.0 | 12.44 |
| 1184.2 | 12.464 |
| 1184.4 | 12.481 |
| 1184.6 | 12.497 |
| 1184.8 | 12.517 |
| 1184.9 | 12.533 |
| 1184.9 | 12.549 |
| 1185.2 | 12.565 |
| 1185.5 | 12.586 |
| 1185.5 | 12.601 |
| 1185.5 | 12.62 |
| 1185.8 | 12.637 |
| 1186.0 | 12.665 |
| 1186.1 | 12.679 |
| 1186.4 | 12.706 |
| 1186.6 | 12.722 |
| 1186.7 | 12.74 |
| 1186.8 | 12.75 |
| 1187.0 | 12.774 |
| 1187.1 | 12.788 |
| 1187.2 | 12.807 |
| 1187.7 | 12.82 |
| 1188.5 | 12.831 |
| 1190.4 | 12.817 |
| 1192.2 | 12.78 |
| 1193.6 | 12.679 |
| 1193.0 | 12.576 |
| 1191.9 | 12.417 |
| 1191.4 | 12.356 |
| 1191.0 | 12.317 |
| 1191.0 | 12.31 |
| 1191.0 | 12.307 |
| 1191.1 | 12.309 |
| 1191.0 | 12.314 |
| 1191.1 | 12.321 |
| 1191.2 | 12.333 |
| 1191.4 | 12.344 |
| 1191.4 | 12.355 |
| 1191.5 | 12.368 |
| 1191.6 | 12.377 |
| 1191.8 | 12.396 |
| 1191.8 | 12.407 |
| 1191.8 | 12.425 |
| 1191.9 | 12.436 |
| 1192.2 | 12.463 |
| 1192.3 | 12.479 |
| 1192.4 | 12.498 |
| 1192.5 | 12.514 |
| 1192.9 | 12.539 |
| 1193.0 | 12.554 |
| 1193.1 | 12.572 |
| 1193.1 | 12.585 |
| 1193.4 | 12.613 |
| 1193.6 | 12.635 |
| 1193.6 | 12.652 |
| 1193.8 | 12.674 |
| 1194.0 | 12.688 |
| 1194.3 | 12.712 |
| 1194.4 | 12.726 |
| 1194.7 | 12.742 |
| 1194.8 | 12.75 |
| 1194.9 | 12.765 |
| 1195.0 | 12.777 |
| 1195.3 | 12.794 |
| 1195.4 | 12.807 |
| 1195.7 | 12.83 |
| 1196.0 | 12.845 |
| 1197.1 | 12.853 |
| 1198.7 | 12.835 |
| 1201.1 | 12.771 |
| 1202.0 | 12.695 |
| 1201.7 | 12.594 |
| 1200.7 | 12.442 |
| 1200.1 | 12.362 |
| 1199.8 | 12.293 |
| 1199.7 | 12.273 |
| 1199.5 | 12.263 |
| 1199.4 | 12.262 |
| 1199.5 | 12.265 |
| 1199.5 | 12.27 |
| 1199.5 | 12.281 |
| 1199.5 | 12.286 |
| 1199.5 | 12.303 |
| 1199.7 | 12.314 |
| 1199.8 | 12.328 |
| 1200.0 | 12.35 |
| 1200.0 | 12.363 |
| 1200.3 | 12.385 |
| 1200.4 | 12.399 |
| 1200.5 | 12.417 |
| 1200.6 | 12.433 |
| 1200.8 | 12.459 |
| 1201.0 | 12.471 |
| 1201.1 | 12.492 |
| 1201.1 | 12.504 |
| 1201.3 | 12.527 |
| 1201.4 | 12.554 |
| 1201.8 | 12.58 |
| 1201.8 | 12.592 |
| 1201.8 | 12.607 |
| 1201.9 | 12.63 |
| 1202.0 | 12.66 |
| 1202.2 | 12.682 |
| 1202.4 | 12.703 |
| 1202.7 | 12.734 |
| 1202.9 | 12.749 |
| 1203.0 | 12.765 |
| 1203.2 | 12.777 |
| 1203.5 | 12.801 |
| 1203.6 | 12.819 |
| 1203.9 | 12.838 |
| 1204.2 | 12.852 |
| 1204.5 | 12.866 |
| 1204.6 | 12.871 |
| 1204.9 | 12.876 |
| 1205.0 | 12.882 |
| 1205.1 | 12.888 |
| 1205.2 | 12.895 |
| 1205.4 | 12.903 |
| 1208.4 | 12.898 |
| 1211.8 | 12.877 |
| 1214.7 | 12.711 |
| 1213.7 | 12.504 |
| 1211.4 | 12.231 |
| 1210.6 | 12.102 |
| 1210.0 | 11.998 |
| 1209.8 | 11.965 |
| 1209.5 | 11.945 |
| 1209.6 | 11.943 |
| 1209.6 | 11.943 |
| 1209.8 | 11.943 |
| 1209.5 | 11.948 |
| 1209.8 | 11.956 |
| 1209.8 | 11.973 |
| 1209.8 | 11.982 |
| 1209.8 | 11.993 |
| 1209.9 | 12.013 |
| 1210.0 | 12.029 |
| 1210.1 | 12.051 |
| 1210.2 | 12.063 |
| 1210.3 | 12.08 |
| 1210.3 | 12.094 |
| 1210.5 | 12.116 |
| 1210.6 | 12.134 |
| 1210.9 | 12.162 |
| 1211.1 | 12.179 |
| 1211.2 | 12.205 |
| 1211.3 | 12.222 |
| 1211.5 | 12.244 |
| 1211.5 | 12.258 |
| 1211.5 | 12.279 |
| 1211.7 | 12.302 |
| 1211.9 | 12.325 |
| 1212.2 | 12.354 |
| 1212.6 | 12.37 |
| 1212.7 | 12.387 |
| 1212.8 | 12.391 |
| 1213.0 | 12.408 |
| 1212.8 | 12.42 |
| 1213.1 | 12.447 |
| 1213.2 | 12.464 |
| 1213.4 | 12.492 |
| 1213.5 | 12.511 |
| 1213.9 | 12.543 |
| 1214.0 | 12.559 |
| 1214.0 | 12.579 |
| 1214.1 | 12.592 |
| 1214.3 | 12.608 |
| 1214.6 | 12.639 |
| 1214.7 | 12.658 |
| 1215.0 | 12.677 |
| 1215.1 | 12.688 |
| 1215.2 | 12.71 |
| 1215.3 | 12.727 |
| 1215.6 | 12.751 |
| 1215.7 | 12.766 |
| 1215.9 | 12.789 |
| 1216.0 | 12.802 |
| 1216.3 | 12.82 |
| 1216.4 | 12.832 |
| 1216.6 | 12.853 |
| 1216.9 | 12.864 |
| 1220.2 | 12.863 |
| 1223.3 | 12.83 |
| 1225.7 | 12.745 |
| 1224.9 | 12.46 |
| 1223.6 | 12.267 |
| 1221.6 | 12.074 |
| 1221.0 | 12.007 |
| 1220.7 | 11.961 |
| 1220.7 | 11.958 |
| 1220.8 | 11.954 |
| 1220.9 | 11.954 |
| 1220.9 | 11.962 |
| 1220.8 | 11.97 |
| 1220.7 | 11.982 |
| 1220.8 | 11.995 |
| 1221.0 | 12.019 |
| 1221.1 | 12.034 |
| 1221.3 | 12.046 |
| 1221.5 | 12.063 |
| 1221.6 | 12.08 |
| 1221.7 | 12.091 |
| 1221.9 | 12.101 |
| 1221.9 | 12.111 |
| 1222.0 | 12.122 |
| 1222.1 | 12.139 |
| 1222.2 | 12.156 |
| 1222.3 | 12.177 |
| 1222.5 | 12.194 |
| 1222.7 | 12.224 |
| 1222.8 | 12.241 |
| 1223.0 | 12.267 |
| 1223.0 | 12.284 |
| 1223.3 | 12.315 |
| 1223.4 | 12.334 |
| 1223.6 | 12.362 |
| 1223.8 | 12.377 |
| 1223.9 | 12.391 |
| 1224.1 | 12.419 |
| 1224.4 | 12.436 |
| 1224.5 | 12.45 |
| 1224.6 | 12.464 |
| 1224.7 | 12.487 |
| 1224.8 | 12.498 |
| 1225.1 | 12.516 |
| 1225.2 | 12.534 |
| 1225.2 | 12.559 |
| 1225.3 | 12.576 |
| 1225.5 | 12.602 |
| 1225.8 | 12.626 |
| 1226.0 | 12.658 |
| 1226.1 | 12.674 |
| 1226.1 | 12.692 |
| 1226.4 | 12.709 |
| 1226.6 | 12.737 |
| 1226.8 | 12.754 |
| 1226.8 | 12.762 |
| 1227.1 | 12.784 |
| 1227.1 | 12.802 |
| 1227.7 | 12.83 |
| 1230.9 | 12.831 |
| 1236.3 | 12.761 |
| 1237.3 | 12.614 |
| 1235.3 | 12.25 |
| 1233.7 | 12.046 |
| 1232.1 | 11.873 |
| 1231.6 | 11.804 |
| 1231.1 | 11.722 |
| 1231.0 | 11.678 |
| 1230.6 | 11.636 |
| 1230.4 | 11.618 |
| 1230.4 | 11.604 |
| 1230.2 | 11.593 |
| 1230.0 | 11.593 |
| 1230.0 | 11.596 |
| 1229.9 | 11.601 |
| 1229.9 | 11.61 |
| 1230.0 | 11.615 |
| 1230.2 | 11.623 |
| 1230.3 | 11.628 |
| 1230.2 | 11.632 |
| 1230.2 | 11.636 |
| 1230.0 | 11.646 |
| 1230.3 | 11.661 |
| 1230.4 | 11.678 |
| 1230.6 | 11.701 |
| 1230.8 | 11.713 |
| 1230.6 | 11.724 |
| 1230.8 | 11.736 |
| 1231.0 | 11.76 |
| 1231.2 | 11.773 |
| 1231.4 | 11.787 |
| 1231.2 | 11.795 |
| 1231.2 | 11.815 |
| 1231.4 | 11.829 |
| 1231.6 | 11.856 |
| 1231.7 | 11.873 |
| 1231.8 | 11.898 |
| 1231.9 | 11.915 |
| 1232.2 | 11.938 |
| 1232.3 | 11.952 |
| 1232.5 | 11.977 |
| 1232.7 | 11.994 |
| 1232.8 | 12.008 |
| 1233.0 | 12.028 |
| 1233.0 | 12.039 |
| 1233.1 | 12.057 |
| 1233.1 | 12.069 |
| 1233.4 | 12.093 |
| 1233.5 | 12.109 |
| 1233.8 | 12.138 |
| 1233.8 | 12.154 |
| 1234.1 | 12.178 |
| 1234.2 | 12.194 |
| 1234.6 | 12.219 |
| 1234.8 | 12.234 |
| 1235.0 | 12.252 |
| 1235.2 | 12.258 |
| 1235.0 | 12.262 |
| 1235.0 | 12.276 |
| 1235.2 | 12.287 |
| 1235.4 | 12.307 |
| 1235.5 | 12.326 |
| 1235.6 | 12.35 |
| 1235.6 | 12.368 |
| 1236.0 | 12.391 |
| 1236.2 | 12.411 |
| 1236.5 | 12.437 |
| 1236.6 | 12.453 |
| 1236.8 | 12.47 |
| 1236.9 | 12.481 |
| 1236.9 | 12.498 |
| 1236.8 | 12.51 |
| 1236.9 | 12.532 |
| 1237.2 | 12.549 |
| 1237.4 | 12.569 |
| 1237.6 | 12.597 |
| 1237.8 | 12.613 |
| 1237.9 | 12.64 |
| 1238.1 | 12.659 |
| 1238.6 | 12.686 |
| 1238.7 | 12.702 |
| 1239.1 | 12.716 |
| 1239.3 | 12.722 |
| 1239.8 | 12.733 |
| 1239.8 | 12.735 |
| 1240.1 | 12.738 |
| 1240.1 | 12.739 |
| 1240.3 | 12.746 |
| 1240.3 | 12.75 |
| 1240.5 | 12.761 |
| 1240.6 | 12.767 |
| 1243.2 | 12.758 |
| 1249.4 | 12.709 |
| 1253.0 | 12.603 |
| 1251.7 | 12.334 |
| 1250.1 | 12.127 |
| 1248.6 | 11.916 |
| 1247.9 | 11.806 |
| 1247.1 | 11.727 |
| 1246.9 | 11.692 |
| 1246.7 | 11.657 |
| 1246.5 | 11.647 |
| 1246.3 | 11.638 |
| 1246.4 | 11.635 |
| 1246.5 | 11.635 |
| 1246.5 | 11.639 |
| 1246.5 | 11.638 |
| 1246.4 | 11.646 |
| 1246.4 | 11.652 |
| 1246.5 | 11.663 |
| 1246.7 | 11.672 |
| 1246.8 | 11.684 |
| 1246.7 | 11.687 |
| 1246.7 | 11.699 |
| 1246.8 | 11.709 |
| 1246.8 | 11.729 |
| 1246.9 | 11.742 |
| 1247.0 | 11.761 |
| 1247.1 | 11.778 |
| 1247.4 | 11.794 |
| 1247.4 | 11.807 |
| 1247.6 | 11.817 |
| 1247.6 | 11.834 |
| 1247.7 | 11.849 |
| 1247.9 | 11.869 |
| 1248.1 | 11.882 |
| 1248.4 | 11.903 |
| 1248.6 | 11.913 |
| 1248.6 | 11.924 |
| 1248.6 | 11.936 |
| 1248.7 | 11.958 |
| 1249.0 | 11.975 |
| 1249.2 | 11.995 |
| 1249.2 | 12.008 |
| 1249.3 | 12.028 |
| 1249.4 | 12.045 |
| 1249.4 | 12.065 |
| 1249.6 | 12.081 |
| 1249.8 | 12.094 |
| 1249.9 | 12.118 |
| 1249.9 | 12.13 |
| 1250.0 | 12.153 |
| 1250.1 | 12.173 |
| 1250.2 | 12.206 |
| 1250.3 | 12.225 |
| 1250.6 | 12.256 |
| 1250.8 | 12.28 |
| 1251.2 | 12.314 |
| 1251.4 | 12.328 |
| 1251.5 | 12.345 |
| 1251.8 | 12.357 |
| 1252.0 | 12.373 |
| 1252.1 | 12.385 |
| 1252.2 | 12.391 |
| 1252.1 | 12.403 |
| 1252.1 | 12.418 |
| 1252.4 | 12.45 |
| 1252.6 | 12.465 |
| 1252.8 | 12.496 |
| 1253.2 | 12.511 |
| 1253.4 | 12.532 |
| 1253.6 | 12.543 |
| 1253.8 | 12.551 |
| 1253.8 | 12.559 |
| 1253.8 | 12.573 |
| 1253.9 | 12.588 |
| 1254.1 | 12.606 |
| 1254.3 | 12.622 |
| 1254.4 | 12.632 |
| 1255.5 | 12.649 |
| 1261.4 | 12.632 |
| 1264.5 | 12.574 |
| 1264.9 | 12.46 |
| 1263.5 | 12.2 |
| 1262.3 | 12.062 |
| 1261.1 | 11.936 |
| 1260.6 | 11.876 |
| 1260.2 | 11.824 |
| 1260.2 | 11.81 |
| 1260.0 | 11.794 |
| 1259.8 | 11.788 |
| 1260.0 | 11.784 |
| 1260.0 | 11.784 |
| 1260.0 | 11.792 |
| 1260.0 | 11.8 |
| 1260.1 | 11.811 |
| 1260.1 | 11.818 |
| 1260.1 | 11.824 |
| 1260.2 | 11.836 |
| 1260.3 | 11.845 |
| 1260.3 | 11.857 |
| 1260.3 | 11.865 |
| 1260.4 | 11.884 |
| 1260.6 | 11.897 |
| 1260.8 | 11.915 |
| 1260.9 | 11.927 |
| 1261.0 | 11.942 |
| 1261.0 | 11.952 |
| 1261.1 | 11.976 |
| 1261.3 | 11.99 |
| 1261.5 | 12.01 |
| 1261.7 | 12.021 |
| 1262.0 | 12.039 |
| 1262.0 | 12.047 |
| 1262.0 | 12.058 |
| 1262.2 | 12.075 |
| 1262.2 | 12.088 |
| 1262.3 | 12.11 |
| 1262.6 | 12.125 |
| 1262.8 | 12.148 |
| 1262.8 | 12.162 |
| 1263.0 | 12.184 |
| 1263.0 | 12.196 |
| 1263.4 | 12.219 |
| 1263.6 | 12.234 |
| 1263.8 | 12.245 |
| 1263.9 | 12.26 |
| 1264.0 | 12.276 |
| 1264.0 | 12.288 |
| 1264.0 | 12.302 |
| 1264.2 | 12.327 |
| 1264.5 | 12.345 |
| 1264.7 | 12.367 |
| 1264.8 | 12.379 |
| 1264.9 | 12.403 |
| 1265.1 | 12.418 |
| 1265.3 | 12.44 |
| 1265.4 | 12.456 |
| 1265.5 | 12.474 |
| 1265.7 | 12.485 |
| 1265.8 | 12.504 |
| 1266.0 | 12.519 |
| 1266.3 | 12.543 |
| 1266.1 | 12.556 |
| 1266.3 | 12.571 |
| 1266.7 | 12.595 |
| 1266.8 | 12.611 |
| 1267.3 | 12.632 |
| 1267.6 | 12.645 |
| 1267.9 | 12.663 |
| 1267.9 | 12.668 |
| 1268.1 | 12.675 |
| 1268.5 | 12.674 |
| 1273.8 | 12.659 |
| 1277.1 | 12.606 |
| 1277.9 | 12.416 |
| 1276.6 | 12.248 |
| 1274.9 | 12.065 |
| 1274.2 | 11.982 |
| 1273.6 | 11.928 |
| 1273.4 | 11.882 |
| 1273.3 | 11.872 |
| 1273.1 | 11.857 |
| 1273.0 | 11.855 |
| 1273.0 | 11.851 |
| 1273.1 | 11.856 |
| 1273.1 | 11.859 |
| 1273.1 | 11.864 |
| 1273.1 | 11.875 |
| 1273.3 | 11.882 |
| 1273.4 | 11.893 |
| 1273.4 | 11.903 |
| 1273.4 | 11.915 |
| 1273.5 | 11.926 |
| 1273.7 | 11.945 |
| 1273.6 | 11.955 |
| 1273.7 | 11.968 |
| 1273.8 | 11.985 |
| 1274.0 | 12 |
| 1274.2 | 12.017 |
| 1274.3 | 12.03 |
| 1274.4 | 12.05 |
| 1274.6 | 12.061 |
| 1274.8 | 12.079 |
| 1274.9 | 12.091 |
| 1275.0 | 12.11 |
| 1275.2 | 12.12 |
| 1275.4 | 12.142 |
| 1275.5 | 12.153 |
| 1275.5 | 12.172 |
| 1275.5 | 12.185 |
| 1275.6 | 12.2 |
| 1275.9 | 12.222 |
| 1276.1 | 12.237 |
| 1276.3 | 12.259 |
| 1276.5 | 12.274 |
| 1276.7 | 12.292 |
| 1276.8 | 12.304 |
| 1276.9 | 12.325 |
| 1276.8 | 12.34 |
| 1277.1 | 12.365 |
| 1277.2 | 12.383 |
| 1277.4 | 12.414 |
| 1277.6 | 12.429 |
| 1278.0 | 12.451 |
| 1278.0 | 12.466 |
| 1278.1 | 12.479 |
| 1278.4 | 12.494 |
| 1278.5 | 12.505 |
| 1278.6 | 12.519 |
| 1278.8 | 12.531 |
| 1279.1 | 12.551 |
| 1279.2 | 12.561 |
| 1279.4 | 12.579 |
| 1279.7 | 12.594 |
| 1279.7 | 12.612 |
| 1280.0 | 12.617 |
| 1283.1 | 12.607 |
| 1286.1 | 12.588 |
| 1288.6 | 12.482 |
| 1287.9 | 12.36 |
| 1286.8 | 12.236 |
| 1285.6 | 12.114 |
| 1285.1 | 12.063 |
| 1284.9 | 12.021 |
| 1284.8 | 12.006 |
| 1284.6 | 11.999 |
| 1284.6 | 12 |
| 1284.4 | 12.004 |
| 1284.4 | 12.008 |
| 1284.5 | 12.023 |
| 1284.6 | 12.03 |
| 1284.6 | 12.039 |
| 1284.8 | 12.045 |
| 1284.8 | 12.056 |
| 1285.0 | 12.065 |
| 1285.0 | 12.084 |
| 1285.1 | 12.094 |
| 1285.2 | 12.105 |
| 1285.5 | 12.121 |
| 1285.6 | 12.132 |
| 1285.8 | 12.15 |
| 1286.0 | 12.157 |
| 1285.8 | 12.167 |
| 1286.0 | 12.182 |
| 1286.2 | 12.204 |
| 1286.3 | 12.217 |
| 1286.4 | 12.233 |
| 1286.5 | 12.247 |
| 1286.5 | 12.267 |
| 1286.8 | 12.285 |
| 1287.0 | 12.308 |
| 1287.1 | 12.325 |
| 1287.3 | 12.347 |
| 1287.4 | 12.363 |
| 1287.7 | 12.387 |
| 1287.9 | 12.4 |
| 1288.0 | 12.413 |
| 1288.1 | 12.428 |
| 1288.2 | 12.436 |
| 1288.4 | 12.452 |
| 1288.4 | 12.465 |
| 1288.8 | 12.481 |
| 1288.9 | 12.491 |
| 1288.9 | 12.508 |
| 1289.0 | 12.516 |
| 1289.2 | 12.54 |
| 1289.3 | 12.557 |
| 1289.4 | 12.582 |
| 1289.5 | 12.596 |
| 1289.9 | 12.624 |
| 1290.3 | 12.639 |
| 1290.9 | 12.643 |
| 1295.6 | 12.628 |
| 1298.5 | 12.578 |
| 1299.2 | 12.419 |
| 1298.2 | 12.28 |
| 1296.8 | 12.124 |
| 1296.4 | 12.048 |
| 1295.9 | 11.979 |
| 1295.7 | 11.955 |
| 1295.3 | 11.928 |
| 1295.1 | 11.921 |
| 1295.2 | 11.918 |
| 1295.2 | 11.921 |
| 1295.2 | 11.926 |
| 1295.2 | 11.932 |
| 1295.3 | 11.948 |
| 1295.5 | 11.96 |
| 1295.7 | 11.97 |
| 1295.7 | 11.977 |
| 1295.7 | 11.985 |
| 1295.8 | 12 |
| 1295.9 | 12.007 |
| 1296.0 | 12.022 |
| 1296.0 | 12.029 |
| 1296.2 | 12.047 |
| 1296.2 | 12.058 |
| 1296.4 | 12.07 |
| 1296.5 | 12.08 |
| 1296.6 | 12.094 |
| 1296.6 | 12.109 |
| 1296.8 | 12.125 |
| 1296.9 | 12.138 |
| 1297.0 | 12.155 |
| 1297.1 | 12.184 |
| 1297.5 | 12.201 |
| 1297.6 | 12.225 |
| 1297.7 | 12.239 |
| 1297.8 | 12.259 |
| 1297.9 | 12.27 |
| 1298.1 | 12.293 |
| 1298.2 | 12.31 |
| 1298.3 | 12.334 |
| 1298.4 | 12.348 |
| 1298.7 | 12.367 |
| 1298.9 | 12.38 |
| 1299.0 | 12.402 |
| 1299.2 | 12.416 |
| 1299.4 | 12.429 |
| 1299.6 | 12.45 |
| 1299.6 | 12.459 |
| 1299.7 | 12.482 |
| 1299.7 | 12.497 |
| 1299.8 | 12.513 |
| 1300.0 | 12.528 |
| 1300.2 | 12.553 |
| 1300.4 | 12.571 |
| 1300.8 | 12.588 |
| 1300.9 | 12.606 |
| 1301.4 | 12.626 |
| 1301.6 | 12.635 |
| 1301.7 | 12.647 |
| 1302.0 | 12.658 |
| 1302.6 | 12.662 |
| 1306.7 | 12.635 |
| 1309.7 | 12.585 |
| 1310.9 | 12.446 |
| 1309.8 | 12.305 |
| 1308.6 | 12.115 |
| 1308.2 | 12.045 |
| 1307.6 | 11.979 |
| 1307.3 | 11.948 |
| 1307.1 | 11.919 |
| 1307.0 | 11.907 |
| 1307.1 | 11.903 |
| 1307.1 | 11.903 |
| 1307.1 | 11.91 |
| 1307.1 | 11.915 |
| 1307.2 | 11.924 |
| 1307.1 | 11.926 |
| 1307.1 | 11.935 |
| 1307.2 | 11.943 |
| 1307.3 | 11.952 |
| 1307.3 | 11.965 |
| 1307.3 | 11.977 |
| 1307.4 | 11.996 |
| 1307.6 | 12.008 |
| 1307.7 | 12.029 |
| 1307.8 | 12.045 |
| 1307.9 | 12.067 |
| 1308.2 | 12.082 |
| 1308.3 | 12.101 |
| 1308.4 | 12.111 |
| 1308.4 | 12.128 |
| 1308.4 | 12.141 |
| 1308.6 | 12.161 |
| 1308.9 | 12.176 |
| 1308.9 | 12.19 |
| 1308.9 | 12.211 |
| 1308.9 | 12.227 |
| 1309.2 | 12.257 |
| 1309.6 | 12.277 |
| 1309.7 | 12.304 |
| 1309.8 | 12.32 |
| 1310.0 | 12.342 |
| 1310.2 | 12.357 |
| 1310.4 | 12.38 |
| 1310.5 | 12.39 |
| 1310.5 | 12.41 |
| 1310.5 | 12.425 |
| 1310.9 | 12.454 |
| 1311.0 | 12.47 |
| 1311.2 | 12.492 |
| 1311.5 | 12.505 |
| 1311.6 | 12.526 |
| 1311.8 | 12.54 |
| 1312.1 | 12.554 |
| 1312.3 | 12.566 |
| 1312.3 | 12.574 |
| 1312.3 | 12.589 |
| 1312.4 | 12.6 |
| 1312.5 | 12.623 |
| 1312.9 | 12.636 |
| 1316.9 | 12.635 |
| 1320.6 | 12.606 |
| 1322.9 | 12.479 |
| 1322.0 | 12.325 |
| 1320.6 | 12.097 |
| 1319.8 | 12.008 |
| 1319.1 | 11.947 |
| 1318.6 | 11.897 |
| 1318.5 | 11.875 |
| 1318.2 | 11.856 |
| 1318.1 | 11.852 |
| 1318.1 | 11.85 |
| 1318.1 | 11.856 |
| 1318.2 | 11.865 |
| 1318.4 | 11.868 |
| 1318.5 | 11.874 |
| 1318.4 | 11.88 |
| 1318.4 | 11.891 |
| 1318.4 | 11.897 |
| 1318.7 | 11.908 |
| 1318.7 | 11.918 |
| 1318.8 | 11.932 |
| 1318.8 | 11.943 |
| 1319.0 | 11.954 |
| 1319.2 | 11.964 |
| 1319.3 | 11.973 |
| 1319.3 | 11.993 |
| 1319.3 | 12.005 |
| 1319.5 | 12.025 |
| 1319.8 | 12.041 |
| 1319.9 | 12.061 |
| 1320.1 | 12.071 |
| 1320.3 | 12.087 |
| 1320.3 | 12.098 |
| 1320.4 | 12.116 |
| 1320.4 | 12.132 |
| 1320.6 | 12.153 |
| 1320.6 | 12.17 |
| 1320.9 | 12.196 |
| 1321.0 | 12.213 |
| 1321.1 | 12.229 |
| 1321.3 | 12.246 |
| 1321.3 | 12.263 |
| 1321.4 | 12.29 |
| 1321.6 | 12.307 |
| 1321.9 | 12.331 |
| 1322.2 | 12.347 |
| 1322.2 | 12.367 |
| 1322.3 | 12.38 |
| 1322.4 | 12.396 |
| 1322.6 | 12.411 |
| 1322.9 | 12.436 |
| 1323.0 | 12.448 |
| 1323.1 | 12.462 |
| 1323.2 | 12.476 |
| 1323.6 | 12.499 |
| 1323.6 | 12.511 |
| 1323.8 | 12.519 |
| 1323.8 | 12.534 |
| 1323.9 | 12.55 |
| 1324.1 | 12.578 |
| 1324.3 | 12.59 |
| 1324.6 | 12.611 |
| 1325.0 | 12.623 |
| 1325.2 | 12.64 |
| 1325.5 | 12.649 |
| 1325.7 | 12.663 |
| 1326.5 | 12.665 |
| 1332.0 | 12.637 |
| 1335.9 | 12.573 |
| 1336.3 | 12.373 |
| 1334.9 | 12.189 |
| 1333.1 | 11.961 |
| 1332.2 | 11.881 |
| 1332.0 | 11.825 |
| 1331.4 | 11.777 |
| 1331.1 | 11.758 |
| 1331.1 | 11.749 |
| 1331.2 | 11.75 |
| 1331.2 | 11.753 |
| 1331.3 | 11.754 |
| 1331.3 | 11.756 |
| 1331.2 | 11.761 |
| 1331.1 | 11.769 |
| 1331.3 | 11.778 |
| 1331.7 | 11.792 |
| 1331.5 | 11.799 |
| 1331.5 | 11.807 |
| 1331.8 | 11.819 |
| 1331.7 | 11.832 |
| 1331.8 | 11.853 |
| 1332.0 | 11.873 |
| 1332.4 | 11.891 |
| 1332.5 | 11.903 |
| 1332.6 | 11.922 |
| 1332.7 | 11.937 |
| 1333.0 | 11.959 |
| 1333.0 | 11.977 |
| 1333.2 | 12.005 |
| 1333.3 | 12.025 |
| 1333.6 | 12.052 |
| 1333.8 | 12.068 |
| 1333.9 | 12.092 |
| 1334.0 | 12.104 |
| 1334.3 | 12.127 |
| 1334.5 | 12.145 |
| 1334.6 | 12.162 |
| 1334.6 | 12.189 |
| 1334.9 | 12.208 |
| 1335.1 | 12.241 |
| 1335.2 | 12.264 |
| 1335.6 | 12.298 |
| 1335.7 | 12.316 |
| 1335.9 | 12.345 |
| 1336.2 | 12.363 |
| 1336.3 | 12.388 |
| 1336.4 | 12.401 |
| 1336.9 | 12.425 |
| 1337.0 | 12.443 |
| 1337.2 | 12.468 |
| 1337.1 | 12.481 |
| 1337.5 | 12.504 |
| 1337.7 | 12.52 |
| 1337.8 | 12.542 |
| 1337.9 | 12.569 |
| 1338.3 | 12.59 |
| 1338.5 | 12.618 |
| 1339.0 | 12.636 |
| 1341.7 | 12.634 |
| 1344.9 | 12.612 |
| 1348.2 | 12.51 |
| 1347.4 | 12.385 |
| 1346.0 | 12.179 |
| 1345.3 | 12.093 |
| 1344.6 | 12.018 |
| 1344.4 | 11.988 |
| 1344.1 | 11.964 |
| 1344.1 | 11.955 |
| 1344.2 | 11.954 |
| 1344.1 | 11.956 |
| 1344.1 | 11.959 |
| 1344.0 | 11.973 |
| 1344.1 | 11.982 |
| 1344.6 | 12.034 |
| 1344.9 | 12.105 |
| 1345.7 | 12.228 |
| 1346.1 | 12.302 |
| 1347.2 | 12.407 |
| 1347.8 | 12.474 |
| 1348.6 | 12.568 |
| 1349.1 | 12.611 |
| 1349.8 | 12.662 |
| 1350.2 | 12.681 |
| 1350.3 | 12.686 |
| 1350.8 | 12.683 |
| 1355.0 | 12.646 |
| 1357.3 | 12.551 |
| 1357.3 | 12.378 |
| 1354.7 | 11.998 |
| 1353.3 | 11.864 |
| 1352.7 | 11.778 |
| 1352.8 | 11.79 |
| 1352.9 | 11.819 |
| 1352.9 | 11.838 |
| 1353.3 | 11.864 |
| 1353.3 | 11.881 |
| 1353.5 | 11.91 |
| 1353.6 | 11.927 |
| 1353.8 | 11.945 |
| 1354.1 | 11.953 |
| 1354.2 | 11.971 |
| 1354.2 | 11.984 |
| 1354.3 | 11.999 |
| 1354.6 | 12.024 |
| 1354.7 | 12.046 |
| 1354.9 | 12.079 |
| 1355.0 | 12.097 |
| 1355.3 | 12.124 |
| 1355.5 | 12.144 |
| 1355.6 | 12.171 |
| 1355.7 | 12.187 |
| 1356.1 | 12.21 |
| 1356.3 | 12.23 |
| 1356.5 | 12.254 |
| 1356.6 | 12.268 |
| 1356.6 | 12.29 |
| 1356.7 | 12.313 |
| 1356.8 | 12.337 |
| 1357.2 | 12.374 |
| 1357.4 | 12.396 |
| 1357.9 | 12.423 |
| 1358.1 | 12.429 |
| 1358.1 | 12.44 |
| 1358.1 | 12.447 |
| 1358.1 | 12.468 |
| 1358.4 | 12.489 |
| 1358.6 | 12.526 |
| 1358.8 | 12.545 |
| 1359.1 | 12.568 |
| 1359.2 | 12.586 |
| 1359.5 | 12.611 |
| 1359.8 | 12.625 |
| 1359.8 | 12.639 |
| 1360.1 | 12.662 |
| 1360.5 | 12.675 |
| 1364.8 | 12.66 |
| 1368.3 | 12.572 |
| 1368.9 | 12.24 |
| 1366.4 | 11.908 |
| 1363.7 | 11.552 |
| 1363.0 | 11.493 |
| 1362.9 | 11.5 |
| 1363.0 | 11.525 |
| 1363.3 | 11.564 |
| 1363.5 | 11.582 |
| 1363.8 | 11.606 |
| 1363.9 | 11.62 |
| 1364.1 | 11.633 |
| 1364.3 | 11.649 |
| 1364.3 | 11.656 |
| 1364.4 | 11.667 |
| 1364.3 | 11.678 |
| 1364.5 | 11.713 |
| 1364.8 | 11.733 |
| 1365.1 | 11.764 |
| 1365.5 | 11.777 |
| 1365.6 | 11.793 |
| 1365.7 | 11.798 |
| 1365.7 | 11.807 |
| 1365.8 | 11.819 |
| 1366.0 | 11.85 |
| 1366.2 | 11.869 |
| 1366.4 | 11.895 |
| 1366.4 | 11.904 |
| 1366.4 | 11.932 |
| 1366.5 | 11.958 |
| 1366.8 | 11.987 |
| 1367.1 | 12.025 |
| 1367.4 | 12.051 |
| 1367.6 | 12.084 |
| 1367.7 | 12.099 |
| 1368.1 | 12.116 |
| 1368.2 | 12.13 |
| 1368.3 | 12.153 |
| 1368.3 | 12.166 |
| 1368.4 | 12.191 |
| 1368.7 | 12.214 |
| 1368.9 | 12.25 |
| 1369.0 | 12.273 |
| 1369.3 | 12.3 |
| 1369.5 | 12.323 |
| 1369.9 | 12.354 |
| 1370.0 | 12.366 |
| 1370.1 | 12.377 |
| 1370.1 | 12.397 |
| 1370.3 | 12.414 |
| 1370.7 | 12.447 |
| 1370.8 | 12.46 |
| 1371.1 | 12.477 |
| 1371.3 | 12.486 |
| 1371.5 | 12.5 |
| 1371.7 | 12.511 |
| 1371.5 | 12.525 |
| 1371.7 | 12.543 |
| 1372.0 | 12.582 |
| 1372.5 | 12.606 |
| 1372.8 | 12.63 |
| 1373.1 | 12.637 |
| 1373.3 | 12.645 |
| 1373.6 | 12.652 |
| 1373.6 | 12.654 |
| 1373.8 | 12.653 |
| 1376.3 | 12.648 |
| 1381.1 | 12.56 |
| 1382.9 | 12.367 |
| 1379.8 | 11.933 |
| 1377.7 | 11.672 |
| 1376.4 | 11.497 |
| 1376.2 | 11.489 |
| 1376.4 | 11.508 |
| 1376.6 | 11.532 |
| 1377.0 | 11.561 |
| 1377.1 | 11.572 |
| 1377.1 | 11.581 |
| 1377.1 | 11.595 |
| 1377.4 | 11.62 |
| 1377.5 | 11.634 |
| 1377.7 | 11.645 |
| 1377.8 | 11.656 |
| 1377.7 | 11.669 |
| 1377.9 | 11.702 |
| 1378.2 | 11.724 |
| 1378.3 | 11.756 |
| 1378.5 | 11.773 |
| 1378.8 | 11.799 |
| 1378.8 | 11.817 |
| 1378.9 | 11.839 |
| 1379.0 | 11.856 |
| 1379.2 | 11.875 |
| 1379.4 | 11.905 |
| 1379.6 | 11.93 |
| 1379.7 | 11.948 |
| 1380.0 | 11.965 |
| 1380.2 | 11.99 |
| 1380.3 | 12.008 |
| 1380.3 | 12.033 |
| 1380.4 | 12.052 |
| 1380.8 | 12.093 |
| 1381.0 | 12.116 |
| 1381.4 | 12.138 |
| 1381.6 | 12.147 |
| 1381.9 | 12.157 |
| 1381.9 | 12.165 |
| 1381.9 | 12.181 |
| 1381.9 | 12.2 |
| 1382.0 | 12.222 |
| 1382.2 | 12.262 |
| 1382.5 | 12.286 |
| 1382.8 | 12.32 |
| 1383.0 | 12.342 |
| 1383.3 | 12.362 |
| 1383.4 | 12.374 |
| 1383.5 | 12.39 |
| 1383.5 | 12.405 |
| 1383.6 | 12.431 |
| 1383.9 | 12.452 |
| 1384.1 | 12.483 |
| 1384.5 | 12.506 |
| 1384.8 | 12.527 |
| 1385.1 | 12.533 |
| 1385.1 | 12.544 |
| 1385.2 | 12.554 |
| 1385.4 | 12.583 |
| 1385.8 | 12.603 |
| 1385.8 | 12.616 |
| 1386.3 | 12.628 |
| 1386.8 | 12.631 |
| 1391.1 | 12.592 |
| 1393.6 | 12.479 |
| 1393.0 | 12.164 |
| 1390.9 | 11.89 |
| 1389.1 | 11.65 |
| 1388.7 | 11.599 |
| 1388.7 | 11.603 |
| 1389.0 | 11.615 |
| 1389.1 | 11.638 |
| 1389.2 | 11.653 |
| 1389.3 | 11.675 |
| 1389.3 | 11.691 |
| 1389.5 | 11.714 |
| 1389.6 | 11.748 |
| 1389.7 | 11.767 |
| 1390.2 | 11.789 |
| 1390.4 | 11.799 |
| 1390.5 | 11.809 |
| 1390.5 | 11.811 |
| 1390.5 | 11.825 |
| 1390.9 | 11.845 |
| 1391.0 | 11.876 |
| 1391.0 | 11.893 |
| 1391.1 | 11.92 |
| 1391.2 | 11.944 |
| 1391.5 | 11.989 |
| 1391.8 | 12.019 |
| 1392.1 | 12.04 |
| 1392.1 | 12.058 |
| 1392.1 | 12.079 |
| 1392.3 | 12.103 |
| 1392.4 | 12.127 |
| 1392.9 | 12.159 |
| 1393.1 | 12.172 |
| 1393.1 | 12.188 |
| 1393.3 | 12.2 |
| 1393.5 | 12.224 |
| 1393.7 | 12.244 |
| 1393.8 | 12.268 |
| 1394.0 | 12.282 |
| 1394.4 | 12.305 |
| 1394.4 | 12.32 |
| 1394.6 | 12.336 |
| 1394.7 | 12.344 |
| 1394.8 | 12.362 |
| 1394.9 | 12.385 |
| 1395.2 | 12.406 |
| 1395.5 | 12.436 |
| 1395.6 | 12.452 |
| 1396.0 | 12.47 |
| 1396.1 | 12.483 |
| 1396.2 | 12.5 |
| 1396.2 | 12.513 |
| 1396.5 | 12.533 |
| 1396.6 | 12.553 |
| 1396.9 | 12.585 |
| 1397.3 | 12.605 |
| 1397.8 | 12.618 |
| 1397.9 | 12.62 |
| 1398.1 | 12.617 |
| 1398.2 | 12.622 |
| 1398.5 | 12.623 |
| 1398.6 | 12.625 |
| 1398.7 | 12.631 |
| 1399.0 | 12.647 |
| 1401.7 | 12.632 |
| 1406.7 | 12.526 |
| 1407.5 | 12.33 |
| 1404.2 | 11.856 |
| 1402.5 | 11.64 |
| 1401.3 | 11.53 |
| 1401.2 | 11.53 |
| 1401.3 | 11.561 |
| 1401.4 | 11.588 |
| 1401.7 | 11.618 |
| 1401.9 | 11.634 |
| 1402.2 | 11.659 |
| 1402.2 | 11.67 |
| 1402.4 | 11.689 |
| 1402.6 | 11.702 |
| 1402.8 | 11.712 |
| 1403.0 | 11.724 |
| 1403.1 | 11.731 |
| 1402.9 | 11.742 |
| 1402.9 | 11.756 |
| 1403.1 | 11.793 |
| 1403.3 | 11.821 |
| 1403.6 | 11.852 |
| 1403.7 | 11.873 |
| 1403.9 | 11.899 |
| 1404.1 | 11.916 |
| 1404.4 | 11.936 |
| 1404.5 | 11.948 |
| 1404.7 | 11.968 |
| 1404.8 | 11.987 |
| 1405.0 | 12.013 |
| 1405.1 | 12.029 |
| 1405.2 | 12.046 |
| 1405.5 | 12.069 |
| 1405.5 | 12.086 |
| 1405.7 | 12.11 |
| 1405.8 | 12.128 |
| 1406.0 | 12.167 |
| 1406.2 | 12.193 |
| 1406.5 | 12.224 |
| 1406.9 | 12.246 |
| 1407.1 | 12.267 |
| 1407.1 | 12.268 |
| 1407.1 | 12.28 |
| 1407.3 | 12.297 |
| 1407.4 | 12.328 |
| 1407.5 | 12.35 |
| 1407.9 | 12.372 |
| 1408.1 | 12.399 |
| 1408.2 | 12.413 |
| 1408.6 | 12.435 |
| 1408.6 | 12.447 |
| 1408.8 | 12.468 |
| 1408.9 | 12.479 |
| 1409.0 | 12.506 |
| 1409.3 | 12.525 |
| 1409.5 | 12.548 |
| 1409.9 | 12.56 |
| 1409.9 | 12.576 |
| 1410.0 | 12.59 |
| 1413.2 | 12.592 |
| 1416.9 | 12.553 |
| 1419.5 | 12.41 |
| 1417.2 | 11.947 |
| 1414.9 | 11.664 |
| 1413.0 | 11.463 |
| 1412.8 | 11.444 |
| 1412.8 | 11.467 |
| 1413.1 | 11.486 |
| 1413.3 | 11.508 |
| 1413.4 | 11.52 |
| 1413.6 | 11.533 |
| 1413.6 | 11.546 |
| 1413.8 | 11.565 |
| 1413.9 | 11.578 |
| 1414.0 | 11.598 |
| 1414.1 | 11.624 |
| 1414.4 | 11.643 |
| 1414.5 | 11.659 |
| 1414.5 | 11.674 |
| 1414.6 | 11.706 |
| 1414.9 | 11.73 |
| 1415.2 | 11.756 |
| 1415.3 | 11.766 |
| 1415.6 | 11.778 |
| 1415.6 | 11.787 |
| 1415.6 | 11.805 |
| 1415.8 | 11.822 |
| 1416.0 | 11.857 |
| 1416.2 | 11.876 |
| 1416.4 | 11.901 |
| 1416.5 | 11.919 |
| 1416.9 | 11.952 |
| 1417.0 | 11.964 |
| 1417.1 | 11.981 |
| 1417.2 | 11.995 |
| 1417.4 | 12.01 |
| 1417.5 | 12.035 |
| 1417.7 | 12.056 |
| 1417.9 | 12.081 |
| 1418.1 | 12.096 |
| 1418.2 | 12.118 |
| 1418.3 | 12.133 |
| 1418.5 | 12.157 |
| 1418.8 | 12.181 |
| 1419.1 | 12.208 |
| 1419.1 | 12.222 |
| 1419.4 | 12.237 |
| 1419.5 | 12.248 |
| 1419.6 | 12.265 |
| 1419.7 | 12.284 |
| 1419.8 | 12.307 |
| 1420.1 | 12.326 |
| 1420.2 | 12.345 |
| 1420.4 | 12.377 |
| 1420.7 | 12.393 |
| 1420.9 | 12.416 |
| 1421.0 | 12.433 |
| 1421.0 | 12.457 |
| 1421.1 | 12.47 |
| 1421.3 | 12.498 |
| 1421.6 | 12.52 |
| 1421.9 | 12.549 |
| 1422.2 | 12.569 |
| 1422.7 | 12.588 |
| 1422.9 | 12.592 |
| 1423.4 | 12.591 |
| 1423.4 | 12.586 |
| 1423.3 | 12.584 |
| 1423.4 | 12.591 |
| 1423.5 | 12.597 |
| 1423.8 | 12.623 |
| 1424.7 | 12.625 |
| 1431.7 | 12.584 |
| 1434.9 | 12.41 |
| 1432.4 | 11.844 |
| 1429.3 | 11.486 |
| 1427.0 | 11.222 |
| 1426.6 | 11.187 |
| 1426.7 | 11.215 |
| 1427.0 | 11.243 |
| 1427.1 | 11.271 |
| 1427.1 | 11.285 |
| 1427.3 | 11.308 |
| 1427.6 | 11.326 |
| 1427.6 | 11.349 |
| 1427.7 | 11.36 |
| 1427.8 | 11.374 |
| 1428.0 | 11.403 |
| 1428.2 | 11.417 |
| 1428.3 | 11.429 |
| 1428.4 | 11.444 |
| 1428.5 | 11.469 |
| 1428.6 | 11.487 |
| 1428.9 | 11.515 |
| 1429.1 | 11.532 |
| 1429.1 | 11.556 |
| 1429.1 | 11.573 |
| 1429.5 | 11.605 |
| 1429.7 | 11.627 |
| 1429.8 | 11.653 |
| 1429.9 | 11.664 |
| 1430.2 | 11.681 |
| 1430.3 | 11.697 |
| 1430.3 | 11.709 |
| 1430.5 | 11.73 |
| 1430.6 | 11.749 |
| 1431.0 | 11.776 |
| 1431.1 | 11.793 |
| 1431.2 | 11.816 |
| 1431.2 | 11.83 |
| 1431.6 | 11.861 |
| 1431.6 | 11.878 |
| 1431.8 | 11.907 |
| 1432.0 | 11.926 |
| 1432.2 | 11.949 |
| 1432.4 | 11.962 |
| 1432.5 | 11.981 |
| 1432.8 | 12.007 |
| 1432.8 | 12.019 |
| 1433.0 | 12.039 |
| 1433.1 | 12.058 |
| 1433.3 | 12.08 |
| 1433.4 | 12.103 |
| 1433.8 | 12.13 |
| 1434.1 | 12.151 |
| 1434.3 | 12.173 |
| 1434.3 | 12.184 |
| 1434.4 | 12.201 |
| 1434.6 | 12.217 |
| 1434.7 | 12.245 |
| 1434.9 | 12.264 |
| 1435.0 | 12.281 |
| 1435.4 | 12.308 |
| 1435.6 | 12.334 |
| 1435.7 | 12.348 |
| 1435.9 | 12.362 |
| 1436.3 | 12.382 |
| 1436.5 | 12.393 |
| 1436.6 | 12.406 |
| 1436.6 | 12.416 |
| 1436.7 | 12.434 |
| 1436.8 | 12.448 |
| 1437.1 | 12.477 |
| 1437.2 | 12.496 |
| 1437.5 | 12.521 |
| 1437.6 | 12.536 |
| 1437.9 | 12.554 |
| 1438.2 | 12.573 |
| 1439.1 | 12.59 |
| 1442.3 | 12.574 |
| 1445.7 | 12.511 |
| 1447.5 | 12.183 |
| 1445.0 | 11.851 |
| 1441.4 | 11.504 |
| 1440.7 | 11.41 |
| 1440.9 | 11.414 |
| 1441.0 | 11.437 |
| 1441.2 | 11.467 |
| 1441.3 | 11.485 |
| 1441.8 | 11.508 |
| 1441.9 | 11.513 |
| 1442.0 | 11.518 |
| 1441.8 | 11.523 |
| 1442.0 | 11.544 |
| 1442.2 | 11.566 |
| 1442.4 | 11.596 |
| 1442.5 | 11.611 |
| 1442.6 | 11.624 |
| 1442.9 | 11.646 |
| 1442.9 | 11.658 |
| 1443.1 | 11.679 |
| 1443.1 | 11.697 |
| 1443.3 | 11.73 |
| 1443.5 | 11.748 |
| 1443.7 | 11.778 |
| 1443.8 | 11.794 |
| 1444.2 | 11.823 |
| 1444.3 | 11.84 |
| 1444.4 | 11.856 |
| 1444.5 | 11.867 |
| 1444.5 | 11.88 |
| 1444.7 | 11.905 |
| 1444.9 | 11.919 |
| 1445.0 | 11.95 |
| 1445.2 | 11.967 |
| 1445.5 | 11.993 |
| 1445.7 | 12.016 |
| 1446.0 | 12.031 |
| 1446.0 | 12.044 |
| 1446.1 | 12.067 |
| 1446.1 | 12.087 |
| 1446.3 | 12.119 |
| 1446.6 | 12.145 |
| 1446.8 | 12.182 |
| 1447.0 | 12.201 |
| 1447.4 | 12.225 |
| 1447.4 | 12.237 |
| 1447.5 | 12.251 |
| 1447.7 | 12.275 |
| 1447.9 | 12.292 |
| 1448.2 | 12.314 |
| 1448.3 | 12.33 |
| 1448.6 | 12.348 |
| 1448.6 | 12.357 |
| 1448.8 | 12.374 |
| 1448.8 | 12.385 |
| 1448.9 | 12.413 |
| 1449.2 | 12.428 |
| 1449.5 | 12.456 |
| 1449.9 | 12.473 |
| 1450.0 | 12.486 |
| 1450.0 | 12.492 |
| 1450.1 | 12.503 |
| 1450.3 | 12.522 |
| 1450.7 | 12.546 |
| 1450.9 | 12.561 |
| 1452.1 | 12.562 |
| 1457.7 | 12.511 |
| 1460.0 | 12.359 |
| 1457.7 | 11.899 |
| 1455.5 | 11.627 |
| 1453.4 | 11.434 |
| 1453.3 | 11.416 |
| 1453.6 | 11.446 |
| 1453.8 | 11.469 |
| 1454.0 | 11.491 |
| 1454.1 | 11.501 |
| 1454.3 | 11.512 |
| 1454.1 | 11.524 |
| 1454.3 | 11.543 |
| 1454.5 | 11.565 |
| 1454.7 | 11.587 |
| 1454.7 | 11.613 |
| 1454.7 | 11.629 |
| 1455.1 | 11.656 |
| 1455.3 | 11.676 |
| 1455.5 | 11.702 |
| 1455.5 | 11.716 |
| 1455.8 | 11.742 |
| 1456.0 | 11.759 |
| 1456.3 | 11.777 |
| 1456.3 | 11.786 |
| 1456.4 | 11.801 |
| 1456.5 | 11.812 |
| 1456.6 | 11.835 |
| 1456.8 | 11.847 |
| 1456.9 | 11.863 |
| 1457.1 | 11.885 |
| 1457.2 | 11.893 |
| 1457.2 | 11.919 |
| 1457.4 | 11.941 |
| 1457.7 | 11.976 |
| 1457.9 | 12 |
| 1458.2 | 12.029 |
| 1458.3 | 12.044 |
| 1458.5 | 12.063 |
| 1458.5 | 12.078 |
| 1458.8 | 12.103 |
| 1458.9 | 12.122 |
| 1459.0 | 12.15 |
| 1459.1 | 12.168 |
| 1459.5 | 12.205 |
| 1459.6 | 12.223 |
| 1459.8 | 12.241 |
| 1460.0 | 12.254 |
| 1460.1 | 12.274 |
| 1460.3 | 12.299 |
| 1460.6 | 12.317 |
| 1460.8 | 12.338 |
| 1460.9 | 12.355 |
| 1461.2 | 12.37 |
| 1461.2 | 12.383 |
| 1461.3 | 12.4 |
| 1461.5 | 12.416 |
| 1461.9 | 12.443 |
| 1461.9 | 12.458 |
| 1461.9 | 12.474 |
| 1462.0 | 12.493 |
| 1462.1 | 12.52 |
| 1463.4 | 12.553 |
| 1467.2 | 12.55 |
| 1472.1 | 12.388 |
| 1471.1 | 12.12 |
| 1467.4 | 11.612 |
| 1465.8 | 11.432 |
| 1465.1 | 11.376 |
| 1465.3 | 11.393 |
| 1465.5 | 11.429 |
| 1465.7 | 11.446 |
| 1465.9 | 11.461 |
| 1465.9 | 11.47 |
| 1465.9 | 11.491 |
| 1466.1 | 11.509 |
| 1466.4 | 11.538 |
| 1466.6 | 11.554 |
| 1466.7 | 11.569 |
| 1467.1 | 11.584 |
| 1467.1 | 11.59 |
| 1467.1 | 11.598 |
| 1467.2 | 11.607 |
| 1467.2 | 11.628 |
| 1467.3 | 11.645 |
| 1467.4 | 11.67 |
| 1467.7 | 11.697 |
| 1467.8 | 11.731 |
| 1468.0 | 11.75 |
| 1468.4 | 11.776 |
| 1468.4 | 11.794 |
| 1468.6 | 11.817 |
| 1468.6 | 11.832 |
| 1468.9 | 11.858 |
| 1469.1 | 11.876 |
| 1469.2 | 11.892 |
| 1469.3 | 11.914 |
| 1469.5 | 11.93 |
| 1469.8 | 11.956 |
| 1469.9 | 11.968 |
| 1470.1 | 11.99 |
| 1470.3 | 12.005 |
| 1470.4 | 12.03 |
| 1470.6 | 12.046 |
| 1470.8 | 12.071 |
| 1471.0 | 12.086 |
| 1471.1 | 12.108 |
| 1471.2 | 12.121 |
| 1471.4 | 12.148 |
| 1471.6 | 12.167 |
| 1471.7 | 12.193 |
| 1471.8 | 12.211 |
| 1472.1 | 12.241 |
| 1472.2 | 12.262 |
| 1472.4 | 12.281 |
| 1472.7 | 12.304 |
| 1472.8 | 12.315 |
| 1472.9 | 12.332 |
| 1473.1 | 12.355 |
| 1473.1 | 12.378 |
| 1473.4 | 12.396 |
| 1473.7 | 12.426 |
| 1473.9 | 12.443 |
| 1474.1 | 12.458 |
| 1474.2 | 12.469 |
| 1474.3 | 12.485 |
| 1474.6 | 12.497 |
| 1474.9 | 12.515 |
| 1475.2 | 12.531 |
| 1475.0 | 12.536 |
| 1475.3 | 12.555 |
| 1476.1 | 12.562 |
| 1482.0 | 12.531 |
| 1484.7 | 12.385 |
| 1482.8 | 11.922 |
| 1480.5 | 11.627 |
| 1478.5 | 11.405 |
| 1478.0 | 11.37 |
| 1478.1 | 11.384 |
| 1478.4 | 11.405 |
| 1478.6 | 11.433 |
| 1478.7 | 11.445 |
| 1478.7 | 11.467 |
| 1478.8 | 11.481 |
| 1478.8 | 11.497 |
| 1479.0 | 11.521 |
| 1479.1 | 11.541 |
| 1479.3 | 11.57 |
| 1479.4 | 11.598 |
| 1479.8 | 11.651 |
| 1480.1 | 11.689 |
| 1480.4 | 11.715 |
| 1480.6 | 11.721 |
| 1480.6 | 11.726 |
| 1480.6 | 11.737 |
| 1480.9 | 11.773 |
| 1481.0 | 11.804 |
| 1481.2 | 11.84 |
| 1481.3 | 11.863 |
| 1481.6 | 11.893 |
| 1481.8 | 11.93 |
| 1481.9 | 11.943 |
| 1482.0 | 11.962 |
| 1482.2 | 11.979 |
| 1482.4 | 12.015 |
| 1482.6 | 12.035 |
| 1482.9 | 12.062 |
| 1483.1 | 12.076 |
| 1483.3 | 12.094 |
| 1483.5 | 12.102 |
| 1483.7 | 12.116 |
| 1483.8 | 12.122 |
| 1483.8 | 12.137 |
| 1484.1 | 12.157 |
| 1484.3 | 12.189 |
| 1484.4 | 12.212 |
| 1484.7 | 12.23 |
| 1484.8 | 12.251 |
| 1485.0 | 12.264 |
| 1485.2 | 12.281 |
| 1485.4 | 12.292 |
| 1485.4 | 12.307 |
| 1485.5 | 12.332 |
| 1486.1 | 12.372 |
| 1486.4 | 12.388 |
| 1486.4 | 12.384 |
| 1486.3 | 12.382 |
| 1486.4 | 12.399 |
| 1486.8 | 12.429 |
| 1487.0 | 12.46 |
| 1487.0 | 12.47 |
| 1486.9 | 12.477 |
| 1487.4 | 12.521 |
| 1488.2 | 12.569 |
| 1489.9 | 12.546 |
| 1492.4 | 12.464 |
| 1493.1 | 12.086 |
| 1490.1 | 11.706 |
| 1487.6 | 11.36 |
| 1488.0 | 11.445 |
| 1489.8 | 11.67 |
| 1490.1 | 11.738 |
| 1490.0 | 11.715 |
| 1489.9 | 11.702 |
| 1490.1 | 11.73 |
| 1490.3 | 11.755 |
| 1490.5 | 11.782 |
| 1490.6 | 11.801 |
| 1490.9 | 11.85 |
| 1491.1 | 11.879 |
| 1491.3 | 11.904 |
| 1491.7 | 11.921 |
| 1491.8 | 11.922 |
| 1491.7 | 11.914 |
| 1491.7 | 11.926 |
| 1492.1 | 11.989 |
| 1492.5 | 12.023 |
| 1492.7 | 12.03 |
| 1492.6 | 12.017 |
| 1492.7 | 12.033 |
| 1493.0 | 12.062 |
| 1493.3 | 12.097 |
| 1493.4 | 12.108 |
| 1493.3 | 12.12 |
| 1493.6 | 12.157 |
| 1493.7 | 12.199 |
| 1494.3 | 12.256 |
| 1494.5 | 12.265 |
| 1494.5 | 12.257 |
| 1494.5 | 12.263 |
| 1494.9 | 12.282 |
| 1494.9 | 12.303 |
| 1495.2 | 12.34 |
| 1495.5 | 12.36 |
| 1495.8 | 12.363 |
| 1495.7 | 12.359 |
| 1495.7 | 12.367 |
| 1495.9 | 12.399 |
| 1496.5 | 12.445 |
| 1496.8 | 12.454 |
| 1496.6 | 12.436 |
| 1496.6 | 12.437 |
| 1497.0 | 12.473 |
| 1497.5 | 12.509 |
| 1498.7 | 12.513 |
| 1500.7 | 12.36 |
| 1500.4 | 12.069 |
| 1497.0 | 11.623 |
| 1496.6 | 11.546 |
| 1498.9 | 11.867 |
| 1500.1 | 12.001 |
| 1499.1 | 11.87 |
| 1498.3 | 11.766 |
| 1498.9 | 11.868 |
| 1499.8 | 11.983 |
| 1500.1 | 12.006 |
| 1499.6 | 11.952 |
| 1499.7 | 11.948 |
| 1500.1 | 12.004 |
| 1500.3 | 12.048 |
| 1500.6 | 12.069 |
| 1500.6 | 12.08 |
| 1500.7 | 12.104 |
| 1500.7 | 12.124 |
| 1501.2 | 12.177 |
| 1501.4 | 12.212 |
| 1501.7 | 12.229 |
| 1501.9 | 12.223 |
| 1501.7 | 12.213 |
| 1501.9 | 12.225 |
| 1502.2 | 12.28 |
| 1502.5 | 12.316 |
| 1502.6 | 12.332 |
| 1502.7 | 12.339 |
| 1502.8 | 12.356 |
| 1503.0 | 12.4 |
| 1503.4 | 12.424 |
| 1503.8 | 12.436 |
| 1503.8 | 12.423 |
| 1503.6 | 12.419 |
| 1503.9 | 12.443 |
| 1504.2 | 12.485 |
| 1504.4 | 12.499 |
| 1504.7 | 12.523 |
| 1505.2 | 12.528 |
| 1505.4 | 12.505 |
| 1505.3 | 12.473 |
| 1505.2 | 12.454 |
| 1505.3 | 12.477 |
| 1505.9 | 12.515 |
| 1511.0 | 12.475 |
| 1511.8 | 12.125 |
| 1506.5 | 11.097 |
| 1502.8 | 10.724 |
| 1506.0 | 11.161 |
| 1509.7 | 11.656 |
| 1509.6 | 11.588 |
| 1506.6 | 11.21 |
| 1505.9 | 11.158 |
| 1508.3 | 11.449 |
| 1509.8 | 11.675 |
| 1509.0 | 11.517 |
| 1507.6 | 11.342 |
| 1508.0 | 11.41 |
| 1509.3 | 11.618 |
| 1509.6 | 11.64 |
| 1509.2 | 11.593 |
| 1509.0 | 11.565 |
| 1509.3 | 11.615 |
| 1509.9 | 11.707 |
| 1509.9 | 11.712 |
| 1509.8 | 11.709 |
| 1510.2 | 11.737 |
| 1510.6 | 11.787 |
| 1510.6 | 11.789 |
| 1510.6 | 11.782 |
| 1510.8 | 11.799 |
| 1511.2 | 11.852 |
| 1511.4 | 11.869 |
| 1511.4 | 11.869 |
| 1511.5 | 11.885 |
| 1511.8 | 11.912 |
| 1512.1 | 11.947 |
| 1512.1 | 11.944 |
| 1512.2 | 11.958 |
| 1512.4 | 11.988 |
| 1512.7 | 12.03 |
| 1512.8 | 12.044 |
| 1513.1 | 12.073 |
| 1513.3 | 12.086 |
| 1513.4 | 12.102 |
| 1513.5 | 12.115 |
| 1513.9 | 12.149 |
| 1514.1 | 12.173 |
| 1514.2 | 12.189 |
| 1514.3 | 12.183 |
| 1514.4 | 12.196 |
| 1514.4 | 12.219 |
| 1514.6 | 12.242 |
| 1515.0 | 12.304 |
| 1515.5 | 12.33 |
| 1515.5 | 12.313 |
| 1515.4 | 12.299 |
| 1515.5 | 12.325 |
| 1515.9 | 12.37 |
| 1516.5 | 12.408 |
| 1516.6 | 12.407 |
| 1516.6 | 12.38 |
| 1516.6 | 12.372 |
| 1516.8 | 12.391 |
| 1516.9 | 12.42 |
| 1517.2 | 12.462 |
| 1517.3 | 12.486 |
| 1518.0 | 12.503 |
| 1523.0 | 12.424 |
| 1523.7 | 12.048 |
| 1517.8 | 11.002 |
| 1514.4 | 10.68 |
| 1518.4 | 11.172 |
| 1522.0 | 11.65 |
| 1521.0 | 11.454 |
| 1517.9 | 11.067 |
| 1517.8 | 11.097 |
| 1520.5 | 11.444 |
| 1521.9 | 11.624 |
| 1520.3 | 11.399 |
| 1518.7 | 11.25 |
| 1520.1 | 11.405 |
| 1521.6 | 11.595 |
| 1521.7 | 11.586 |
| 1520.6 | 11.456 |
| 1520.4 | 11.457 |
| 1521.4 | 11.576 |
| 1522.3 | 11.681 |
| 1521.9 | 11.62 |
| 1521.3 | 11.56 |
| 1521.8 | 11.613 |
| 1522.4 | 11.73 |
| 1522.6 | 11.736 |
| 1522.5 | 11.715 |
| 1522.6 | 11.73 |
| 1523.0 | 11.778 |
| 1523.2 | 11.794 |
| 1523.2 | 11.801 |
| 1523.3 | 11.811 |
| 1523.5 | 11.829 |
| 1523.8 | 11.878 |
| 1523.9 | 11.898 |
| 1524.2 | 11.908 |
| 1524.3 | 11.92 |
| 1524.4 | 11.941 |
| 1524.5 | 11.964 |
| 1525.0 | 12.004 |
| 1525.1 | 12.023 |
| 1525.2 | 12.034 |
| 1525.1 | 12.04 |
| 1525.7 | 12.084 |
| 1526.0 | 12.114 |
| 1526.0 | 12.116 |
| 1526.0 | 12.113 |
| 1526.3 | 12.145 |
| 1526.6 | 12.181 |
| 1526.9 | 12.199 |
| 1526.8 | 12.195 |
| 1526.9 | 12.199 |
| 1527.3 | 12.229 |
| 1527.5 | 12.257 |
| 1527.6 | 12.276 |
| 1527.7 | 12.284 |
| 1528.2 | 12.308 |
| 1528.2 | 12.304 |
| 1528.0 | 12.299 |
| 1528.2 | 12.326 |
| 1529.2 | 12.388 |
| 1529.9 | 12.399 |
| 1530.1 | 12.339 |
| 1529.4 | 12.167 |
| 1528.7 | 12.113 |
| 1529.4 | 12.201 |
| 1530.4 | 12.297 |
| 1530.6 | 12.3 |
| 1530.1 | 12.236 |
| 1530.0 | 12.227 |
| 1530.5 | 12.286 |
| 1531.1 | 12.366 |
| 1531.1 | 12.361 |
| 1530.9 | 12.345 |
| 1530.9 | 12.36 |
| 1531.4 | 12.426 |
| 1532.6 | 12.442 |
| 1537.8 | 12.293 |
| 1537.8 | 11.8 |
| 1530.8 | 10.66 |
| 1528.1 | 10.426 |
| 1530.6 | 10.817 |
| 1536.4 | 11.495 |
| 1535.8 | 11.445 |
| 1531.9 | 10.859 |
| 1531.5 | 10.849 |
| 1534.7 | 11.239 |
| 1535.7 | 11.397 |
| 1534.3 | 11.18 |
| 1533.2 | 11.071 |
| 1534.1 | 11.221 |
| 1535.3 | 11.387 |
| 1535.6 | 11.404 |
| 1534.9 | 11.317 |
| 1534.6 | 11.307 |
| 1535.3 | 11.393 |
| 1535.9 | 11.48 |
| 1536.2 | 11.485 |
| 1535.8 | 11.447 |
| 1535.7 | 11.449 |
| 1536.2 | 11.506 |
| 1536.9 | 11.576 |
| 1536.8 | 11.561 |
| 1536.5 | 11.527 |
| 1536.5 | 11.541 |
| 1537.1 | 11.645 |
| 1537.6 | 11.685 |
| 1537.5 | 11.679 |
| 1537.5 | 11.672 |
| 1537.7 | 11.718 |
| 1538.1 | 11.765 |
| 1538.2 | 11.795 |
| 1538.5 | 11.81 |
| 1538.4 | 11.799 |
| 1538.5 | 11.809 |
| 1538.8 | 11.841 |
| 1539.1 | 11.881 |
| 1539.3 | 11.887 |
| 1539.4 | 11.898 |
| 1539.5 | 11.92 |
| 1540.0 | 11.949 |
| 1540.2 | 11.96 |
| 1540.1 | 11.954 |
| 1540.2 | 11.962 |
| 1540.6 | 12.002 |
| 1540.8 | 12.044 |
| 1540.9 | 12.063 |
| 1540.9 | 12.068 |
| 1541.0 | 12.088 |
| 1541.5 | 12.134 |
| 1542.0 | 12.161 |
| 1541.9 | 12.145 |
| 1541.7 | 12.13 |
| 1542.0 | 12.166 |
| 1542.5 | 12.222 |
| 1542.8 | 12.258 |
| 1542.9 | 12.236 |
| 1542.8 | 12.211 |
| 1542.8 | 12.229 |
| 1543.2 | 12.29 |
| 1543.6 | 12.33 |
| 1544.5 | 12.334 |
| 1544.4 | 12.271 |
| 1543.9 | 12.207 |
| 1543.8 | 12.196 |
| 1544.2 | 12.259 |
| 1545.2 | 12.327 |
| 1544.9 | 12.31 |
| 1544.6 | 12.269 |
| 1544.8 | 12.296 |
| 1548.5 | 12.366 |
| 1551.0 | 12.212 |
| 1548.2 | 11.106 |
| 1542.0 | 10.356 |
| 1542.6 | 10.517 |
| 1552.2 | 11.354 |
| 1557.1 | 11.113 |
| 1566.2 | 11.418 |
| 1573.7 | 10.414 |
| 1581.9 | 10.283 |
| 1583.6 | 10.388 |
| 1583.9 | 10.402 |
| 1584.1 | 10.414 |
| 1584.2 | 10.421 |
| 1584.4 | 10.425 |
| 1584.4 | 10.428 |
| 1584.6 | 10.439 |
| 1584.6 | 10.447 |
| 1585.0 | 10.456 |
| 1585.0 | 10.462 |
| 1585.0 | 10.467 |
| 1585.1 | 10.481 |
| 1585.1 | 10.484 |
| 1585.2 | 10.497 |
| 1585.3 | 10.505 |
| 1585.4 | 10.517 |
| 1585.5 | 10.517 |
| 1585.7 | 10.522 |
| 1585.7 | 10.523 |
| 1585.7 | 10.529 |
| 1585.8 | 10.531 |
| 1586.0 | 10.541 |
| 1586.0 | 10.545 |
| 1586.0 | 10.553 |
| 1586.0 | 10.557 |
| 1586.1 | 10.568 |
| 1586.3 | 10.573 |
| 1586.3 | 10.579 |
| 1586.4 | 10.592 |
| 1586.5 | 10.6 |
| 1586.6 | 10.605 |
| 1586.6 | 10.61 |
| 1586.6 | 10.614 |
| 1586.7 | 10.621 |
| 1586.7 | 10.625 |
| 1586.8 | 10.628 |
| 1587.1 | 10.638 |
| 1587.1 | 10.642 |
| 1587.3 | 10.647 |
| 1587.3 | 10.65 |
| 1587.2 | 10.656 |
| 1587.3 | 10.662 |
| 1587.4 | 10.667 |
| 1587.7 | 10.678 |
| 1587.8 | 10.683 |
| 1587.9 | 10.687 |
| 1587.8 | 10.685 |
| 1587.9 | 10.688 |
| 1587.9 | 10.69 |
| 1588.0 | 10.699 |
| 1588.2 | 10.7 |
| 1588.4 | 10.702 |
| 1588.5 | 10.705 |
| 1588.5 | 10.706 |
| 1588.5 | 10.706 |
| 1588.6 | 10.713 |
| 1588.7 | 10.72 |
| 1588.6 | 10.726 |
| 1588.9 | 10.743 |
| 1589.1 | 10.754 |
| 1589.3 | 10.768 |
| 1589.3 | 10.77 |
| 1589.5 | 10.782 |
| 1589.6 | 10.79 |
| 1589.8 | 10.804 |
| 1589.9 | 10.813 |
| 1590.2 | 10.834 |
| 1590.5 | 10.843 |
| 1590.6 | 10.856 |
| 1590.9 | 10.865 |
| 1591.4 | 10.876 |
| 1591.6 | 10.877 |
| 1591.6 | 10.874 |
| 1591.6 | 10.873 |
| 1591.6 | 10.878 |
| 1591.7 | 10.884 |
| 1591.8 | 10.89 |
| 1591.8 | 10.902 |
| 1592.0 | 10.918 |
| 1592.3 | 10.942 |
| 1592.4 | 10.957 |
| 1592.5 | 10.972 |
| 1592.8 | 10.987 |
| 1593.1 | 11.003 |
| 1593.4 | 11.011 |
| 1593.9 | 11.016 |
| 1594.1 | 11.021 |
| 1593.9 | 11.021 |
| 1593.9 | 11.026 |
| 1594.2 | 11.033 |
| 1594.4 | 11.04 |
| 1594.3 | 11.045 |
| 1594.4 | 11.055 |
| 1594.7 | 11.065 |
| 1594.9 | 11.082 |
| 1595.2 | 11.091 |
| 1595.3 | 11.105 |
| 1595.4 | 11.111 |
| 1595.4 | 11.122 |
| 1595.5 | 11.134 |
| 1596.1 | 11.154 |
| 1596.6 | 11.16 |
| 1597.1 | 11.159 |
| 1597.2 | 11.155 |
| 1597.2 | 11.147 |
| 1597.2 | 11.142 |
| 1597.4 | 11.145 |
| 1597.3 | 11.147 |
| 1597.4 | 11.148 |
| 1597.5 | 11.16 |
| 1597.5 | 11.17 |
| 1597.9 | 11.185 |
| 1597.9 | 11.194 |
| 1598.1 | 11.215 |
| 1598.2 | 11.224 |
| 1598.4 | 11.235 |
| 1598.6 | 11.238 |
| 1599.2 | 11.248 |
| 1600.0 | 11.25 |
| 1601.6 | 11.233 |
| 1602.2 | 11.204 |
| 1601.8 | 11.146 |
| 1601.6 | 11.117 |
| 1601.6 | 11.094 |
| 1601.3 | 11.077 |
| 1601.2 | 11.075 |
| 1601.2 | 11.078 |
| 1601.2 | 11.083 |
| 1601.2 | 11.095 |
| 1601.4 | 11.105 |
| 1601.7 | 11.114 |
| 1601.7 | 11.122 |
| 1601.8 | 11.132 |
| 1601.9 | 11.142 |
| 1602.0 | 11.159 |
| 1602.0 | 11.166 |
| 1602.2 | 11.181 |
| 1602.4 | 11.194 |
| 1602.5 | 11.204 |
| 1602.6 | 11.222 |
| 1602.6 | 11.235 |
| 1602.8 | 11.249 |
| 1602.9 | 11.264 |
| 1603.3 | 11.286 |
| 1603.6 | 11.296 |
| 1603.8 | 11.306 |
| 1604.1 | 11.309 |
| 1604.1 | 11.315 |
| 1604.1 | 11.321 |
| 1604.2 | 11.332 |
| 1604.3 | 11.342 |
| 1604.7 | 11.363 |
| 1605.0 | 11.369 |
| 1609.2 | 11.357 |
| 1612.2 | 11.315 |
| 1613.7 | 11.151 |
| 1612.7 | 10.999 |
| 1611.7 | 10.863 |
| 1610.4 | 10.726 |
| 1609.8 | 10.668 |
| 1609.3 | 10.611 |
| 1609.2 | 10.598 |
| 1609.2 | 10.587 |
| 1609.0 | 10.588 |
| 1609.2 | 10.594 |
| 1609.2 | 10.598 |
| 1609.3 | 10.604 |
| 1609.3 | 10.611 |
| 1609.4 | 10.625 |
| 1609.3 | 10.636 |
| 1609.5 | 10.645 |
| 1609.6 | 10.656 |
| 1609.9 | 10.666 |
| 1609.8 | 10.677 |
| 1609.9 | 10.684 |
| 1610.0 | 10.703 |
| 1610.0 | 10.714 |
| 1610.2 | 10.736 |
| 1610.4 | 10.746 |
| 1610.6 | 10.769 |
| 1610.7 | 10.783 |
| 1610.8 | 10.805 |
| 1610.8 | 10.815 |
| 1611.1 | 10.833 |
| 1611.2 | 10.846 |
| 1611.4 | 10.865 |
| 1611.5 | 10.872 |
| 1611.7 | 10.883 |
| 1611.7 | 10.897 |
| 1611.9 | 10.908 |
| 1612.0 | 10.93 |
| 1612.1 | 10.942 |
| 1612.2 | 10.957 |
| 1612.4 | 10.966 |
| 1612.5 | 10.983 |
| 1612.6 | 10.997 |
| 1612.6 | 11.012 |
| 1612.7 | 11.025 |
| 1612.8 | 11.048 |
| 1613.0 | 11.066 |
| 1613.3 | 11.086 |
| 1613.4 | 11.098 |
| 1613.4 | 11.117 |
| 1613.4 | 11.134 |
| 1613.6 | 11.149 |
| 1613.9 | 11.172 |
| 1614.1 | 11.194 |
| 1614.4 | 11.216 |
| 1614.6 | 11.226 |
| 1614.9 | 11.234 |
| 1614.9 | 11.24 |
| 1614.9 | 11.255 |
| 1615.0 | 11.263 |
| 1615.1 | 11.283 |
| 1615.2 | 11.296 |
| 1615.6 | 11.313 |
| 1615.7 | 11.325 |
| 1615.9 | 11.341 |
| 1616.0 | 11.351 |
| 1616.3 | 11.359 |
| 1616.6 | 11.37 |
| 1616.9 | 11.377 |
| 1617.0 | 11.384 |
| 1617.1 | 11.386 |
| 1617.2 | 11.392 |
| 1617.2 | 11.397 |
| 1617.4 | 11.411 |
| 1617.5 | 11.418 |
| 1617.6 | 11.439 |
| 1617.8 | 11.454 |
| 1620.8 | 11.454 |
| 1624.1 | 11.43 |
| 1627.0 | 11.304 |
| 1626.1 | 11.16 |
| 1624.5 | 10.969 |
| 1623.8 | 10.873 |
| 1623.1 | 10.781 |
| 1622.8 | 10.747 |
| 1622.7 | 10.725 |
| 1622.5 | 10.707 |
| 1622.3 | 10.7 |
| 1622.5 | 10.701 |
| 1622.5 | 10.707 |
| 1622.6 | 10.714 |
| 1622.6 | 10.723 |
| 1622.6 | 10.736 |
| 1622.7 | 10.746 |
| 1622.7 | 10.762 |
| 1622.8 | 10.777 |
| 1623.1 | 10.798 |
| 1623.2 | 10.808 |
| 1623.2 | 10.822 |
| 1623.3 | 10.837 |
| 1623.5 | 10.849 |
| 1623.8 | 10.863 |
| 1623.8 | 10.869 |
| 1624.0 | 10.883 |
| 1624.0 | 10.891 |
| 1624.1 | 10.906 |
| 1624.2 | 10.914 |
| 1624.2 | 10.934 |
| 1624.4 | 10.945 |
| 1624.5 | 10.97 |
| 1624.6 | 10.986 |
| 1625.0 | 11.004 |
| 1625.1 | 11.011 |
| 1625.2 | 11.022 |
| 1625.2 | 11.029 |
| 1625.2 | 11.042 |
| 1625.3 | 11.057 |
| 1625.4 | 11.071 |
| 1625.7 | 11.091 |
| 1625.8 | 11.106 |
| 1625.9 | 11.124 |
| 1626.0 | 11.138 |
| 1626.3 | 11.164 |
| 1626.4 | 11.18 |
| 1626.6 | 11.197 |
| 1626.8 | 11.209 |
| 1626.8 | 11.223 |
| 1627.0 | 11.234 |
| 1627.0 | 11.248 |
| 1627.1 | 11.266 |
| 1627.4 | 11.286 |
| 1627.6 | 11.3 |
| 1627.7 | 11.311 |
| 1627.8 | 11.329 |
| 1628.0 | 11.342 |
| 1628.3 | 11.36 |
| 1628.5 | 11.371 |
| 1628.5 | 11.382 |
| 1628.6 | 11.39 |
| 1628.7 | 11.407 |
| 1628.7 | 11.416 |
| 1629.1 | 11.435 |
| 1629.2 | 11.451 |
| 1629.5 | 11.474 |
| 1629.7 | 11.481 |
| 1629.9 | 11.496 |
| 1630.2 | 11.509 |
| 1630.2 | 11.517 |
| 1630.3 | 11.531 |
| 1632.4 | 11.537 |
| 1636.1 | 11.53 |
| 1639.3 | 11.475 |
| 1640.3 | 11.269 |
| 1639.0 | 11.1 |
| 1637.2 | 10.914 |
| 1636.5 | 10.826 |
| 1635.9 | 10.75 |
| 1635.6 | 10.723 |
| 1635.6 | 10.706 |
| 1635.6 | 10.696 |
| 1635.6 | 10.695 |
| 1635.6 | 10.696 |
| 1635.6 | 10.701 |
| 1635.5 | 10.702 |
| 1635.5 | 10.719 |
| 1635.6 | 10.734 |
| 1635.8 | 10.746 |
| 1635.9 | 10.76 |
| 1636.0 | 10.771 |
| 1636.2 | 10.791 |
| 1636.3 | 10.806 |
| 1636.3 | 10.819 |
| 1636.5 | 10.831 |
| 1636.6 | 10.851 |
| 1636.7 | 10.871 |
| 1636.8 | 10.888 |
| 1636.8 | 10.903 |
| 1636.9 | 10.925 |
| 1637.3 | 10.943 |
| 1637.4 | 10.96 |
| 1637.4 | 10.972 |
| 1637.7 | 10.98 |
| 1637.8 | 10.998 |
| 1637.9 | 11.008 |
| 1638.0 | 11.022 |
| 1638.0 | 11.033 |
| 1638.2 | 11.057 |
| 1638.4 | 11.068 |
| 1638.5 | 11.089 |
| 1638.5 | 11.105 |
| 1638.7 | 11.13 |
| 1639.0 | 11.145 |
| 1639.2 | 11.166 |
| 1639.3 | 11.181 |
| 1639.3 | 11.204 |
| 1639.6 | 11.215 |
| 1639.7 | 11.227 |
| 1639.8 | 11.246 |
| 1639.8 | 11.258 |
| 1640.1 | 11.278 |
| 1640.1 | 11.289 |
| 1640.4 | 11.309 |
| 1640.5 | 11.32 |
| 1640.6 | 11.341 |
| 1640.7 | 11.355 |
| 1641.0 | 11.374 |
| 1641.1 | 11.383 |
| 1641.2 | 11.4 |
| 1641.3 | 11.414 |
| 1641.5 | 11.432 |
| 1641.5 | 11.44 |
| 1641.6 | 11.463 |
| 1641.8 | 11.48 |
| 1642.0 | 11.495 |
| 1642.3 | 11.512 |
| 1642.4 | 11.524 |
| 1642.6 | 11.538 |
| 1642.9 | 11.552 |
| 1643.1 | 11.566 |
| 1643.2 | 11.58 |
| 1643.7 | 11.595 |
| 1644.3 | 11.6 |
| 1648.5 | 11.58 |
| 1651.1 | 11.535 |
| 1652.0 | 11.365 |
| 1651.1 | 11.221 |
| 1649.6 | 11.062 |
| 1649.0 | 10.997 |
| 1648.6 | 10.947 |
| 1648.3 | 10.911 |
| 1648.2 | 10.9 |
| 1648.3 | 10.9 |
| 1648.3 | 10.9 |
| 1648.3 | 10.907 |
| 1648.3 | 10.909 |
| 1648.6 | 10.918 |
| 1648.7 | 10.923 |
| 1648.6 | 10.928 |
| 1648.6 | 10.93 |
| 1648.8 | 10.949 |
| 1649.0 | 10.96 |
| 1649.2 | 10.976 |
| 1649.3 | 10.986 |
| 1649.4 | 10.997 |
| 1649.4 | 11.006 |
| 1649.4 | 11.025 |
| 1649.4 | 11.038 |
| 1649.5 | 11.051 |
| 1649.6 | 11.068 |
| 1649.8 | 11.083 |
| 1649.9 | 11.098 |
| 1649.9 | 11.111 |
| 1650.1 | 11.128 |
| 1650.2 | 11.142 |
| 1650.2 | 11.168 |
| 1650.4 | 11.186 |
| 1650.6 | 11.204 |
| 1650.6 | 11.223 |
| 1650.9 | 11.246 |
| 1651.2 | 11.263 |
| 1651.3 | 11.279 |
| 1651.4 | 11.291 |
| 1651.5 | 11.298 |
| 1651.7 | 11.315 |
| 1651.8 | 11.324 |
| 1652.0 | 11.338 |
| 1652.1 | 11.347 |
| 1652.3 | 11.366 |
| 1652.4 | 11.377 |
| 1652.5 | 11.398 |
| 1652.8 | 11.41 |
| 1653.0 | 11.433 |
| 1653.1 | 11.443 |
| 1653.2 | 11.462 |
| 1653.1 | 11.473 |
| 1653.3 | 11.493 |
| 1653.4 | 11.503 |
| 1653.7 | 11.518 |
| 1653.8 | 11.529 |
| 1654.0 | 11.542 |
| 1654.4 | 11.56 |
| 1654.5 | 11.571 |
| 1654.6 | 11.58 |
| 1654.9 | 11.593 |
| 1655.0 | 11.613 |
| 1655.1 | 11.626 |
| 1656.5 | 11.636 |
| 1659.6 | 11.632 |
| 1663.3 | 11.548 |
| 1663.8 | 11.439 |
| 1662.3 | 11.246 |
| 1661.4 | 11.136 |
| 1660.7 | 11.031 |
| 1660.4 | 10.997 |
| 1660.3 | 10.972 |
| 1660.2 | 10.954 |
| 1660.2 | 10.951 |
| 1660.1 | 10.951 |
| 1660.2 | 10.952 |
| 1660.2 | 10.959 |
| 1660.3 | 10.963 |
| 1660.2 | 10.975 |
| 1660.2 | 10.982 |
| 1660.3 | 10.994 |
| 1660.6 | 11.004 |
| 1660.7 | 11.017 |
| 1660.8 | 11.021 |
| 1660.8 | 11.028 |
| 1660.9 | 11.042 |
| 1660.9 | 11.052 |
| 1661.0 | 11.077 |
| 1661.2 | 11.089 |
| 1661.3 | 11.113 |
| 1661.4 | 11.129 |
| 1661.6 | 11.154 |
| 1661.6 | 11.169 |
| 1661.9 | 11.185 |
| 1662.0 | 11.197 |
| 1662.1 | 11.215 |
| 1662.2 | 11.228 |
| 1662.3 | 11.248 |
| 1662.5 | 11.257 |
| 1662.6 | 11.275 |
| 1662.7 | 11.289 |
| 1662.8 | 11.301 |
| 1663.2 | 11.317 |
| 1663.3 | 11.332 |
| 1663.6 | 11.349 |
| 1663.6 | 11.359 |
| 1663.6 | 11.367 |
| 1663.5 | 11.376 |
| 1663.8 | 11.395 |
| 1663.8 | 11.41 |
| 1663.8 | 11.43 |
| 1663.9 | 11.452 |
| 1664.2 | 11.478 |
| 1664.4 | 11.496 |
| 1664.7 | 11.512 |
| 1665.0 | 11.527 |
| 1665.0 | 11.538 |
| 1665.2 | 11.559 |
| 1665.4 | 11.573 |
| 1665.7 | 11.589 |
| 1665.9 | 11.599 |
| 1666.0 | 11.611 |
| 1666.1 | 11.618 |
| 1666.3 | 11.633 |
| 1666.3 | 11.64 |
| 1666.5 | 11.659 |
| 1666.6 | 11.673 |
| 1667.2 | 11.692 |
| 1669.7 | 11.695 |
| 1674.8 | 11.644 |
| 1677.4 | 11.541 |
| 1675.9 | 11.314 |
| 1674.7 | 11.155 |
| 1673.6 | 10.989 |
| 1673.0 | 10.924 |
| 1672.5 | 10.883 |
| 1672.2 | 10.845 |
| 1672.1 | 10.837 |
| 1672.0 | 10.837 |
| 1672.1 | 10.843 |
| 1672.1 | 10.851 |
| 1672.2 | 10.861 |
| 1672.3 | 10.869 |
| 1672.4 | 10.877 |
| 1672.7 | 10.883 |
| 1672.7 | 10.889 |
| 1672.7 | 10.899 |
| 1672.9 | 10.911 |
| 1672.8 | 10.918 |
| 1673.0 | 10.929 |
| 1673.3 | 10.945 |
| 1673.4 | 10.954 |
| 1673.5 | 10.959 |
| 1673.5 | 10.969 |
| 1673.5 | 10.982 |
| 1673.7 | 10.998 |
| 1673.9 | 11.006 |
| 1674.0 | 11.022 |
| 1674.1 | 11.035 |
| 1674.2 | 11.058 |
| 1674.2 | 11.069 |
| 1674.2 | 11.086 |
| 1674.4 | 11.101 |
| 1674.4 | 11.126 |
| 1674.6 | 11.142 |
| 1674.9 | 11.164 |
| 1675.2 | 11.176 |
| 1675.3 | 11.185 |
| 1675.3 | 11.199 |
| 1675.3 | 11.21 |
| 1675.4 | 11.229 |
| 1675.5 | 11.244 |
| 1675.8 | 11.271 |
| 1675.9 | 11.288 |
| 1676.0 | 11.308 |
| 1676.0 | 11.321 |
| 1676.3 | 11.342 |
| 1676.6 | 11.355 |
| 1676.7 | 11.367 |
| 1676.7 | 11.377 |
| 1676.8 | 11.395 |
| 1677.1 | 11.41 |
| 1677.1 | 11.426 |
| 1677.3 | 11.446 |
| 1677.5 | 11.472 |
| 1677.7 | 11.489 |
| 1677.8 | 11.503 |
| 1677.9 | 11.519 |
| 1678.1 | 11.531 |
| 1678.2 | 11.546 |
| 1678.2 | 11.554 |
| 1678.5 | 11.571 |
| 1678.6 | 11.586 |
| 1678.8 | 11.601 |
| 1678.8 | 11.615 |
| 1679.1 | 11.629 |
| 1679.2 | 11.65 |
| 1679.4 | 11.675 |
| 1679.7 | 11.687 |
| 1680.3 | 11.707 |
| 1680.5 | 11.719 |
| 1680.6 | 11.724 |
| 1681.0 | 11.726 |
| 1681.5 | 11.725 |
| 1685.2 | 11.706 |
| 1688.1 | 11.659 |
| 1689.4 | 11.493 |
| 1688.2 | 11.348 |
| 1686.6 | 11.189 |
| 1685.8 | 11.119 |
| 1685.5 | 11.066 |
| 1685.4 | 11.052 |
| 1685.5 | 11.042 |
| 1685.5 | 11.034 |
| 1685.4 | 11.033 |
| 1685.5 | 11.035 |
| 1685.5 | 11.04 |
| 1685.5 | 11.044 |
| 1685.4 | 11.048 |
| 1685.5 | 11.061 |
| 1685.5 | 11.074 |
| 1685.6 | 11.092 |
| 1685.6 | 11.106 |
| 1685.8 | 11.132 |
| 1686.0 | 11.148 |
| 1686.2 | 11.168 |
| 1686.3 | 11.181 |
| 1686.6 | 11.198 |
| 1686.7 | 11.209 |
| 1686.8 | 11.218 |
| 1686.8 | 11.224 |
| 1686.9 | 11.233 |
| 1686.9 | 11.248 |
| 1687.1 | 11.258 |
| 1687.1 | 11.273 |
| 1687.1 | 11.288 |
| 1687.5 | 11.311 |
| 1687.6 | 11.323 |
| 1687.7 | 11.344 |
| 1687.7 | 11.36 |
| 1688.0 | 11.386 |
| 1688.3 | 11.397 |
| 1688.5 | 11.411 |
| 1688.6 | 11.417 |
| 1688.8 | 11.429 |
| 1688.8 | 11.438 |
| 1688.8 | 11.444 |
| 1689.0 | 11.461 |
| 1689.3 | 11.473 |
| 1689.3 | 11.492 |
| 1689.3 | 11.503 |
| 1689.6 | 11.526 |
| 1689.8 | 11.538 |
| 1690.0 | 11.558 |
| 1690.1 | 11.567 |
| 1690.4 | 11.583 |
| 1690.5 | 11.593 |
| 1690.8 | 11.606 |
| 1690.8 | 11.615 |
| 1690.8 | 11.626 |
| 1690.8 | 11.633 |
| 1691.2 | 11.661 |
| 1691.4 | 11.678 |
| 1691.5 | 11.692 |
| 1691.9 | 11.712 |
| 1692.0 | 11.733 |
| 1692.4 | 11.744 |
| 1694.6 | 11.744 |
| 1700.4 | 11.701 |
| 1702.5 | 11.604 |
| 1700.9 | 11.344 |
| 1699.5 | 11.194 |
| 1698.1 | 11.06 |
| 1697.5 | 11.009 |
| 1697.1 | 10.962 |
| 1697.0 | 10.951 |
| 1697.0 | 10.948 |
| 1697.1 | 10.956 |
| 1697.2 | 10.96 |
| 1697.4 | 10.964 |
| 1697.4 | 10.969 |
| 1697.2 | 10.976 |
| 1697.4 | 10.983 |
| 1697.4 | 11 |
| 1697.6 | 11.009 |
| 1697.6 | 11.019 |
| 1697.7 | 11.027 |
| 1697.8 | 11.04 |
| 1697.9 | 11.046 |
| 1698.2 | 11.061 |
| 1698.2 | 11.068 |
| 1698.3 | 11.091 |
| 1698.4 | 11.102 |
| 1698.7 | 11.122 |
| 1698.8 | 11.132 |
| 1699.0 | 11.151 |
| 1699.0 | 11.159 |
| 1699.1 | 11.166 |
| 1699.1 | 11.177 |
| 1699.1 | 11.185 |
| 1699.1 | 11.2 |
| 1699.3 | 11.217 |
| 1699.6 | 11.239 |
| 1699.7 | 11.25 |
| 1699.8 | 11.264 |
| 1700.0 | 11.28 |
| 1700.2 | 11.301 |
| 1700.3 | 11.315 |
| 1700.4 | 11.334 |
| 1700.6 | 11.344 |
| 1700.7 | 11.357 |
| 1700.7 | 11.366 |
| 1700.9 | 11.382 |
| 1701.2 | 11.393 |
| 1701.0 | 11.403 |
| 1701.3 | 11.421 |
| 1701.5 | 11.437 |
| 1701.7 | 11.457 |
| 1701.9 | 11.468 |
| 1702.0 | 11.483 |
| 1702.2 | 11.496 |
| 1702.3 | 11.512 |
| 1702.3 | 11.521 |
| 1702.5 | 11.537 |
| 1702.7 | 11.55 |
| 1703.1 | 11.564 |
| 1703.1 | 11.571 |
| 1703.1 | 11.583 |
| 1703.3 | 11.595 |
| 1703.4 | 11.617 |
| 1703.4 | 11.629 |
| 1703.6 | 11.645 |
| 1704.2 | 11.667 |
| 1704.4 | 11.674 |
| 1704.5 | 11.685 |
| 1704.5 | 11.697 |
| 1704.6 | 11.714 |
| 1704.8 | 11.727 |
| 1705.0 | 11.746 |
| 1705.2 | 11.756 |
| 1707.2 | 11.76 |
| 1710.6 | 11.741 |
| 1714.9 | 11.626 |
| 1714.6 | 11.487 |
| 1712.5 | 11.272 |
| 1711.6 | 11.155 |
| 1710.8 | 11.051 |
| 1710.6 | 11.014 |
| 1710.4 | 10.991 |
| 1710.2 | 10.971 |
| 1710.2 | 10.965 |
| 1710.2 | 10.965 |
| 1710.2 | 10.969 |
| 1710.1 | 10.975 |
| 1710.1 | 10.985 |
| 1710.2 | 11.006 |
| 1710.3 | 11.022 |
| 1710.8 | 11.037 |
| 1710.8 | 11.045 |
| 1710.9 | 11.052 |
| 1710.9 | 11.057 |
| 1711.0 | 11.069 |
| 1710.9 | 11.08 |
| 1711.1 | 11.089 |
| 1711.1 | 11.103 |
| 1711.2 | 11.113 |
| 1711.5 | 11.128 |
| 1711.6 | 11.141 |
| 1711.8 | 11.159 |
| 1712.0 | 11.165 |
| 1712.0 | 11.178 |
| 1712.1 | 11.186 |
| 1711.5 | 11.079 |
| 1709.1 | 10.773 |
| 1705.0 | 10.316 |
| 1704.2 | 10.208 |
| 1704.0 | 10.189 |
| 1704.0 | 10.216 |
| 1704.5 | 10.261 |
| 1704.5 | 10.281 |
| 1704.6 | 10.301 |
| 1704.7 | 10.33 |
| 1705.1 | 10.353 |
| 1705.4 | 10.375 |
| 1705.5 | 10.384 |
| 1705.5 | 10.387 |
| 1705.5 | 10.397 |
| 1705.7 | 10.418 |
| 1705.8 | 10.437 |
| 1706.1 | 10.471 |
| 1706.1 | 10.489 |
| 1706.4 | 10.51 |
| 1706.6 | 10.53 |
| 1706.9 | 10.556 |
| 1707.0 | 10.568 |
| 1707.1 | 10.584 |
| 1707.2 | 10.597 |
| 1707.3 | 10.611 |
| 1707.3 | 10.639 |
| 1707.4 | 10.661 |
| 1707.8 | 10.691 |
| 1708.2 | 10.712 |
| 1708.3 | 10.735 |
| 1708.4 | 10.743 |
| 1708.6 | 10.752 |
| 1708.6 | 10.762 |
| 1708.8 | 10.78 |
| 1708.9 | 10.792 |
| 1709.1 | 10.813 |
| 1709.3 | 10.827 |
| 1709.5 | 10.848 |
| 1709.7 | 10.856 |
| 1709.8 | 10.868 |
| 1709.8 | 10.883 |
| 1709.8 | 10.895 |
| 1709.9 | 10.929 |
| 1710.2 | 10.954 |
| 1710.5 | 10.988 |
| 1710.6 | 11.01 |
| 1710.8 | 11.029 |
| 1711.0 | 11.042 |
| 1711.0 | 11.061 |
| 1711.2 | 11.073 |
| 1711.5 | 11.098 |
| 1711.7 | 11.117 |
| 1711.8 | 11.124 |
| 1712.0 | 11.134 |
| 1712.1 | 11.148 |
| 1712.2 | 11.168 |
| 1712.3 | 11.181 |
| 1712.7 | 11.201 |
| 1712.8 | 11.218 |
| 1712.9 | 11.237 |
| 1712.9 | 11.249 |
| 1713.1 | 11.272 |
| 1713.4 | 11.295 |
| 1713.5 | 11.313 |
| 1713.7 | 11.326 |
| 1713.9 | 11.34 |
| 1713.9 | 11.354 |
| 1714.1 | 11.377 |
| 1714.1 | 11.397 |
| 1714.4 | 11.428 |
| 1714.7 | 11.449 |
| 1714.8 | 11.462 |
| 1715.0 | 11.479 |
| 1715.2 | 11.49 |
| 1715.3 | 11.51 |
| 1715.4 | 11.524 |
| 1715.8 | 11.546 |
| 1716.0 | 11.558 |
| 1716.0 | 11.57 |
| 1716.0 | 11.581 |
| 1716.5 | 11.612 |
| 1716.7 | 11.629 |
| 1716.8 | 11.64 |
| 1716.9 | 11.646 |
| 1717.3 | 11.667 |
| 1717.3 | 11.678 |
| 1717.4 | 11.691 |
| 1717.7 | 11.703 |
| 1718.0 | 11.72 |
| 1718.4 | 11.726 |
| 1718.5 | 11.724 |
| 1721.2 | 11.701 |
| 1724.2 | 11.653 |
| 1726.2 | 11.39 |
| 1723.9 | 11.124 |
| 1720.9 | 10.832 |
| 1720.1 | 10.757 |
| 1720.4 | 10.793 |
| 1720.7 | 10.828 |
| 1721.1 | 10.856 |
| 1721.2 | 10.871 |
| 1721.3 | 10.879 |
| 1721.6 | 10.896 |
| 1721.6 | 10.907 |
| 1721.6 | 10.916 |
| 1721.8 | 10.929 |
| 1722.0 | 10.958 |
| 1722.3 | 10.971 |
| 1722.4 | 10.992 |
| 1722.3 | 11 |
| 1722.4 | 11.028 |
| 1722.6 | 11.05 |
| 1722.9 | 11.083 |
| 1723.1 | 11.098 |
| 1723.3 | 11.122 |
| 1723.5 | 11.132 |
| 1723.5 | 11.146 |
| 1723.7 | 11.155 |
| 1723.8 | 11.175 |
| 1723.9 | 11.183 |
| 1724.2 | 11.199 |
| 1724.3 | 11.217 |
| 1724.5 | 11.231 |
| 1724.7 | 11.248 |
| 1724.7 | 11.255 |
| 1724.9 | 11.278 |
| 1725.2 | 11.296 |
| 1725.2 | 11.309 |
| 1725.2 | 11.32 |
| 1725.4 | 11.338 |
| 1725.6 | 11.36 |
| 1726.0 | 11.388 |
| 1726.0 | 11.398 |
| 1726.2 | 11.41 |
| 1726.3 | 11.423 |
| 1726.6 | 11.445 |
| 1726.7 | 11.457 |
| 1726.8 | 11.467 |
| 1727.0 | 11.489 |
| 1727.1 | 11.503 |
| 1727.4 | 11.524 |
| 1727.4 | 11.53 |
| 1727.5 | 11.553 |
| 1727.6 | 11.569 |
| 1727.9 | 11.603 |
| 1728.2 | 11.618 |
| 1728.5 | 11.636 |
| 1728.7 | 11.644 |
| 1728.8 | 11.655 |
| 1728.9 | 11.664 |
| 1729.0 | 11.685 |
| 1729.4 | 11.699 |
| 1729.5 | 11.727 |
| 1729.6 | 11.738 |
| 1730.0 | 11.755 |
| 1731.7 | 11.752 |
| 1735.3 | 11.729 |
| 1738.8 | 11.498 |
| 1737.4 | 11.217 |
| 1733.6 | 10.831 |
| 1732.5 | 10.687 |
| 1732.5 | 10.667 |
| 1732.6 | 10.694 |
| 1732.7 | 10.724 |
| 1732.8 | 10.742 |
| 1732.8 | 10.773 |
| 1733.1 | 10.797 |
| 1733.4 | 10.82 |
| 1733.6 | 10.836 |
| 1733.7 | 10.855 |
| 1733.8 | 10.865 |
| 1733.9 | 10.874 |
| 1734.0 | 10.895 |
| 1734.3 | 10.911 |
| 1734.4 | 10.934 |
| 1734.5 | 10.949 |
| 1734.7 | 10.969 |
| 1734.9 | 10.981 |
| 1735.0 | 11.002 |
| 1735.0 | 11.011 |
| 1735.3 | 11.032 |
| 1735.5 | 11.049 |
| 1735.5 | 11.067 |
| 1735.6 | 11.077 |
| 1735.8 | 11.103 |
| 1736.2 | 11.123 |
| 1736.3 | 11.137 |
| 1736.5 | 11.153 |
| 1736.5 | 11.16 |
| 1736.6 | 11.174 |
| 1736.8 | 11.186 |
| 1737.0 | 11.209 |
| 1737.0 | 11.221 |
| 1737.1 | 11.243 |
| 1737.4 | 11.258 |
| 1737.6 | 11.284 |
| 1737.7 | 11.301 |
| 1737.8 | 11.315 |
| 1737.9 | 11.33 |
| 1738.2 | 11.357 |
| 1738.3 | 11.371 |
| 1738.5 | 11.378 |
| 1738.7 | 11.394 |
| 1738.9 | 11.409 |
| 1739.0 | 11.434 |
| 1739.1 | 11.445 |
| 1739.3 | 11.464 |
| 1739.4 | 11.484 |
| 1739.7 | 11.507 |
| 1739.8 | 11.517 |
| 1740.1 | 11.527 |
| 1740.2 | 11.536 |
| 1740.2 | 11.553 |
| 1740.3 | 11.567 |
| 1740.4 | 11.586 |
| 1740.8 | 11.616 |
| 1741.0 | 11.632 |
| 1741.2 | 11.652 |
| 1741.4 | 11.672 |
| 1741.5 | 11.689 |
| 1741.7 | 11.701 |
| 1741.9 | 11.724 |
| 1742.0 | 11.739 |
| 1742.5 | 11.755 |
| 1742.7 | 11.764 |
| 1743.4 | 11.767 |
| 1745.1 | 11.744 |
| 1748.8 | 11.647 |
| 1749.5 | 11.487 |
| 1747.1 | 11.146 |
| 1745.8 | 10.991 |
| 1745.1 | 10.914 |
| 1745.1 | 10.918 |
| 1745.2 | 10.945 |
| 1745.3 | 10.963 |
| 1745.5 | 10.983 |
| 1745.7 | 11 |
| 1745.8 | 11.014 |
| 1745.9 | 11.031 |
| 1745.8 | 11.043 |
| 1746.1 | 11.068 |
| 1746.3 | 11.091 |
| 1746.5 | 11.115 |
| 1746.6 | 11.129 |
| 1746.6 | 11.148 |
| 1746.6 | 11.166 |
| 1747.0 | 11.205 |
| 1747.2 | 11.232 |
| 1747.4 | 11.255 |
| 1747.6 | 11.266 |
| 1747.7 | 11.275 |
| 1747.7 | 11.289 |
| 1747.8 | 11.298 |
| 1748.0 | 11.323 |
| 1748.2 | 11.338 |
| 1748.4 | 11.365 |
| 1748.5 | 11.374 |
| 1748.8 | 11.393 |
| 1748.9 | 11.406 |
| 1749.1 | 11.432 |
| 1749.2 | 11.444 |
| 1749.5 | 11.458 |
| 1749.6 | 11.466 |
| 1749.8 | 11.483 |
| 1749.8 | 11.491 |
| 1749.7 | 11.512 |
| 1749.9 | 11.532 |
| 1750.2 | 11.55 |
| 1750.7 | 11.578 |
| 1750.8 | 11.59 |
| 1751.0 | 11.598 |
| 1751.0 | 11.604 |
| 1751.2 | 11.621 |
| 1751.2 | 11.632 |
| 1751.5 | 11.655 |
| 1751.6 | 11.667 |
| 1752.0 | 11.693 |
| 1752.2 | 11.707 |
| 1752.3 | 11.721 |
| 1752.5 | 11.729 |
| 1752.8 | 11.746 |
| 1752.9 | 11.759 |
| 1753.6 | 11.758 |
| 1759.3 | 11.719 |
| 1761.9 | 11.587 |
| 1760.4 | 11.134 |
| 1757.8 | 10.838 |
| 1755.5 | 10.622 |
| 1755.2 | 10.6 |
| 1755.5 | 10.644 |
| 1755.9 | 10.677 |
| 1756.2 | 10.701 |
| 1756.2 | 10.71 |
| 1756.3 | 10.724 |
| 1756.5 | 10.737 |
| 1756.7 | 10.754 |
| 1756.8 | 10.771 |
| 1756.9 | 10.792 |
| 1757.1 | 10.809 |
| 1757.2 | 10.823 |
| 1757.4 | 10.846 |
| 1757.5 | 10.857 |
| 1757.7 | 10.878 |
| 1757.8 | 10.892 |
| 1757.9 | 10.913 |
| 1758.0 | 10.922 |
| 1758.2 | 10.941 |
| 1758.4 | 10.958 |
| 1758.7 | 10.976 |
| 1758.7 | 10.986 |
| 1758.8 | 11.004 |
| 1759.0 | 11.016 |
| 1759.3 | 11.043 |
| 1759.3 | 11.056 |
| 1759.3 | 11.066 |
| 1759.3 | 11.088 |
| 1759.6 | 11.111 |
| 1759.8 | 11.138 |
| 1759.9 | 11.16 |
| 1760.1 | 11.186 |
| 1760.1 | 11.201 |
| 1760.4 | 11.22 |
| 1760.6 | 11.237 |
| 1760.9 | 11.258 |
| 1761.0 | 11.273 |
| 1761.2 | 11.291 |
| 1761.3 | 11.303 |
| 1761.5 | 11.324 |
| 1761.6 | 11.343 |
| 1761.8 | 11.357 |
| 1761.9 | 11.371 |
| 1762.2 | 11.382 |
| 1762.3 | 11.399 |
| 1762.3 | 11.407 |
| 1762.6 | 11.426 |
| 1762.8 | 11.444 |
| 1763.1 | 11.464 |
| 1763.2 | 11.47 |
| 1763.4 | 11.483 |
| 1763.5 | 11.491 |
| 1763.6 | 11.508 |
| 1763.8 | 11.52 |
| 1764.1 | 11.537 |
| 1764.2 | 11.548 |
| 1764.2 | 11.554 |
| 1764.3 | 11.576 |
| 1764.4 | 11.592 |
| 1764.7 | 11.621 |
| 1764.9 | 11.636 |
| 1765.2 | 11.657 |
| 1765.4 | 11.67 |
| 1765.5 | 11.689 |
| 1765.6 | 11.697 |
| 1765.8 | 11.722 |
| 1766.2 | 11.737 |
| 1769.9 | 11.726 |
| 1773.0 | 11.661 |
| 1774.2 | 11.347 |
| 1771.9 | 11.054 |
| 1769.6 | 10.822 |
| 1768.3 | 10.685 |
| 1768.6 | 10.702 |
| 1768.9 | 10.73 |
| 1769.0 | 10.75 |
| 1769.2 | 10.766 |
| 1769.3 | 10.777 |
| 1769.4 | 10.8 |
| 1769.6 | 10.813 |
| 1769.8 | 10.834 |
| 1769.8 | 10.853 |
| 1769.9 | 10.877 |
| 1770.0 | 10.89 |
| 1770.4 | 10.913 |
| 1770.5 | 10.925 |
| 1770.6 | 10.939 |
| 1770.6 | 10.949 |
| 1770.7 | 10.964 |
| 1770.9 | 10.989 |
| 1771.2 | 11.006 |
| 1771.2 | 11.027 |
| 1771.3 | 11.043 |
| 1771.7 | 11.068 |
| 1771.7 | 11.082 |
| 1771.9 | 11.105 |
| 1772.1 | 11.119 |
| 1772.4 | 11.136 |
| 1772.4 | 11.142 |
| 1772.4 | 11.157 |
| 1772.5 | 11.169 |
| 1772.7 | 11.197 |
| 1772.8 | 11.212 |
| 1773.1 | 11.241 |
| 1773.2 | 11.258 |
| 1773.3 | 11.28 |
| 1773.6 | 11.298 |
| 1773.8 | 11.317 |
| 1774.0 | 11.342 |
| 1774.2 | 11.355 |
| 1774.2 | 11.365 |
| 1774.3 | 11.375 |
| 1774.4 | 11.4 |
| 1774.6 | 11.42 |
| 1774.9 | 11.438 |
| 1774.9 | 11.449 |
| 1775.1 | 11.474 |
| 1775.5 | 11.496 |
| 1775.7 | 11.513 |
| 1775.7 | 11.519 |
| 1775.9 | 11.535 |
| 1776.1 | 11.548 |
| 1776.3 | 11.559 |
| 1776.2 | 11.571 |
| 1776.3 | 11.583 |
| 1776.6 | 11.615 |
| 1777.0 | 11.636 |
| 1777.1 | 11.651 |
| 1777.2 | 11.663 |
| 1777.6 | 11.676 |
| 1777.7 | 11.685 |
| 1778.0 | 11.695 |
| 1778.1 | 11.703 |
| 1778.3 | 11.724 |
| 1778.5 | 11.737 |
| 1782.7 | 11.729 |
| 1786.0 | 11.657 |
| 1787.8 | 11.469 |
| 1784.4 | 10.974 |
| 1782.1 | 10.722 |
| 1780.7 | 10.586 |
| 1780.9 | 10.599 |
| 1781.2 | 10.648 |
| 1781.4 | 10.676 |
| 1781.5 | 10.7 |
| 1781.6 | 10.718 |
| 1782.0 | 10.743 |
| 1782.1 | 10.754 |
| 1782.1 | 10.771 |
| 1782.2 | 10.78 |
| 1782.3 | 10.804 |
| 1782.6 | 10.825 |
| 1782.7 | 10.846 |
| 1782.8 | 10.86 |
| 1782.9 | 10.876 |
| 1783.2 | 10.901 |
| 1783.4 | 10.919 |
| 1783.4 | 10.934 |
| 1783.6 | 10.947 |
| 1783.8 | 10.968 |
| 1783.9 | 10.983 |
| 1784.0 | 10.997 |
| 1784.1 | 11.009 |
| 1784.4 | 11.025 |
| 1784.5 | 11.035 |
| 1784.7 | 11.051 |
| 1784.8 | 11.066 |
| 1785.0 | 11.085 |
| 1785.0 | 11.097 |
| 1785.2 | 11.113 |
| 1785.5 | 11.141 |
| 1785.8 | 11.154 |
| 1785.9 | 11.171 |
| 1786.0 | 11.174 |
| 1786.0 | 11.189 |
| 1786.1 | 11.203 |
| 1786.4 | 11.234 |
| 1786.6 | 11.249 |
| 1786.6 | 11.267 |
| 1786.9 | 11.278 |
| 1787.1 | 11.302 |
| 1787.2 | 11.311 |
| 1787.3 | 11.33 |
| 1787.4 | 11.344 |
| 1787.7 | 11.359 |
| 1787.8 | 11.376 |
| 1787.9 | 11.389 |
| 1788.0 | 11.409 |
| 1788.3 | 11.427 |
| 1788.4 | 11.454 |
| 1788.5 | 11.47 |
| 1788.8 | 11.49 |
| 1788.9 | 11.506 |
| 1789.1 | 11.525 |
| 1789.2 | 11.541 |
| 1789.5 | 11.558 |
| 1789.7 | 11.57 |
| 1789.9 | 11.588 |
| 1790.2 | 11.605 |
| 1790.4 | 11.616 |
| 1790.4 | 11.623 |
| 1790.7 | 11.636 |
| 1790.8 | 11.646 |
| 1790.9 | 11.653 |
| 1791.0 | 11.672 |
| 1791.1 | 11.684 |
| 1791.4 | 11.709 |
| 1791.6 | 11.726 |
| 1793.7 | 11.738 |
| 1797.7 | 11.706 |
| 1801.5 | 11.45 |
| 1800.1 | 11.138 |
| 1795.9 | 10.703 |
| 1794.4 | 10.535 |
| 1794.2 | 10.504 |
| 1794.4 | 10.53 |
| 1794.8 | 10.57 |
| 1794.9 | 10.59 |
| 1795.0 | 10.602 |
| 1795.3 | 10.624 |
| 1795.3 | 10.637 |
| 1795.5 | 10.657 |
| 1795.5 | 10.671 |
| 1795.6 | 10.691 |
| 1795.8 | 10.711 |
| 1796.0 | 10.739 |
| 1796.2 | 10.758 |
| 1796.5 | 10.787 |
| 1796.6 | 10.799 |
| 1796.6 | 10.814 |
| 1796.6 | 10.823 |
| 1796.8 | 10.848 |
| 1796.9 | 10.867 |
| 1797.3 | 10.886 |
| 1797.4 | 10.901 |
| 1797.5 | 10.912 |
| 1797.9 | 10.931 |
| 1798.0 | 10.942 |
| 1798.2 | 10.952 |
| 1798.2 | 10.96 |
| 1798.4 | 10.975 |
| 1798.5 | 10.988 |
| 1798.7 | 11.006 |
| 1798.8 | 11.021 |
| 1799.1 | 11.031 |
| 1799.1 | 11.042 |
| 1799.2 | 11.058 |
| 1799.3 | 11.073 |
| 1799.6 | 11.085 |
| 1799.7 | 11.105 |
| 1799.7 | 11.117 |
| 1799.8 | 11.147 |
| 1800.0 | 11.171 |
| 1800.3 | 11.211 |
| 1800.5 | 11.229 |
| 1800.5 | 11.25 |
| 1800.7 | 11.263 |
| 1800.9 | 11.29 |
| 1801.0 | 11.303 |
| 1801.3 | 11.325 |
| 1801.3 | 11.341 |
| 1801.6 | 11.359 |
| 1801.6 | 11.376 |
| 1801.9 | 11.403 |
| 1802.0 | 11.42 |
| 1802.2 | 11.434 |
| 1802.5 | 11.457 |
| 1802.6 | 11.47 |
| 1802.9 | 11.483 |
| 1802.9 | 11.491 |
| 1803.1 | 11.507 |
| 1803.2 | 11.518 |
| 1803.4 | 11.526 |
| 1803.4 | 11.538 |
| 1803.7 | 11.566 |
| 1803.9 | 11.586 |
| 1804.2 | 11.607 |
| 1804.3 | 11.618 |
| 1804.5 | 11.638 |
| 1804.8 | 11.652 |
| 1805.3 | 11.666 |
| 1805.4 | 11.672 |
| 1805.4 | 11.678 |
| 1805.5 | 11.684 |
| 1805.7 | 11.686 |
| 1805.7 | 11.699 |
| 1805.7 | 11.712 |
| 1806.4 | 11.729 |
| 1810.4 | 11.721 |
| 1816.2 | 11.564 |
| 1815.9 | 11.288 |
| 1811.5 | 10.705 |
| 1809.4 | 10.478 |
| 1808.5 | 10.399 |
| 1808.7 | 10.428 |
| 1809.2 | 10.494 |
| 1809.4 | 10.513 |
| 1809.8 | 10.53 |
| 1809.9 | 10.537 |
| 1809.6 | 10.54 |
| 1809.8 | 10.559 |
| 1809.9 | 10.582 |
| 1810.1 | 10.611 |
| 1810.2 | 10.63 |
| 1810.5 | 10.655 |
| 1810.6 | 10.673 |
| 1810.7 | 10.695 |
| 1810.7 | 10.712 |
| 1811.1 | 10.742 |
| 1811.2 | 10.763 |
| 1811.5 | 10.782 |
| 1811.5 | 10.794 |
| 1811.7 | 10.814 |
| 1811.9 | 10.829 |
| 1812.0 | 10.844 |
| 1812.1 | 10.855 |
| 1812.0 | 10.863 |
| 1812.4 | 10.89 |
| 1812.7 | 10.914 |
| 1812.8 | 10.928 |
| 1812.8 | 10.935 |
| 1812.6 | 10.956 |
| 1812.8 | 10.974 |
| 1813.3 | 11.017 |
| 1813.6 | 11.04 |
| 1813.8 | 11.054 |
| 1813.8 | 11.056 |
| 1813.8 | 11.068 |
| 1813.9 | 11.085 |
| 1814.0 | 11.107 |
| 1814.4 | 11.143 |
| 1814.6 | 11.157 |
| 1814.9 | 11.171 |
| 1814.9 | 11.178 |
| 1815.1 | 11.2 |
| 1815.3 | 11.212 |
| 1815.5 | 11.231 |
| 1815.6 | 11.238 |
| 1815.7 | 11.257 |
| 1815.8 | 11.269 |
| 1815.9 | 11.294 |
| 1816.2 | 11.306 |
| 1816.4 | 11.33 |
| 1816.8 | 11.342 |
| 1816.8 | 11.348 |
| 1816.8 | 11.353 |
| 1816.8 | 11.367 |
| 1817.1 | 11.403 |
| 1817.5 | 11.426 |
| 1817.7 | 11.44 |
| 1817.7 | 11.446 |
| 1817.8 | 11.461 |
| 1817.8 | 11.478 |
| 1818.2 | 11.501 |
| 1818.4 | 11.52 |
| 1818.8 | 11.546 |
| 1818.9 | 11.554 |
| 1819.0 | 11.556 |
| 1819.0 | 11.563 |
| 1819.3 | 11.582 |
| 1819.4 | 11.601 |
| 1819.6 | 11.617 |
| 1820.0 | 11.636 |
| 1820.1 | 11.645 |
| 1820.3 | 11.655 |
| 1820.3 | 11.657 |
| 1820.6 | 11.674 |
| 1820.7 | 11.686 |
| 1820.7 | 11.708 |
| 1820.9 | 11.724 |
| 1825.9 | 11.722 |
| 1830.1 | 11.65 |
| 1831.5 | 11.231 |
| 1828.3 | 10.829 |
| 1824.2 | 10.437 |
| 1823.5 | 10.34 |
| 1823.6 | 10.346 |
| 1823.9 | 10.401 |
| 1824.1 | 10.436 |
| 1824.4 | 10.455 |
| 1824.5 | 10.472 |
| 1824.5 | 10.501 |
| 1824.6 | 10.518 |
| 1825.1 | 10.55 |
| 1825.2 | 10.564 |
| 1825.3 | 10.586 |
| 1825.4 | 10.598 |
| 1825.7 | 10.617 |
| 1825.8 | 10.626 |
| 1826.0 | 10.645 |
| 1826.0 | 10.66 |
| 1826.1 | 10.678 |
| 1826.1 | 10.688 |
| 1826.4 | 10.716 |
| 1826.5 | 10.731 |
| 1826.7 | 10.747 |
| 1827.0 | 10.771 |
| 1827.1 | 10.788 |
| 1827.2 | 10.811 |
| 1827.4 | 10.829 |
| 1827.7 | 10.849 |
| 1827.9 | 10.862 |
| 1828.2 | 10.877 |
| 1828.3 | 10.884 |
| 1828.2 | 10.891 |
| 1828.2 | 10.905 |
| 1828.4 | 10.931 |
| 1828.6 | 10.947 |
| 1828.9 | 10.959 |
| 1829.1 | 10.972 |
| 1829.2 | 10.98 |
| 1829.3 | 10.995 |
| 1829.3 | 11.002 |
| 1829.3 | 11.023 |
| 1829.6 | 11.042 |
| 1829.8 | 11.078 |
| 1829.9 | 11.097 |
| 1830.2 | 11.122 |
| 1830.1 | 11.136 |
| 1830.3 | 11.169 |
| 1830.5 | 11.187 |
| 1831.0 | 11.214 |
| 1831.0 | 11.224 |
| 1831.2 | 11.234 |
| 1831.2 | 11.243 |
| 1831.6 | 11.269 |
| 1831.8 | 11.28 |
| 1832.0 | 11.29 |
| 1832.0 | 11.3 |
| 1832.0 | 11.312 |
| 1832.3 | 11.33 |
| 1832.4 | 11.346 |
| 1832.6 | 11.364 |
| 1832.7 | 11.381 |
| 1832.9 | 11.401 |
| 1833.1 | 11.415 |
| 1833.3 | 11.434 |
| 1833.4 | 11.449 |
| 1833.7 | 11.466 |
| 1833.9 | 11.483 |
| 1834.0 | 11.502 |
| 1834.1 | 11.514 |
| 1834.2 | 11.525 |
| 1834.3 | 11.546 |
| 1834.4 | 11.556 |
| 1834.8 | 11.584 |
| 1834.9 | 11.6 |
| 1835.2 | 11.621 |
| 1835.4 | 11.63 |
| 1835.6 | 11.647 |
| 1835.8 | 11.653 |
| 1836.0 | 11.67 |
| 1836.2 | 11.681 |
| 1836.3 | 11.698 |
| 1836.3 | 11.708 |
| 1837.5 | 11.729 |
| 1841.8 | 11.721 |
| 1845.6 | 11.633 |
| 1846.6 | 11.206 |
| 1843.4 | 10.825 |
| 1839.7 | 10.46 |
| 1839.1 | 10.374 |
| 1839.3 | 10.404 |
| 1839.4 | 10.443 |
| 1839.9 | 10.481 |
| 1839.9 | 10.5 |
| 1840.1 | 10.523 |
| 1840.3 | 10.539 |
| 1840.5 | 10.56 |
| 1840.5 | 10.576 |
| 1840.6 | 10.597 |
| 1840.9 | 10.616 |
| 1841.0 | 10.631 |
| 1841.1 | 10.648 |
| 1841.2 | 10.661 |
| 1841.6 | 10.684 |
| 1841.6 | 10.695 |
| 1841.9 | 10.712 |
| 1841.9 | 10.724 |
| 1841.9 | 10.742 |
| 1842.0 | 10.758 |
| 1842.2 | 10.79 |
| 1842.4 | 10.814 |
| 1842.9 | 10.845 |
| 1843.0 | 10.86 |
| 1843.1 | 10.871 |
| 1843.2 | 10.873 |
| 1843.4 | 10.883 |
| 1843.5 | 10.901 |
| 1843.8 | 10.917 |
| 1843.9 | 10.929 |
| 1844.1 | 10.937 |
| 1844.2 | 10.951 |
| 1844.2 | 10.964 |
| 1844.4 | 10.982 |
| 1844.5 | 10.992 |
| 1844.8 | 11.017 |
| 1844.8 | 11.032 |
| 1845.1 | 11.05 |
| 1845.1 | 11.062 |
| 1845.3 | 11.084 |
| 1845.4 | 11.098 |
| 1845.6 | 11.125 |
| 1845.7 | 11.142 |
| 1846.0 | 11.166 |
| 1846.1 | 11.18 |
| 1846.2 | 11.194 |
| 1846.6 | 11.211 |
| 1846.7 | 11.226 |
| 1846.8 | 11.244 |
| 1846.8 | 11.255 |
| 1846.8 | 11.278 |
| 1847.0 | 11.301 |
| 1847.2 | 11.336 |
| 1847.5 | 11.357 |
| 1847.9 | 11.376 |
| 1848.0 | 11.389 |
| 1848.1 | 11.4 |
| 1848.2 | 11.409 |
| 1848.5 | 11.424 |
| 1848.6 | 11.438 |
| 1848.7 | 11.457 |
| 1848.8 | 11.474 |
| 1849.2 | 11.492 |
| 1849.3 | 11.507 |
| 1849.4 | 11.517 |
| 1849.6 | 11.535 |
| 1849.8 | 11.541 |
| 1849.9 | 11.555 |
| 1850.0 | 11.565 |
| 1850.2 | 11.588 |
| 1850.4 | 11.603 |
| 1850.5 | 11.627 |
| 1850.8 | 11.641 |
| 1851.1 | 11.663 |
| 1851.2 | 11.673 |
| 1851.5 | 11.69 |
| 1851.7 | 11.702 |
| 1851.8 | 11.714 |
| 1852.3 | 11.72 |
| 1855.7 | 11.708 |
| 1863.1 | 11.714 |
| 1865.9 | 11.699 |
| 1865.7 | 11.555 |
| 1864.7 | 11.43 |
| 1863.6 | 11.312 |
| 1863.3 | 11.258 |
| 1862.8 | 11.206 |
| 1862.7 | 11.195 |
| 1862.5 | 11.185 |
| 1862.5 | 11.188 |
| 1862.7 | 11.199 |
| 1862.7 | 11.205 |
| 1862.9 | 11.211 |
| 1862.9 | 11.217 |
| 1862.9 | 11.223 |
| 1862.9 | 11.234 |
| 1863.1 | 11.244 |
| 1863.4 | 11.255 |
| 1863.5 | 11.262 |
| 1863.5 | 11.275 |
| 1863.5 | 11.283 |
| 1863.6 | 11.301 |
| 1863.8 | 11.317 |
| 1863.9 | 11.341 |
| 1864.0 | 11.349 |
| 1864.2 | 11.37 |
| 1864.4 | 11.377 |
| 1864.2 | 11.39 |
| 1864.4 | 11.4 |
| 1864.6 | 11.422 |
| 1864.7 | 11.433 |
| 1864.8 | 11.449 |
| 1865.1 | 11.469 |
| 1865.2 | 11.483 |
| 1865.4 | 11.498 |
| 1865.5 | 11.512 |
| 1865.5 | 11.529 |
| 1865.7 | 11.542 |
| 1865.9 | 11.558 |
| 1866.0 | 11.571 |
| 1866.3 | 11.59 |
| 1866.3 | 11.605 |
| 1866.6 | 11.621 |
| 1866.7 | 11.633 |
| 1866.9 | 11.646 |
| 1867.0 | 11.659 |
| 1867.3 | 11.675 |
| 1867.3 | 11.687 |
| 1867.6 | 11.701 |
| 1867.7 | 11.718 |
| 1867.8 | 11.729 |
| 1868.2 | 11.743 |
| 1868.4 | 11.755 |
| 1868.5 | 11.766 |
| 1868.8 | 11.771 |
| 1868.6 | 11.778 |
| 1868.8 | 11.789 |
| 1870.9 | 11.792 |
| 1876.3 | 11.775 |
| 1883.8 | 11.626 |
| 1882.8 | 11.415 |
| 1879.7 | 11.014 |
| 1877.9 | 10.831 |
| 1876.5 | 10.688 |
| 1876.1 | 10.627 |
| 1875.6 | 10.582 |
| 1875.3 | 10.544 |
| 1875.2 | 10.534 |
| 1875.2 | 10.53 |
| 1875.3 | 10.529 |
| 1875.4 | 10.531 |
| 1875.4 | 10.535 |
| 1875.4 | 10.539 |
| 1875.4 | 10.54 |
| 1875.4 | 10.556 |
| 1875.5 | 10.568 |
| 1875.5 | 10.584 |
| 1875.6 | 10.591 |
| 1875.9 | 10.61 |
| 1876.0 | 10.621 |
| 1876.0 | 10.631 |
| 1876.0 | 10.642 |
| 1876.0 | 10.656 |
| 1876.1 | 10.678 |
| 1876.3 | 10.691 |
| 1876.6 | 10.711 |
| 1876.7 | 10.725 |
| 1877.1 | 10.739 |
| 1877.1 | 10.748 |
| 1877.2 | 10.756 |
| 1877.2 | 10.766 |
| 1877.4 | 10.786 |
| 1877.7 | 10.8 |
| 1877.7 | 10.809 |
| 1877.8 | 10.82 |
| 1877.9 | 10.834 |
| 1878.0 | 10.842 |
| 1878.0 | 10.849 |
| 1878.2 | 10.866 |
| 1878.2 | 10.878 |
| 1878.4 | 10.895 |
| 1878.5 | 10.906 |
| 1878.6 | 10.922 |
| 1878.7 | 10.936 |
| 1879.0 | 10.959 |
| 1879.1 | 10.972 |
| 1879.2 | 10.991 |
| 1879.2 | 11.004 |
| 1879.6 | 11.025 |
| 1879.7 | 11.035 |
| 1879.8 | 11.05 |
| 1879.7 | 11.058 |
| 1879.9 | 11.078 |
| 1880.0 | 11.09 |
| 1880.3 | 11.111 |
| 1880.4 | 11.119 |
| 1880.5 | 11.132 |
| 1880.6 | 11.154 |
| 1880.9 | 11.168 |
| 1881.0 | 11.186 |
| 1881.1 | 11.197 |
| 1881.2 | 11.217 |
| 1881.3 | 11.234 |
| 1881.6 | 11.251 |
| 1881.7 | 11.263 |
| 1881.8 | 11.284 |
| 1881.9 | 11.298 |
| 1882.4 | 11.314 |
| 1882.6 | 11.325 |
| 1882.6 | 11.337 |
| 1882.6 | 11.348 |
| 1882.9 | 11.355 |
| 1883.0 | 11.37 |
| 1883.1 | 11.381 |
| 1883.1 | 11.394 |
| 1883.0 | 11.407 |
| 1883.1 | 11.43 |
| 1883.2 | 11.447 |
| 1883.6 | 11.481 |
| 1883.8 | 11.498 |
| 1884.1 | 11.517 |
| 1884.3 | 11.53 |
| 1884.3 | 11.549 |
| 1884.4 | 11.56 |
| 1884.7 | 11.58 |
| 1884.8 | 11.598 |
| 1885.0 | 11.615 |
| 1885.3 | 11.639 |
| 1885.4 | 11.651 |
| 1885.6 | 11.666 |
| 1885.7 | 11.673 |
| 1885.8 | 11.687 |
| 1886.0 | 11.697 |
| 1886.2 | 11.713 |
| 1886.3 | 11.727 |
| 1886.8 | 11.752 |
| 1889.6 | 11.741 |
| 1897.8 | 11.675 |
| 1900.8 | 11.536 |
| 1898.5 | 11.161 |
| 1896.5 | 10.939 |
| 1895.1 | 10.776 |
| 1893.6 | 10.643 |
| 1893.0 | 10.591 |
| 1892.6 | 10.547 |
| 1892.5 | 10.54 |
| 1892.4 | 10.539 |
| 1892.4 | 10.545 |
| 1892.7 | 10.553 |
| 1892.7 | 10.558 |
| 1892.7 | 10.56 |
| 1892.7 | 10.571 |
| 1893.0 | 10.585 |
| 1893.0 | 10.593 |
| 1893.1 | 10.6 |
| 1893.2 | 10.61 |
| 1893.4 | 10.625 |
| 1893.6 | 10.636 |
| 1893.6 | 10.643 |
| 1893.7 | 10.657 |
| 1893.7 | 10.666 |
| 1893.8 | 10.68 |
| 1893.8 | 10.687 |
| 1894.0 | 10.708 |
| 1894.2 | 10.717 |
| 1894.3 | 10.739 |
| 1894.4 | 10.75 |
| 1894.6 | 10.766 |
| 1894.6 | 10.776 |
| 1894.7 | 10.797 |
| 1895.0 | 10.806 |
| 1895.3 | 10.822 |
| 1895.3 | 10.831 |
| 1895.5 | 10.845 |
| 1895.7 | 10.851 |
| 1895.6 | 10.865 |
| 1895.6 | 10.88 |
| 1895.7 | 10.891 |
| 1895.9 | 10.917 |
| 1896.2 | 10.932 |
| 1896.3 | 10.945 |
| 1896.4 | 10.954 |
| 1896.4 | 10.969 |
| 1896.4 | 10.982 |
| 1896.6 | 11.002 |
| 1896.9 | 11.016 |
| 1897.0 | 11.033 |
| 1897.0 | 11.046 |
| 1897.1 | 11.065 |
| 1897.4 | 11.079 |
| 1897.7 | 11.101 |
| 1897.7 | 11.115 |
| 1897.8 | 11.123 |
| 1898.0 | 11.141 |
| 1898.1 | 11.153 |
| 1898.2 | 11.172 |
| 1898.3 | 11.182 |
| 1898.4 | 11.203 |
| 1898.7 | 11.217 |
| 1898.8 | 11.234 |
| 1898.9 | 11.244 |
| 1899.1 | 11.261 |
| 1899.4 | 11.274 |
| 1899.5 | 11.295 |
| 1899.5 | 11.303 |
| 1899.6 | 11.318 |
| 1899.9 | 11.334 |
| 1900.0 | 11.343 |
| 1900.2 | 11.361 |
| 1900.2 | 11.37 |
| 1900.4 | 11.384 |
| 1900.7 | 11.394 |
| 1900.8 | 11.41 |
| 1900.7 | 11.423 |
| 1900.9 | 11.44 |
| 1901.2 | 11.454 |
| 1901.4 | 11.475 |
| 1901.5 | 11.487 |
| 1901.8 | 11.503 |
| 1901.9 | 11.515 |
| 1901.9 | 11.533 |
| 1902.1 | 11.543 |
| 1902.3 | 11.561 |
| 1902.5 | 11.573 |
| 1902.6 | 11.593 |
| 1902.7 | 11.606 |
| 1902.8 | 11.62 |
| 1903.1 | 11.634 |
| 1903.3 | 11.651 |
| 1903.5 | 11.672 |
| 1903.8 | 11.685 |
| 1904.2 | 11.702 |
| 1904.6 | 11.715 |
| 1904.7 | 11.724 |
| 1905.1 | 11.725 |
| 1910.5 | 11.697 |
| 1914.3 | 11.63 |
| 1915.5 | 11.392 |
| 1914.0 | 11.193 |
| 1911.6 | 10.969 |
| 1910.8 | 10.877 |
| 1910.3 | 10.82 |
| 1910.1 | 10.773 |
| 1910.1 | 10.756 |
| 1910.2 | 10.747 |
| 1909.8 | 10.74 |
| 1909.7 | 10.74 |
| 1909.7 | 10.746 |
| 1910.1 | 10.76 |
| 1910.2 | 10.768 |
| 1910.3 | 10.777 |
| 1910.1 | 10.783 |
| 1910.2 | 10.794 |
| 1910.2 | 10.803 |
| 1910.4 | 10.821 |
| 1910.5 | 10.832 |
| 1910.7 | 10.842 |
| 1910.8 | 10.853 |
| 1910.8 | 10.863 |
| 1910.9 | 10.879 |
| 1910.9 | 10.896 |
| 1911.0 | 10.913 |
| 1911.2 | 10.928 |
| 1911.4 | 10.942 |
| 1911.6 | 10.954 |
| 1911.6 | 10.964 |
| 1911.6 | 10.975 |
| 1912.0 | 10.991 |
| 1912.1 | 11.002 |
| 1912.2 | 11.012 |
| 1912.2 | 11.023 |
| 1912.3 | 11.039 |
| 1912.4 | 11.055 |
| 1912.4 | 11.071 |
| 1912.7 | 11.09 |
| 1912.9 | 11.103 |
| 1913.1 | 11.122 |
| 1913.3 | 11.126 |
| 1913.4 | 11.138 |
| 1913.5 | 11.148 |
| 1913.5 | 11.166 |
| 1913.5 | 11.176 |
| 1913.6 | 11.199 |
| 1913.7 | 11.215 |
| 1914.2 | 11.243 |
| 1914.5 | 11.26 |
| 1914.7 | 11.278 |
| 1914.7 | 11.289 |
| 1914.8 | 11.308 |
| 1914.8 | 11.317 |
| 1915.0 | 11.331 |
| 1915.3 | 11.341 |
| 1915.3 | 11.349 |
| 1915.4 | 11.361 |
| 1915.4 | 11.375 |
| 1915.6 | 11.394 |
| 1915.8 | 11.409 |
| 1916.0 | 11.43 |
| 1916.1 | 11.446 |
| 1916.2 | 11.463 |
| 1916.4 | 11.474 |
| 1916.6 | 11.493 |
| 1916.6 | 11.508 |
| 1916.8 | 11.521 |
| 1916.9 | 11.532 |
| 1917.3 | 11.548 |
| 1917.3 | 11.559 |
| 1917.3 | 11.57 |
| 1917.5 | 11.589 |
| 1917.9 | 11.603 |
| 1918.0 | 11.626 |
| 1918.1 | 11.639 |
| 1918.6 | 11.653 |
| 1919.2 | 11.666 |
| 1921.5 | 11.658 |
| 1924.9 | 11.62 |
| 1929.0 | 11.489 |
| 1928.0 | 11.336 |
| 1926.0 | 11.079 |
| 1925.0 | 10.969 |
| 1924.2 | 10.89 |
| 1923.8 | 10.859 |
| 1923.6 | 10.84 |
| 1923.7 | 10.831 |
| 1923.7 | 10.834 |
| 1923.8 | 10.837 |
| 1923.8 | 10.842 |
| 1923.8 | 10.846 |
| 1923.8 | 10.855 |
| 1923.7 | 10.866 |
| 1923.9 | 10.874 |
| 1923.9 | 10.889 |
| 1924.1 | 10.902 |
| 1924.2 | 10.918 |
| 1924.4 | 10.924 |
| 1924.4 | 10.94 |
| 1924.4 | 10.952 |
| 1924.7 | 10.968 |
| 1924.7 | 10.974 |
| 1924.8 | 10.992 |
| 1924.9 | 11.006 |
| 1925.0 | 11.02 |
| 1925.3 | 11.037 |
| 1925.4 | 11.05 |
| 1925.5 | 11.061 |
| 1925.6 | 11.069 |
| 1925.7 | 11.08 |
| 1925.8 | 11.092 |
| 1926.1 | 11.109 |
| 1926.2 | 11.12 |
| 1926.2 | 11.135 |
| 1926.4 | 11.147 |
| 1926.6 | 11.168 |
| 1926.8 | 11.177 |
| 1926.8 | 11.193 |
| 1926.8 | 11.209 |
| 1926.9 | 11.217 |
| 1927.4 | 11.243 |
| 1927.4 | 11.252 |
| 1927.4 | 11.264 |
| 1927.6 | 11.273 |
| 1927.9 | 11.291 |
| 1928.0 | 11.304 |
| 1928.1 | 11.323 |
| 1928.1 | 11.332 |
| 1928.2 | 11.354 |
| 1928.3 | 11.367 |
| 1928.6 | 11.388 |
| 1928.8 | 11.397 |
| 1929.0 | 11.415 |
| 1929.0 | 11.421 |
| 1929.0 | 11.434 |
| 1929.3 | 11.444 |
| 1929.5 | 11.461 |
| 1929.8 | 11.473 |
| 1929.6 | 11.481 |
| 1929.8 | 11.497 |
| 1930.0 | 11.513 |
| 1930.1 | 11.536 |
| 1930.2 | 11.553 |
| 1930.5 | 11.575 |
| 1930.8 | 11.592 |
| 1931.1 | 11.61 |
| 1931.1 | 11.621 |
| 1931.3 | 11.63 |
| 1931.5 | 11.643 |
| 1931.7 | 11.659 |
| 1931.8 | 11.672 |
| 1931.9 | 11.685 |
| 1932.3 | 11.701 |
| 1935.9 | 11.696 |
| 1942.6 | 11.622 |
| 1945.3 | 11.481 |
| 1942.8 | 11.175 |
| 1941.2 | 10.975 |
| 1939.7 | 10.775 |
| 1939.0 | 10.702 |
| 1938.2 | 10.64 |
| 1938.0 | 10.617 |
| 1938.0 | 10.61 |
| 1938.0 | 10.608 |
| 1938.1 | 10.61 |
| 1938.1 | 10.61 |
| 1938.0 | 10.617 |
| 1938.2 | 10.624 |
| 1938.1 | 10.634 |
| 1938.3 | 10.649 |
| 1938.5 | 10.659 |
| 1938.5 | 10.673 |
| 1938.7 | 10.68 |
| 1938.8 | 10.688 |
| 1938.9 | 10.694 |
| 1938.9 | 10.71 |
| 1938.9 | 10.723 |
| 1939.0 | 10.74 |
| 1939.3 | 10.754 |
| 1939.5 | 10.77 |
| 1939.5 | 10.78 |
| 1939.6 | 10.796 |
| 1939.6 | 10.805 |
| 1939.9 | 10.827 |
| 1940.0 | 10.843 |
| 1940.1 | 10.853 |
| 1940.2 | 10.867 |
| 1940.4 | 10.876 |
| 1940.4 | 10.884 |
| 1940.6 | 10.892 |
| 1940.7 | 10.905 |
| 1940.8 | 10.919 |
| 1940.8 | 10.93 |
| 1940.8 | 10.947 |
| 1940.9 | 10.964 |
| 1941.2 | 10.979 |
| 1941.3 | 11.004 |
| 1941.6 | 11.02 |
| 1941.8 | 11.038 |
| 1941.8 | 11.051 |
| 1941.9 | 11.062 |
| 1942.1 | 11.078 |
| 1942.2 | 11.092 |
| 1942.3 | 11.105 |
| 1942.5 | 11.113 |
| 1942.7 | 11.14 |
| 1942.8 | 11.157 |
| 1943.2 | 11.172 |
| 1943.2 | 11.177 |
| 1943.3 | 11.198 |
| 1943.3 | 11.211 |
| 1943.5 | 11.231 |
| 1943.8 | 11.245 |
| 1944.0 | 11.264 |
| 1944.0 | 11.272 |
| 1944.1 | 11.289 |
| 1944.2 | 11.295 |
| 1944.4 | 11.313 |
| 1944.6 | 11.324 |
| 1944.6 | 11.336 |
| 1944.6 | 11.349 |
| 1944.6 | 11.364 |
| 1945.0 | 11.395 |
| 1945.1 | 11.411 |
| 1945.5 | 11.429 |
| 1945.8 | 11.441 |
| 1945.8 | 11.454 |
| 1945.9 | 11.463 |
| 1946.1 | 11.474 |
| 1946.1 | 11.487 |
| 1946.4 | 11.502 |
| 1946.6 | 11.513 |
| 1946.7 | 11.525 |
| 1947.1 | 11.536 |
| 1947.0 | 11.544 |
| 1946.9 | 11.569 |
| 1947.1 | 11.581 |
| 1947.4 | 11.611 |
| 1947.6 | 11.628 |
| 1947.8 | 11.656 |
| 1947.8 | 11.67 |
| 1948.4 | 11.699 |
| 1949.0 | 11.712 |
| 1954.2 | 11.687 |
| 1958.8 | 11.616 |
| 1961.5 | 11.389 |
| 1959.6 | 11.152 |
| 1957.1 | 10.837 |
| 1956.0 | 10.723 |
| 1955.0 | 10.631 |
| 1954.8 | 10.588 |
| 1954.6 | 10.556 |
| 1954.5 | 10.541 |
| 1954.3 | 10.537 |
| 1954.5 | 10.535 |
| 1954.5 | 10.539 |
| 1954.5 | 10.545 |
| 1954.5 | 10.55 |
| 1954.7 | 10.553 |
| 1954.6 | 10.563 |
| 1954.7 | 10.575 |
| 1954.8 | 10.59 |
| 1954.9 | 10.604 |
| 1955.0 | 10.617 |
| 1955.0 | 10.634 |
| 1955.2 | 10.648 |
| 1955.4 | 10.665 |
| 1955.6 | 10.678 |
| 1955.8 | 10.688 |
| 1955.6 | 10.7 |
| 1955.8 | 10.713 |
| 1956.0 | 10.728 |
| 1956.1 | 10.739 |
| 1956.1 | 10.759 |
| 1956.2 | 10.77 |
| 1956.6 | 10.791 |
| 1956.7 | 10.803 |
| 1956.8 | 10.819 |
| 1957.1 | 10.827 |
| 1957.2 | 10.844 |
| 1957.2 | 10.853 |
| 1957.3 | 10.869 |
| 1957.4 | 10.882 |
| 1957.7 | 10.9 |
| 1957.7 | 10.909 |
| 1957.8 | 10.928 |
| 1957.9 | 10.934 |
| 1958.0 | 10.952 |
| 1958.1 | 10.966 |
| 1958.5 | 10.989 |
| 1958.5 | 10.997 |
| 1958.5 | 11.012 |
| 1958.7 | 11.029 |
| 1959.0 | 11.042 |
| 1959.1 | 11.057 |
| 1959.2 | 11.067 |
| 1959.3 | 11.077 |
| 1959.4 | 11.086 |
| 1959.6 | 11.108 |
| 1959.6 | 11.118 |
| 1959.6 | 11.135 |
| 1959.7 | 11.152 |
| 1959.9 | 11.18 |
| 1960.1 | 11.2 |
| 1960.4 | 11.223 |
| 1960.4 | 11.234 |
| 1960.5 | 11.254 |
| 1960.6 | 11.271 |
| 1960.7 | 11.284 |
| 1961.1 | 11.302 |
| 1961.2 | 11.319 |
| 1961.6 | 11.332 |
| 1961.7 | 11.337 |
| 1961.7 | 11.351 |
| 1961.6 | 11.363 |
| 1961.8 | 11.387 |
| 1962.0 | 11.404 |
| 1962.5 | 11.43 |
| 1962.6 | 11.443 |
| 1962.8 | 11.456 |
| 1962.9 | 11.467 |
| 1963.0 | 11.484 |
| 1963.2 | 11.493 |
| 1963.4 | 11.503 |
| 1963.4 | 11.518 |
| 1963.5 | 11.531 |
| 1963.8 | 11.549 |
| 1964.1 | 11.558 |
| 1964.2 | 11.573 |
| 1964.3 | 11.584 |
| 1964.2 | 11.604 |
| 1964.3 | 11.613 |
| 1964.7 | 11.647 |
| 1965.0 | 11.668 |
| 1965.4 | 11.689 |
| 1965.6 | 11.692 |
| 1970.2 | 11.672 |
| 1975.0 | 11.615 |
| 1978.5 | 11.406 |
| 1976.6 | 11.174 |
| 1974.2 | 10.849 |
| 1973.1 | 10.725 |
| 1972.4 | 10.65 |
| 1971.7 | 10.582 |
| 1971.4 | 10.554 |
| 1971.2 | 10.539 |
| 1971.3 | 10.54 |
| 1971.2 | 10.533 |
| 1971.2 | 10.54 |
| 1971.4 | 10.551 |
| 1971.3 | 10.556 |
| 1971.4 | 10.567 |
| 1971.4 | 10.576 |
| 1971.8 | 10.593 |
| 1971.8 | 10.602 |
| 1971.9 | 10.611 |
| 1972.0 | 10.621 |
| 1972.0 | 10.63 |
| 1972.3 | 10.65 |
| 1972.4 | 10.66 |
| 1972.6 | 10.677 |
| 1972.7 | 10.687 |
| 1972.7 | 10.699 |
| 1972.7 | 10.708 |
| 1973.0 | 10.724 |
| 1973.1 | 10.731 |
| 1973.2 | 10.746 |
| 1973.1 | 10.758 |
| 1973.1 | 10.78 |
| 1973.2 | 10.794 |
| 1973.7 | 10.825 |
| 1973.8 | 10.837 |
| 1973.9 | 10.851 |
| 1974.0 | 10.865 |
| 1974.3 | 10.884 |
| 1974.3 | 10.895 |
| 1974.4 | 10.906 |
| 1974.4 | 10.917 |
| 1974.5 | 10.93 |
| 1974.6 | 10.951 |
| 1974.7 | 10.969 |
| 1975.0 | 10.985 |
| 1975.2 | 10.998 |
| 1975.3 | 11.011 |
| 1975.5 | 11.022 |
| 1975.7 | 11.037 |
| 1975.8 | 11.05 |
| 1975.9 | 11.061 |
| 1976.1 | 11.08 |
| 1976.2 | 11.09 |
| 1976.4 | 11.103 |
| 1976.4 | 11.111 |
| 1976.5 | 11.126 |
| 1976.5 | 11.137 |
| 1976.6 | 11.16 |
| 1976.8 | 11.177 |
| 1977.0 | 11.203 |
| 1977.2 | 11.216 |
| 1977.5 | 11.238 |
| 1977.5 | 11.252 |
| 1977.6 | 11.275 |
| 1977.7 | 11.285 |
| 1978.1 | 11.306 |
| 1978.2 | 11.315 |
| 1978.3 | 11.326 |
| 1978.4 | 11.343 |
| 1978.5 | 11.354 |
| 1978.8 | 11.366 |
| 1978.9 | 11.377 |
| 1978.9 | 11.393 |
| 1978.9 | 11.407 |
| 1979.3 | 11.428 |
| 1979.5 | 11.444 |
| 1979.7 | 11.463 |
| 1979.9 | 11.481 |
| 1979.9 | 11.495 |
| 1980.0 | 11.508 |
| 1980.2 | 11.529 |
| 1980.4 | 11.544 |
| 1980.6 | 11.555 |
| 1980.7 | 11.57 |
| 1980.9 | 11.584 |
| 1981.3 | 11.606 |
| 1981.4 | 11.617 |
| 1981.5 | 11.632 |
| 1981.6 | 11.645 |
| 1982.1 | 11.67 |
| 1982.3 | 11.681 |
| 1985.1 | 11.675 |
| 1989.9 | 11.65 |
| 1995.5 | 11.475 |
| 1994.7 | 11.261 |
| 1991.5 | 10.948 |
| 1990.2 | 10.785 |
| 1989.0 | 10.647 |
| 1988.6 | 10.604 |
| 1988.3 | 10.559 |
| 1988.2 | 10.546 |
| 1988.0 | 10.536 |
| 1988.0 | 10.535 |
| 1988.0 | 10.539 |
| 1988.2 | 10.544 |
| 1988.2 | 10.548 |
| 1988.3 | 10.558 |
| 1988.3 | 10.565 |
| 1988.4 | 10.577 |
| 1988.5 | 10.585 |
| 1988.6 | 10.603 |
| 1988.6 | 10.617 |
| 1988.8 | 10.638 |
| 1988.9 | 10.647 |
| 1989.1 | 10.665 |
| 1989.1 | 10.676 |
| 1989.2 | 10.689 |
| 1989.5 | 10.705 |
| 1989.6 | 10.714 |
| 1989.8 | 10.729 |
| 1989.9 | 10.737 |
| 1989.9 | 10.746 |
| 1990.1 | 10.751 |
| 1990.1 | 10.766 |
| 1990.2 | 10.782 |
| 1990.4 | 10.8 |
| 1990.4 | 10.814 |
| 1990.5 | 10.833 |
| 1990.4 | 10.846 |
| 1990.7 | 10.867 |
| 1990.9 | 10.885 |
| 1991.0 | 10.901 |
| 1991.1 | 10.92 |
| 1991.2 | 10.932 |
| 1991.4 | 10.948 |
| 1991.2 | 10.96 |
| 1991.6 | 10.986 |
| 1991.8 | 10.999 |
| 1992.1 | 11.012 |
| 1992.2 | 11.026 |
| 1992.2 | 11.04 |
| 1992.3 | 11.049 |
| 1992.6 | 11.067 |
| 1992.7 | 11.084 |
| 1992.9 | 11.102 |
| 1993.0 | 11.115 |
| 1993.1 | 11.13 |
| 1993.1 | 11.14 |
| 1993.1 | 11.148 |
| 1993.3 | 11.175 |
| 1993.5 | 11.188 |
| 1993.7 | 11.21 |
| 1993.9 | 11.224 |
| 1994.0 | 11.251 |
| 1994.3 | 11.264 |
| 1994.6 | 11.279 |
| 1994.6 | 11.286 |
| 1994.7 | 11.306 |
| 1994.8 | 11.315 |
| 1995.2 | 11.334 |
| 1995.4 | 11.341 |
| 1995.4 | 11.355 |
| 1995.6 | 11.363 |
| 1995.6 | 11.371 |
| 1995.9 | 11.384 |
| 1995.9 | 11.394 |
| 1996.1 | 11.415 |
| 1996.2 | 11.433 |
| 1996.4 | 11.451 |
| 1996.6 | 11.463 |
| 1996.7 | 11.484 |
| 1996.9 | 11.498 |
| 1997.2 | 11.513 |
| 1997.3 | 11.524 |
| 1997.3 | 11.542 |
| 1997.4 | 11.555 |
| 1997.8 | 11.576 |
| 1998.0 | 11.589 |
| 1998.2 | 11.612 |
| 1998.4 | 11.624 |
| 1998.6 | 11.633 |
| 1999.0 | 11.643 |
| 1999.0 | 11.647 |
| 1999.0 | 11.659 |
| 1999.1 | 11.669 |
| 1999.9 | 11.681 |
| 2004.7 | 11.674 |
| 2011.9 | 11.554 |
| 2013.9 | 11.372 |
| 2010.6 | 11.009 |
| 2008.7 | 10.793 |
| 2007.2 | 10.584 |
| 2006.4 | 10.506 |
| 2005.8 | 10.445 |
| 2005.6 | 10.424 |
| 2005.5 | 10.411 |
| 2005.5 | 10.403 |
| 2005.5 | 10.401 |
| 2005.5 | 10.408 |
| 2005.6 | 10.411 |
| 2005.6 | 10.419 |
| 2005.7 | 10.424 |
| 2005.8 | 10.436 |
| 2006.0 | 10.444 |
| 2006.0 | 10.454 |
| 2006.0 | 10.46 |
| 2006.2 | 10.479 |
| 2006.2 | 10.491 |
| 2006.4 | 10.514 |
| 2006.4 | 10.524 |
| 2006.4 | 10.54 |
| 2006.7 | 10.562 |
| 2006.9 | 10.586 |
| 2007.2 | 10.597 |
| 2007.2 | 10.609 |
| 2007.2 | 10.621 |
| 2007.4 | 10.631 |
| 2007.5 | 10.649 |
| 2007.6 | 10.663 |
| 2007.9 | 10.678 |
| 2008.0 | 10.689 |
| 2008.1 | 10.705 |
| 2008.3 | 10.717 |
| 2008.5 | 10.731 |
| 2008.5 | 10.742 |
| 2008.5 | 10.754 |
| 2008.6 | 10.775 |
| 2008.8 | 10.793 |
| 2008.9 | 10.804 |
| 2008.9 | 10.817 |
| 2009.1 | 10.834 |
| 2009.2 | 10.845 |
| 2009.5 | 10.861 |
| 2009.5 | 10.877 |
| 2009.8 | 10.892 |
| 2009.8 | 10.905 |
| 2010.0 | 10.923 |
| 2010.1 | 10.939 |
| 2010.4 | 10.959 |
| 2010.5 | 10.974 |
| 2010.5 | 10.986 |
| 2010.7 | 11 |
| 2010.7 | 11.017 |
| 2010.8 | 11.028 |
| 2011.1 | 11.038 |
| 2011.2 | 11.048 |
| 2011.3 | 11.052 |
| 2011.3 | 11.055 |
| 2011.3 | 11.054 |
| 2011.2 | 11.057 |
| 2011.3 | 11.058 |
| 2011.4 | 11.066 |
| 2011.4 | 11.065 |
| 2011.5 | 11.062 |
| 2011.3 | 11.058 |
| 2011.2 | 11.058 |
| 2011.2 | 11.058 |
| 2011.2 | 11.061 |
| 2011.2 | 11.062 |
| 2011.3 | 11.063 |
| 2011.4 | 11.062 |
| 2011.4 | 11.065 |
| 2011.3 | 11.062 |
| 2011.3 | 11.058 |
| 2011.4 | 11.063 |
| 2011.4 | 11.066 |
| 2011.3 | 11.066 |
| 2011.3 | 11.065 |
| 2011.3 | 11.066 |
| 2011.3 | 11.062 |
| 2011.3 | 11.063 |
| 2011.4 | 11.061 |
| 2011.4 | 11.056 |
| 2011.4 | 11.056 |
| 2011.3 | 11.055 |
| 2011.3 | 11.051 |
| 2011.3 | 11.057 |
| 2011.4 | 11.061 |
| 2011.4 | 11.062 |
| 2011.5 | 11.058 |
| 2011.4 | 11.062 |
| 2011.4 | 11.06 |
| 2011.4 | 11.06 |
| 2011.4 | 11.056 |
| 2011.5 | 11.054 |
| 2011.5 | 11.049 |
| 2011.4 | 11.05 |
| 2011.5 | 11.045 |
| 2011.5 | 11.049 |
| 2011.5 | 11.048 |
| 2011.5 | 11.051 |
| 2011.4 | 11.048 |
| 2011.4 | 11.048 |
| 2011.5 | 11.048 |
| 2011.7 | 11.05 |
| 2011.7 | 11.046 |
| 2011.7 | 11.044 |
| 2011.5 | 11.038 |
| 2011.5 | 11.037 |
| 2011.4 | 11.033 |
| 2011.4 | 11.035 |
| 2011.4 | 11.037 |
| 2011.3 | 11.042 |
| 2011.4 | 11.044 |
| 2011.4 | 11.048 |
| 2011.5 | 11.051 |
| 2011.3 | 11.052 |
| 2011.4 | 11.049 |
| 2011.5 | 11.045 |
| 2011.5 | 11.042 |
| 2011.5 | 11.035 |
| 2011.4 | 11.034 |
| 2011.4 | 11.035 |
| 2011.4 | 11.039 |
| 2011.4 | 11.039 |
| 2011.4 | 11.039 |
| 2011.7 | 11.037 |
| 2011.5 | 11.035 |
| 2011.5 | 11.031 |
| 2011.5 | 11.033 |
| 2011.4 | 11.033 |
| 2011.3 | 11.035 |
| 2011.4 | 11.034 |
| 2011.3 | 11.04 |
| 2011.4 | 11.039 |
| 2011.5 | 11.038 |
| 2011.5 | 11.037 |
| 2011.4 | 11.032 |
| 2011.4 | 11.029 |
| 2011.3 | 11.033 |
| 2011.3 | 11.033 |
| 2011.3 | 11.037 |
| 2011.4 | 11.037 |
| 2011.5 | 11.04 |
| 2011.4 | 11.033 |
| 2011.4 | 11.033 |
| 2011.5 | 11.034 |
| 2011.5 | 11.034 |
| 2011.5 | 11.031 |
| 2011.5 | 11.028 |
| 2011.5 | 11.023 |
| 2011.7 | 11.022 |
| 2011.5 | 11.02 |
| 2011.4 | 11.021 |
| 2011.4 | 11.022 |
| 2011.3 | 11.025 |
| 2011.4 | 11.023 |
| 2011.5 | 11.028 |
| 2011.5 | 11.031 |
| 2011.5 | 11.026 |
| 2011.4 | 11.02 |
| 2011.4 | 11.02 |
| 2011.4 | 11.021 |
| 2011.4 | 11.02 |
| 2011.4 | 11.019 |
| 2011.4 | 11.019 |
| 2011.7 | 11.02 |
| 2011.5 | 11.02 |
| 2011.5 | 11.02 |
| 2011.5 | 11.014 |
| 2011.5 | 11.015 |
| 2011.4 | 11.012 |
| 2011.4 | 11.012 |
| 2011.3 | 11.012 |
| 2011.4 | 11.019 |
| 2011.4 | 11.017 |
| 2011.5 | 11.017 |
| 2011.5 | 11.011 |
| 2011.4 | 11.014 |
| 2011.4 | 11.012 |
| 2011.3 | 11.015 |
| 2011.3 | 11.015 |
| 2011.4 | 11.022 |
| 2011.4 | 11.021 |
| 2011.4 | 11.02 |
| 2011.3 | 11.019 |
| 2011.4 | 11.021 |
| 2011.4 | 11.017 |
| 2011.4 | 11.016 |
| 2011.4 | 11.017 |
| 2011.4 | 11.019 |
| 2011.4 | 11.017 |
| 2011.4 | 11.016 |
| 2011.4 | 11.019 |
| 2011.4 | 11.02 |
| 2011.3 | 11.021 |
| 2011.3 | 11.02 |
| 2011.3 | 11.02 |
| 2011.4 | 11.023 |
| 2011.3 | 11.02 |
| 2011.4 | 11.016 |
| 2011.4 | 11.014 |
| 2011.4 | 11.012 |
| 2011.4 | 11.009 |
| 2011.4 | 11.005 |
| 2011.4 | 11.01 |
| 2011.5 | 11.008 |
| 2011.4 | 11.008 |
| 2011.5 | 11.005 |
| 2011.5 | 11.006 |
| 2011.5 | 11.006 |
| 2011.5 | 11.008 |
| 2011.4 | 11.003 |
| 2011.4 | 11.005 |
| 2011.3 | 11.004 |
| 2011.3 | 11.005 |
| 2011.4 | 11.003 |
| 2011.3 | 11.006 |
| 2011.4 | 11.008 |
| 2011.4 | 11.011 |
| 2011.4 | 11.008 |
| 2011.4 | 11.005 |
| 2011.3 | 11.005 |
| 2011.4 | 11.006 |
| 2011.4 | 11.004 |
| 2011.4 | 11.004 |
| 2011.4 | 11.002 |
| 2011.3 | 11.002 |
| 2011.3 | 11.002 |
| 2011.3 | 11.003 |
| 2011.4 | 11.003 |
| 2011.4 | 10.998 |
| 2011.3 | 10.997 |
| 2011.3 | 10.997 |
| 2011.3 | 10.997 |
| 2011.4 | 10.999 |
| 2011.5 | 10.998 |
| 2011.5 | 11 |
| 2011.5 | 10.999 |
| 2011.4 | 10.998 |
| 2011.4 | 10.993 |
| 2011.4 | 10.992 |
| 2011.3 | 10.989 |
| 2011.3 | 10.987 |
| 2011.2 | 10.987 |
| 2011.3 | 10.988 |
| 2011.4 | 10.992 |
| 2011.4 | 10.992 |
| 2011.3 | 10.993 |
| 2011.3 | 10.993 |
| 2011.3 | 10.998 |
| 2011.3 | 10.998 |
| 2011.4 | 11 |
| 2011.4 | 10.998 |
| 2011.4 | 10.998 |
| 2011.4 | 10.993 |
| 2011.4 | 10.992 |
| 2011.3 | 10.988 |
| 2011.3 | 10.992 |
| 2011.3 | 10.989 |
| 2011.3 | 10.994 |
| 2011.4 | 10.994 |
| 2011.5 | 10.994 |
| 2011.4 | 10.991 |
| 2011.4 | 10.989 |
| 2011.4 | 10.989 |
| 2011.3 | 10.991 |
| 2011.4 | 10.988 |
| 2011.4 | 10.989 |
| 2011.4 | 10.986 |
| 2011.4 | 10.987 |
| 2011.4 | 10.981 |
| 2011.4 | 10.98 |
| 2011.4 | 10.98 |
| 2011.3 | 10.981 |
| 2011.4 | 10.976 |
| 2011.4 | 10.977 |
| 2011.4 | 10.979 |
| 2011.3 | 10.979 |
| 2011.2 | 10.98 |
| 2011.4 | 10.983 |
| 2011.5 | 10.983 |
| 2011.4 | 10.976 |
| 2011.4 | 10.972 |
| 2011.3 | 10.968 |
| 2011.3 | 10.97 |
| 2011.4 | 10.966 |
| 2011.4 | 10.969 |
| 2011.4 | 10.974 |
| 2011.3 | 10.979 |
| 2011.3 | 10.975 |
| 2011.4 | 10.979 |
| 2011.5 | 10.977 |
| 2011.3 | 10.976 |
| 2011.3 | 10.977 |
| 2011.4 | 10.98 |
| 2011.5 | 10.977 |
| 2011.4 | 10.976 |
| 2011.3 | 10.972 |
| 2011.3 | 10.974 |
| 2011.3 | 10.974 |
| 2011.4 | 10.979 |
| 2011.3 | 10.976 |
| 2011.3 | 10.976 |
| 2011.5 | 10.976 |
| 2011.5 | 10.977 |
| 2011.5 | 10.972 |
| 2011.4 | 10.968 |
| 2011.4 | 10.964 |
| 2011.3 | 10.963 |
| 2011.2 | 10.964 |
| 2011.2 | 10.964 |
| 2011.4 | 10.966 |
| 2011.4 | 10.969 |
| 2011.4 | 10.969 |